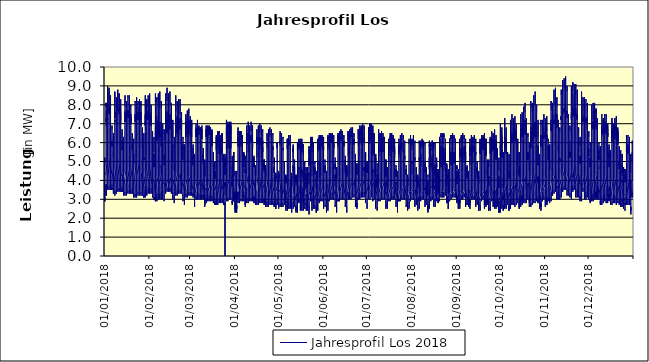
| Category | Jahresprofil Los 2018 |
|---|---|
| 01/01/2018 | 3.5 |
| 01/01/2018 | 3.3 |
| 01/01/2018 | 3.1 |
| 01/01/2018 | 3 |
| 01/01/2018 | 3.1 |
| 01/01/2018 | 2.9 |
| 01/01/2018 | 3 |
| 01/01/2018 | 2.9 |
| 01/01/2018 | 3.2 |
| 01/01/2018 | 3.2 |
| 01/01/2018 | 4 |
| 01/01/2018 | 4.4 |
| 01/01/2018 | 4.3 |
| 01/01/2018 | 4.5 |
| 01/01/2018 | 4.6 |
| 01/01/2018 | 4.7 |
| 01/01/2018 | 5.1 |
| 01/01/2018 | 5 |
| 01/01/2018 | 5.2 |
| 01/01/2018 | 5 |
| 01/01/2018 | 4.4 |
| 01/01/2018 | 4.3 |
| 01/01/2018 | 3.8 |
| 02/01/2018 | 3.5 |
| 02/01/2018 | 3.8 |
| 02/01/2018 | 3.2 |
| 02/01/2018 | 3.5 |
| 02/01/2018 | 3.2 |
| 02/01/2018 | 3.4 |
| 02/01/2018 | 3.7 |
| 02/01/2018 | 4.9 |
| 02/01/2018 | 5.8 |
| 02/01/2018 | 6.4 |
| 02/01/2018 | 6.8 |
| 02/01/2018 | 6.8 |
| 02/01/2018 | 7 |
| 02/01/2018 | 7.2 |
| 02/01/2018 | 7.3 |
| 02/01/2018 | 7.1 |
| 02/01/2018 | 7.1 |
| 02/01/2018 | 7.7 |
| 02/01/2018 | 8.1 |
| 02/01/2018 | 7.9 |
| 02/01/2018 | 8.1 |
| 02/01/2018 | 6.8 |
| 02/01/2018 | 6.1 |
| 02/01/2018 | 5.6 |
| 03/01/2018 | 4.9 |
| 03/01/2018 | 4.1 |
| 03/01/2018 | 4 |
| 03/01/2018 | 3.7 |
| 03/01/2018 | 3.5 |
| 03/01/2018 | 3.7 |
| 03/01/2018 | 4.2 |
| 03/01/2018 | 5 |
| 03/01/2018 | 6 |
| 03/01/2018 | 7 |
| 03/01/2018 | 7.3 |
| 03/01/2018 | 7.2 |
| 03/01/2018 | 7.3 |
| 03/01/2018 | 7.5 |
| 03/01/2018 | 7.7 |
| 03/01/2018 | 7.6 |
| 03/01/2018 | 7.7 |
| 03/01/2018 | 8.5 |
| 03/01/2018 | 9 |
| 03/01/2018 | 7.8 |
| 03/01/2018 | 7.7 |
| 03/01/2018 | 7.4 |
| 03/01/2018 | 6.7 |
| 03/01/2018 | 6 |
| 04/01/2018 | 5.1 |
| 04/01/2018 | 4.1 |
| 04/01/2018 | 4 |
| 04/01/2018 | 3.7 |
| 04/01/2018 | 3.5 |
| 04/01/2018 | 3.7 |
| 04/01/2018 | 4.1 |
| 04/01/2018 | 4.9 |
| 04/01/2018 | 6 |
| 04/01/2018 | 6.9 |
| 04/01/2018 | 7.2 |
| 04/01/2018 | 7.5 |
| 04/01/2018 | 7.6 |
| 04/01/2018 | 7.9 |
| 04/01/2018 | 7.7 |
| 04/01/2018 | 7.5 |
| 04/01/2018 | 7.5 |
| 04/01/2018 | 8.8 |
| 04/01/2018 | 8.9 |
| 04/01/2018 | 7.9 |
| 04/01/2018 | 7.7 |
| 04/01/2018 | 7.5 |
| 04/01/2018 | 6.8 |
| 04/01/2018 | 6 |
| 05/01/2018 | 5.2 |
| 05/01/2018 | 4.2 |
| 05/01/2018 | 3.5 |
| 05/01/2018 | 3.7 |
| 05/01/2018 | 3.5 |
| 05/01/2018 | 3.7 |
| 05/01/2018 | 4.1 |
| 05/01/2018 | 5.3 |
| 05/01/2018 | 6.3 |
| 05/01/2018 | 6.8 |
| 05/01/2018 | 7.1 |
| 05/01/2018 | 7 |
| 05/01/2018 | 7.5 |
| 05/01/2018 | 7.5 |
| 05/01/2018 | 7.5 |
| 05/01/2018 | 7.6 |
| 05/01/2018 | 7.5 |
| 05/01/2018 | 8.2 |
| 05/01/2018 | 8.5 |
| 05/01/2018 | 7.8 |
| 05/01/2018 | 7.6 |
| 05/01/2018 | 7 |
| 05/01/2018 | 6.5 |
| 05/01/2018 | 5.6 |
| 06/01/2018 | 4.7 |
| 06/01/2018 | 4.3 |
| 06/01/2018 | 3.8 |
| 06/01/2018 | 3.5 |
| 06/01/2018 | 3.6 |
| 06/01/2018 | 3.5 |
| 06/01/2018 | 3.5 |
| 06/01/2018 | 3.8 |
| 06/01/2018 | 4.5 |
| 06/01/2018 | 5 |
| 06/01/2018 | 5.4 |
| 06/01/2018 | 6.1 |
| 06/01/2018 | 5.9 |
| 06/01/2018 | 5.9 |
| 06/01/2018 | 5.8 |
| 06/01/2018 | 5.9 |
| 06/01/2018 | 6 |
| 06/01/2018 | 6.9 |
| 06/01/2018 | 6.7 |
| 06/01/2018 | 6.3 |
| 06/01/2018 | 6.3 |
| 06/01/2018 | 6.3 |
| 06/01/2018 | 5.7 |
| 06/01/2018 | 4.9 |
| 07/01/2018 | 4.5 |
| 07/01/2018 | 4 |
| 07/01/2018 | 3.6 |
| 07/01/2018 | 3.4 |
| 07/01/2018 | 3.4 |
| 07/01/2018 | 3.3 |
| 07/01/2018 | 3.5 |
| 07/01/2018 | 3.6 |
| 07/01/2018 | 3.6 |
| 07/01/2018 | 4.4 |
| 07/01/2018 | 4.8 |
| 07/01/2018 | 5.1 |
| 07/01/2018 | 5.4 |
| 07/01/2018 | 5.4 |
| 07/01/2018 | 5.5 |
| 07/01/2018 | 5.2 |
| 07/01/2018 | 5.2 |
| 07/01/2018 | 6.2 |
| 07/01/2018 | 6.5 |
| 07/01/2018 | 6 |
| 07/01/2018 | 6 |
| 07/01/2018 | 6.1 |
| 07/01/2018 | 5.7 |
| 07/01/2018 | 5 |
| 08/01/2018 | 4.4 |
| 08/01/2018 | 4 |
| 08/01/2018 | 3.6 |
| 08/01/2018 | 3.4 |
| 08/01/2018 | 3.2 |
| 08/01/2018 | 3.5 |
| 08/01/2018 | 4 |
| 08/01/2018 | 4.9 |
| 08/01/2018 | 5.9 |
| 08/01/2018 | 6.8 |
| 08/01/2018 | 7.2 |
| 08/01/2018 | 7.1 |
| 08/01/2018 | 7.2 |
| 08/01/2018 | 7.4 |
| 08/01/2018 | 7.3 |
| 08/01/2018 | 7.6 |
| 08/01/2018 | 7.5 |
| 08/01/2018 | 8.1 |
| 08/01/2018 | 8.7 |
| 08/01/2018 | 8.1 |
| 08/01/2018 | 8 |
| 08/01/2018 | 7.2 |
| 08/01/2018 | 6.5 |
| 08/01/2018 | 5.6 |
| 09/01/2018 | 4.8 |
| 09/01/2018 | 3.8 |
| 09/01/2018 | 3.7 |
| 09/01/2018 | 3.5 |
| 09/01/2018 | 3.3 |
| 09/01/2018 | 3.5 |
| 09/01/2018 | 4 |
| 09/01/2018 | 5.3 |
| 09/01/2018 | 6.3 |
| 09/01/2018 | 6.8 |
| 09/01/2018 | 7 |
| 09/01/2018 | 7.4 |
| 09/01/2018 | 7.4 |
| 09/01/2018 | 7.6 |
| 09/01/2018 | 7.4 |
| 09/01/2018 | 7.7 |
| 09/01/2018 | 7.7 |
| 09/01/2018 | 8.3 |
| 09/01/2018 | 8.4 |
| 09/01/2018 | 7.8 |
| 09/01/2018 | 7.7 |
| 09/01/2018 | 7.3 |
| 09/01/2018 | 6.5 |
| 09/01/2018 | 5.7 |
| 10/01/2018 | 4.8 |
| 10/01/2018 | 4 |
| 10/01/2018 | 3.8 |
| 10/01/2018 | 3.6 |
| 10/01/2018 | 3.4 |
| 10/01/2018 | 3.6 |
| 10/01/2018 | 4 |
| 10/01/2018 | 5.4 |
| 10/01/2018 | 6.4 |
| 10/01/2018 | 6.8 |
| 10/01/2018 | 7.1 |
| 10/01/2018 | 7.5 |
| 10/01/2018 | 7.5 |
| 10/01/2018 | 7.7 |
| 10/01/2018 | 7.9 |
| 10/01/2018 | 7.7 |
| 10/01/2018 | 7.7 |
| 10/01/2018 | 8.6 |
| 10/01/2018 | 8.8 |
| 10/01/2018 | 8.1 |
| 10/01/2018 | 8 |
| 10/01/2018 | 7.1 |
| 10/01/2018 | 6.4 |
| 10/01/2018 | 5.7 |
| 11/01/2018 | 4.9 |
| 11/01/2018 | 4 |
| 11/01/2018 | 3.9 |
| 11/01/2018 | 3.6 |
| 11/01/2018 | 3.4 |
| 11/01/2018 | 3.6 |
| 11/01/2018 | 4 |
| 11/01/2018 | 5.3 |
| 11/01/2018 | 6.3 |
| 11/01/2018 | 6.7 |
| 11/01/2018 | 6.9 |
| 11/01/2018 | 7.3 |
| 11/01/2018 | 7.4 |
| 11/01/2018 | 7.5 |
| 11/01/2018 | 7.8 |
| 11/01/2018 | 7.6 |
| 11/01/2018 | 7.5 |
| 11/01/2018 | 8.4 |
| 11/01/2018 | 8.6 |
| 11/01/2018 | 8.2 |
| 11/01/2018 | 8 |
| 11/01/2018 | 7.2 |
| 11/01/2018 | 6.4 |
| 11/01/2018 | 5.7 |
| 12/01/2018 | 4.9 |
| 12/01/2018 | 4.1 |
| 12/01/2018 | 3.9 |
| 12/01/2018 | 3.6 |
| 12/01/2018 | 3.4 |
| 12/01/2018 | 3.6 |
| 12/01/2018 | 4 |
| 12/01/2018 | 5.2 |
| 12/01/2018 | 6.1 |
| 12/01/2018 | 6.6 |
| 12/01/2018 | 6.9 |
| 12/01/2018 | 7.2 |
| 12/01/2018 | 7.2 |
| 12/01/2018 | 7.2 |
| 12/01/2018 | 7.6 |
| 12/01/2018 | 7.2 |
| 12/01/2018 | 7 |
| 12/01/2018 | 7.9 |
| 12/01/2018 | 8.3 |
| 12/01/2018 | 7.6 |
| 12/01/2018 | 7.4 |
| 12/01/2018 | 6.7 |
| 12/01/2018 | 6.2 |
| 12/01/2018 | 5.3 |
| 13/01/2018 | 4.4 |
| 13/01/2018 | 4.2 |
| 13/01/2018 | 3.7 |
| 13/01/2018 | 3.4 |
| 13/01/2018 | 3.5 |
| 13/01/2018 | 3.4 |
| 13/01/2018 | 3.4 |
| 13/01/2018 | 3.7 |
| 13/01/2018 | 4.4 |
| 13/01/2018 | 4.8 |
| 13/01/2018 | 5.7 |
| 13/01/2018 | 5.9 |
| 13/01/2018 | 6.1 |
| 13/01/2018 | 6.1 |
| 13/01/2018 | 6 |
| 13/01/2018 | 5.6 |
| 13/01/2018 | 6 |
| 13/01/2018 | 6.1 |
| 13/01/2018 | 6.6 |
| 13/01/2018 | 6.7 |
| 13/01/2018 | 6.1 |
| 13/01/2018 | 6 |
| 13/01/2018 | 5.4 |
| 13/01/2018 | 5.2 |
| 14/01/2018 | 4.3 |
| 14/01/2018 | 3.9 |
| 14/01/2018 | 3.5 |
| 14/01/2018 | 3.3 |
| 14/01/2018 | 3.4 |
| 14/01/2018 | 3.2 |
| 14/01/2018 | 3.4 |
| 14/01/2018 | 3.6 |
| 14/01/2018 | 4 |
| 14/01/2018 | 4.2 |
| 14/01/2018 | 4.6 |
| 14/01/2018 | 4.9 |
| 14/01/2018 | 5.1 |
| 14/01/2018 | 5.1 |
| 14/01/2018 | 5.2 |
| 14/01/2018 | 5.3 |
| 14/01/2018 | 5.4 |
| 14/01/2018 | 6 |
| 14/01/2018 | 6.3 |
| 14/01/2018 | 6.3 |
| 14/01/2018 | 5.8 |
| 14/01/2018 | 5.8 |
| 14/01/2018 | 5.4 |
| 14/01/2018 | 4.7 |
| 15/01/2018 | 4.2 |
| 15/01/2018 | 3.8 |
| 15/01/2018 | 3.4 |
| 15/01/2018 | 3.3 |
| 15/01/2018 | 3.2 |
| 15/01/2018 | 3.4 |
| 15/01/2018 | 3.9 |
| 15/01/2018 | 4.8 |
| 15/01/2018 | 6.2 |
| 15/01/2018 | 6.6 |
| 15/01/2018 | 7 |
| 15/01/2018 | 7.4 |
| 15/01/2018 | 7.4 |
| 15/01/2018 | 7.6 |
| 15/01/2018 | 7.4 |
| 15/01/2018 | 7.2 |
| 15/01/2018 | 7.1 |
| 15/01/2018 | 7.7 |
| 15/01/2018 | 8.5 |
| 15/01/2018 | 7.9 |
| 15/01/2018 | 7.8 |
| 15/01/2018 | 6.9 |
| 15/01/2018 | 6.1 |
| 15/01/2018 | 5.3 |
| 16/01/2018 | 4.5 |
| 16/01/2018 | 4.2 |
| 16/01/2018 | 3.6 |
| 16/01/2018 | 3.4 |
| 16/01/2018 | 3.2 |
| 16/01/2018 | 3.4 |
| 16/01/2018 | 3.9 |
| 16/01/2018 | 5.2 |
| 16/01/2018 | 6.1 |
| 16/01/2018 | 6.5 |
| 16/01/2018 | 7.3 |
| 16/01/2018 | 7.1 |
| 16/01/2018 | 7.7 |
| 16/01/2018 | 7.3 |
| 16/01/2018 | 7.5 |
| 16/01/2018 | 7.3 |
| 16/01/2018 | 7.2 |
| 16/01/2018 | 7.9 |
| 16/01/2018 | 8.2 |
| 16/01/2018 | 8.1 |
| 16/01/2018 | 8 |
| 16/01/2018 | 7 |
| 16/01/2018 | 6.2 |
| 16/01/2018 | 5.4 |
| 17/01/2018 | 4.6 |
| 17/01/2018 | 3.8 |
| 17/01/2018 | 3.7 |
| 17/01/2018 | 3.5 |
| 17/01/2018 | 3.3 |
| 17/01/2018 | 3.5 |
| 17/01/2018 | 3.9 |
| 17/01/2018 | 5.3 |
| 17/01/2018 | 6.2 |
| 17/01/2018 | 6.6 |
| 17/01/2018 | 7.4 |
| 17/01/2018 | 7.3 |
| 17/01/2018 | 7.7 |
| 17/01/2018 | 7.3 |
| 17/01/2018 | 7.5 |
| 17/01/2018 | 7.3 |
| 17/01/2018 | 7.7 |
| 17/01/2018 | 8.3 |
| 17/01/2018 | 8.5 |
| 17/01/2018 | 8.4 |
| 17/01/2018 | 7.8 |
| 17/01/2018 | 7.4 |
| 17/01/2018 | 6.1 |
| 17/01/2018 | 5.4 |
| 18/01/2018 | 4.6 |
| 18/01/2018 | 3.9 |
| 18/01/2018 | 3.7 |
| 18/01/2018 | 3.5 |
| 18/01/2018 | 3.3 |
| 18/01/2018 | 3.5 |
| 18/01/2018 | 3.9 |
| 18/01/2018 | 5.2 |
| 18/01/2018 | 6.1 |
| 18/01/2018 | 7 |
| 18/01/2018 | 7.2 |
| 18/01/2018 | 7.1 |
| 18/01/2018 | 7.6 |
| 18/01/2018 | 7.7 |
| 18/01/2018 | 7.4 |
| 18/01/2018 | 7.7 |
| 18/01/2018 | 7.5 |
| 18/01/2018 | 8.1 |
| 18/01/2018 | 8.4 |
| 18/01/2018 | 8.5 |
| 18/01/2018 | 7.8 |
| 18/01/2018 | 6.9 |
| 18/01/2018 | 6.1 |
| 18/01/2018 | 5.4 |
| 19/01/2018 | 4.7 |
| 19/01/2018 | 3.9 |
| 19/01/2018 | 3.8 |
| 19/01/2018 | 3.5 |
| 19/01/2018 | 3.3 |
| 19/01/2018 | 3.5 |
| 19/01/2018 | 3.9 |
| 19/01/2018 | 5.1 |
| 19/01/2018 | 5.9 |
| 19/01/2018 | 6.9 |
| 19/01/2018 | 7.2 |
| 19/01/2018 | 7 |
| 19/01/2018 | 7.5 |
| 19/01/2018 | 7.4 |
| 19/01/2018 | 7.2 |
| 19/01/2018 | 7.3 |
| 19/01/2018 | 7.1 |
| 19/01/2018 | 7.5 |
| 19/01/2018 | 8 |
| 19/01/2018 | 7.9 |
| 19/01/2018 | 7.7 |
| 19/01/2018 | 6.9 |
| 19/01/2018 | 5.9 |
| 19/01/2018 | 5 |
| 20/01/2018 | 4.7 |
| 20/01/2018 | 4 |
| 20/01/2018 | 3.6 |
| 20/01/2018 | 3.3 |
| 20/01/2018 | 3.4 |
| 20/01/2018 | 3.3 |
| 20/01/2018 | 3.3 |
| 20/01/2018 | 3.6 |
| 20/01/2018 | 4.2 |
| 20/01/2018 | 5.1 |
| 20/01/2018 | 5.5 |
| 20/01/2018 | 5.7 |
| 20/01/2018 | 5.9 |
| 20/01/2018 | 5.8 |
| 20/01/2018 | 5.7 |
| 20/01/2018 | 5.7 |
| 20/01/2018 | 5.6 |
| 20/01/2018 | 5.9 |
| 20/01/2018 | 6.4 |
| 20/01/2018 | 6.5 |
| 20/01/2018 | 6.5 |
| 20/01/2018 | 5.7 |
| 20/01/2018 | 5.1 |
| 20/01/2018 | 4.9 |
| 21/01/2018 | 4.5 |
| 21/01/2018 | 3.7 |
| 21/01/2018 | 3.4 |
| 21/01/2018 | 3.2 |
| 21/01/2018 | 3.3 |
| 21/01/2018 | 3.1 |
| 21/01/2018 | 3.3 |
| 21/01/2018 | 3.5 |
| 21/01/2018 | 3.9 |
| 21/01/2018 | 4.1 |
| 21/01/2018 | 4.5 |
| 21/01/2018 | 4.8 |
| 21/01/2018 | 4.9 |
| 21/01/2018 | 5.4 |
| 21/01/2018 | 4.9 |
| 21/01/2018 | 5 |
| 21/01/2018 | 5 |
| 21/01/2018 | 5.3 |
| 21/01/2018 | 6.2 |
| 21/01/2018 | 6.2 |
| 21/01/2018 | 6.1 |
| 21/01/2018 | 5.5 |
| 21/01/2018 | 5.1 |
| 21/01/2018 | 4.9 |
| 22/01/2018 | 4.5 |
| 22/01/2018 | 3.7 |
| 22/01/2018 | 3.3 |
| 22/01/2018 | 3.2 |
| 22/01/2018 | 3.1 |
| 22/01/2018 | 3.3 |
| 22/01/2018 | 3.8 |
| 22/01/2018 | 5.2 |
| 22/01/2018 | 6 |
| 22/01/2018 | 6.4 |
| 22/01/2018 | 6.7 |
| 22/01/2018 | 7.1 |
| 22/01/2018 | 7.1 |
| 22/01/2018 | 7.3 |
| 22/01/2018 | 7.5 |
| 22/01/2018 | 7.3 |
| 22/01/2018 | 7.1 |
| 22/01/2018 | 7.4 |
| 22/01/2018 | 8.2 |
| 22/01/2018 | 8.2 |
| 22/01/2018 | 8.1 |
| 22/01/2018 | 7.1 |
| 22/01/2018 | 5.8 |
| 22/01/2018 | 5.5 |
| 23/01/2018 | 4.8 |
| 23/01/2018 | 4 |
| 23/01/2018 | 3.5 |
| 23/01/2018 | 3.3 |
| 23/01/2018 | 3.1 |
| 23/01/2018 | 3.3 |
| 23/01/2018 | 4.3 |
| 23/01/2018 | 5.1 |
| 23/01/2018 | 5.9 |
| 23/01/2018 | 6.8 |
| 23/01/2018 | 7.1 |
| 23/01/2018 | 7.4 |
| 23/01/2018 | 7.4 |
| 23/01/2018 | 7.5 |
| 23/01/2018 | 7.6 |
| 23/01/2018 | 7.4 |
| 23/01/2018 | 7.2 |
| 23/01/2018 | 7.5 |
| 23/01/2018 | 8.4 |
| 23/01/2018 | 8.4 |
| 23/01/2018 | 7.8 |
| 23/01/2018 | 6.7 |
| 23/01/2018 | 5.9 |
| 23/01/2018 | 5.1 |
| 24/01/2018 | 4.8 |
| 24/01/2018 | 4.2 |
| 24/01/2018 | 3.6 |
| 24/01/2018 | 3.4 |
| 24/01/2018 | 3.2 |
| 24/01/2018 | 3.4 |
| 24/01/2018 | 4.3 |
| 24/01/2018 | 5.2 |
| 24/01/2018 | 6 |
| 24/01/2018 | 6.9 |
| 24/01/2018 | 7.2 |
| 24/01/2018 | 7.5 |
| 24/01/2018 | 7.5 |
| 24/01/2018 | 7.5 |
| 24/01/2018 | 7.6 |
| 24/01/2018 | 7.4 |
| 24/01/2018 | 7.2 |
| 24/01/2018 | 7.9 |
| 24/01/2018 | 8.2 |
| 24/01/2018 | 8.2 |
| 24/01/2018 | 8 |
| 24/01/2018 | 7.1 |
| 24/01/2018 | 6.3 |
| 24/01/2018 | 5.6 |
| 25/01/2018 | 4.9 |
| 25/01/2018 | 4.2 |
| 25/01/2018 | 3.6 |
| 25/01/2018 | 3.4 |
| 25/01/2018 | 3.2 |
| 25/01/2018 | 3.4 |
| 25/01/2018 | 4.3 |
| 25/01/2018 | 5.1 |
| 25/01/2018 | 6 |
| 25/01/2018 | 6.8 |
| 25/01/2018 | 7 |
| 25/01/2018 | 7.3 |
| 25/01/2018 | 7.3 |
| 25/01/2018 | 7.4 |
| 25/01/2018 | 7.5 |
| 25/01/2018 | 7.2 |
| 25/01/2018 | 7.5 |
| 25/01/2018 | 7.7 |
| 25/01/2018 | 8.1 |
| 25/01/2018 | 8.3 |
| 25/01/2018 | 8.1 |
| 25/01/2018 | 7.1 |
| 25/01/2018 | 5.8 |
| 25/01/2018 | 5.1 |
| 26/01/2018 | 4.4 |
| 26/01/2018 | 4.3 |
| 26/01/2018 | 3.6 |
| 26/01/2018 | 3.4 |
| 26/01/2018 | 3.2 |
| 26/01/2018 | 3.4 |
| 26/01/2018 | 4.3 |
| 26/01/2018 | 5 |
| 26/01/2018 | 6.3 |
| 26/01/2018 | 6.7 |
| 26/01/2018 | 6.9 |
| 26/01/2018 | 7.3 |
| 26/01/2018 | 7.2 |
| 26/01/2018 | 7.6 |
| 26/01/2018 | 7.4 |
| 26/01/2018 | 6.9 |
| 26/01/2018 | 7.1 |
| 26/01/2018 | 7.2 |
| 26/01/2018 | 7.8 |
| 26/01/2018 | 8.2 |
| 26/01/2018 | 7.5 |
| 26/01/2018 | 6.6 |
| 26/01/2018 | 5.6 |
| 26/01/2018 | 5.2 |
| 27/01/2018 | 4.5 |
| 27/01/2018 | 3.9 |
| 27/01/2018 | 3.4 |
| 27/01/2018 | 3.2 |
| 27/01/2018 | 3.3 |
| 27/01/2018 | 3.2 |
| 27/01/2018 | 3.2 |
| 27/01/2018 | 4.1 |
| 27/01/2018 | 4.6 |
| 27/01/2018 | 5 |
| 27/01/2018 | 5.3 |
| 27/01/2018 | 6 |
| 27/01/2018 | 6.2 |
| 27/01/2018 | 6.1 |
| 27/01/2018 | 5.9 |
| 27/01/2018 | 5.9 |
| 27/01/2018 | 5.7 |
| 27/01/2018 | 5.7 |
| 27/01/2018 | 6.3 |
| 27/01/2018 | 6.8 |
| 27/01/2018 | 6.3 |
| 27/01/2018 | 5.5 |
| 27/01/2018 | 5.3 |
| 27/01/2018 | 4.6 |
| 28/01/2018 | 4.3 |
| 28/01/2018 | 3.6 |
| 28/01/2018 | 3.3 |
| 28/01/2018 | 3.1 |
| 28/01/2018 | 3.2 |
| 28/01/2018 | 3.1 |
| 28/01/2018 | 3.2 |
| 28/01/2018 | 3.4 |
| 28/01/2018 | 3.8 |
| 28/01/2018 | 4.4 |
| 28/01/2018 | 4.8 |
| 28/01/2018 | 5.1 |
| 28/01/2018 | 5.2 |
| 28/01/2018 | 5.1 |
| 28/01/2018 | 5.1 |
| 28/01/2018 | 5.2 |
| 28/01/2018 | 5.1 |
| 28/01/2018 | 5.1 |
| 28/01/2018 | 6.1 |
| 28/01/2018 | 6.5 |
| 28/01/2018 | 6 |
| 28/01/2018 | 5.3 |
| 28/01/2018 | 4.8 |
| 28/01/2018 | 4.7 |
| 29/01/2018 | 4.3 |
| 29/01/2018 | 3.6 |
| 29/01/2018 | 3.2 |
| 29/01/2018 | 3.1 |
| 29/01/2018 | 3.5 |
| 29/01/2018 | 3.2 |
| 29/01/2018 | 3.7 |
| 29/01/2018 | 5.1 |
| 29/01/2018 | 5.8 |
| 29/01/2018 | 6.7 |
| 29/01/2018 | 7 |
| 29/01/2018 | 6.9 |
| 29/01/2018 | 7.4 |
| 29/01/2018 | 7.5 |
| 29/01/2018 | 7.2 |
| 29/01/2018 | 6.9 |
| 29/01/2018 | 7.1 |
| 29/01/2018 | 7 |
| 29/01/2018 | 8 |
| 29/01/2018 | 8.5 |
| 29/01/2018 | 7.9 |
| 29/01/2018 | 6.8 |
| 29/01/2018 | 6 |
| 29/01/2018 | 5.2 |
| 30/01/2018 | 4.5 |
| 30/01/2018 | 3.9 |
| 30/01/2018 | 3.4 |
| 30/01/2018 | 3.2 |
| 30/01/2018 | 3.5 |
| 30/01/2018 | 3.8 |
| 30/01/2018 | 4.2 |
| 30/01/2018 | 5 |
| 30/01/2018 | 6.2 |
| 30/01/2018 | 6.6 |
| 30/01/2018 | 6.9 |
| 30/01/2018 | 7.2 |
| 30/01/2018 | 7.6 |
| 30/01/2018 | 7.7 |
| 30/01/2018 | 7.3 |
| 30/01/2018 | 7.5 |
| 30/01/2018 | 7.3 |
| 30/01/2018 | 7.2 |
| 30/01/2018 | 8.2 |
| 30/01/2018 | 8.3 |
| 30/01/2018 | 8.1 |
| 30/01/2018 | 6.9 |
| 30/01/2018 | 6.1 |
| 30/01/2018 | 5.3 |
| 31/01/2018 | 4.6 |
| 31/01/2018 | 4 |
| 31/01/2018 | 3.5 |
| 31/01/2018 | 3.3 |
| 31/01/2018 | 3.6 |
| 31/01/2018 | 3.8 |
| 31/01/2018 | 4.2 |
| 31/01/2018 | 5.1 |
| 31/01/2018 | 6.3 |
| 31/01/2018 | 6.7 |
| 31/01/2018 | 6.9 |
| 31/01/2018 | 7.3 |
| 31/01/2018 | 7.7 |
| 31/01/2018 | 7.7 |
| 31/01/2018 | 7.3 |
| 31/01/2018 | 7.5 |
| 31/01/2018 | 7.2 |
| 31/01/2018 | 7.6 |
| 31/01/2018 | 8 |
| 31/01/2018 | 8.5 |
| 31/01/2018 | 7.8 |
| 31/01/2018 | 6.8 |
| 31/01/2018 | 6 |
| 31/01/2018 | 5.3 |
| 01/02/2018 | 4.6 |
| 01/02/2018 | 4.1 |
| 01/02/2018 | 3.5 |
| 01/02/2018 | 3.3 |
| 01/02/2018 | 3.6 |
| 01/02/2018 | 3.8 |
| 01/02/2018 | 4.2 |
| 01/02/2018 | 5 |
| 01/02/2018 | 6.3 |
| 01/02/2018 | 6.6 |
| 01/02/2018 | 6.8 |
| 01/02/2018 | 7.1 |
| 01/02/2018 | 7.5 |
| 01/02/2018 | 7.6 |
| 01/02/2018 | 7.2 |
| 01/02/2018 | 7.3 |
| 01/02/2018 | 7.1 |
| 01/02/2018 | 7.4 |
| 01/02/2018 | 7.9 |
| 01/02/2018 | 8.6 |
| 01/02/2018 | 7.9 |
| 01/02/2018 | 6.8 |
| 01/02/2018 | 6 |
| 01/02/2018 | 5.3 |
| 02/02/2018 | 4.7 |
| 02/02/2018 | 4.1 |
| 02/02/2018 | 3.5 |
| 02/02/2018 | 3.3 |
| 02/02/2018 | 3.6 |
| 02/02/2018 | 3.8 |
| 02/02/2018 | 4.2 |
| 02/02/2018 | 4.9 |
| 02/02/2018 | 6.1 |
| 02/02/2018 | 6.5 |
| 02/02/2018 | 6.7 |
| 02/02/2018 | 7.1 |
| 02/02/2018 | 7.4 |
| 02/02/2018 | 7.3 |
| 02/02/2018 | 7 |
| 02/02/2018 | 7 |
| 02/02/2018 | 7.1 |
| 02/02/2018 | 6.9 |
| 02/02/2018 | 7.6 |
| 02/02/2018 | 8 |
| 02/02/2018 | 7.3 |
| 02/02/2018 | 6.3 |
| 02/02/2018 | 5.7 |
| 02/02/2018 | 4.9 |
| 03/02/2018 | 4.2 |
| 03/02/2018 | 3.7 |
| 03/02/2018 | 3.3 |
| 03/02/2018 | 3.6 |
| 03/02/2018 | 3.2 |
| 03/02/2018 | 3.1 |
| 03/02/2018 | 3.6 |
| 03/02/2018 | 4 |
| 03/02/2018 | 4.4 |
| 03/02/2018 | 4.8 |
| 03/02/2018 | 5.6 |
| 03/02/2018 | 5.8 |
| 03/02/2018 | 5.9 |
| 03/02/2018 | 5.8 |
| 03/02/2018 | 5.6 |
| 03/02/2018 | 5.6 |
| 03/02/2018 | 5.3 |
| 03/02/2018 | 5.5 |
| 03/02/2018 | 6.1 |
| 03/02/2018 | 6.6 |
| 03/02/2018 | 6.6 |
| 03/02/2018 | 5.7 |
| 03/02/2018 | 5 |
| 03/02/2018 | 4.4 |
| 04/02/2018 | 4.1 |
| 04/02/2018 | 3.9 |
| 04/02/2018 | 3.2 |
| 04/02/2018 | 3 |
| 04/02/2018 | 3.1 |
| 04/02/2018 | 3 |
| 04/02/2018 | 3.1 |
| 04/02/2018 | 3.4 |
| 04/02/2018 | 3.6 |
| 04/02/2018 | 4.3 |
| 04/02/2018 | 4.6 |
| 04/02/2018 | 4.9 |
| 04/02/2018 | 5 |
| 04/02/2018 | 5.4 |
| 04/02/2018 | 4.9 |
| 04/02/2018 | 4.9 |
| 04/02/2018 | 4.7 |
| 04/02/2018 | 5 |
| 04/02/2018 | 6 |
| 04/02/2018 | 6.3 |
| 04/02/2018 | 6.3 |
| 04/02/2018 | 5.5 |
| 04/02/2018 | 5.1 |
| 04/02/2018 | 4.4 |
| 05/02/2018 | 4 |
| 05/02/2018 | 3.3 |
| 05/02/2018 | 3 |
| 05/02/2018 | 2.9 |
| 05/02/2018 | 3.2 |
| 05/02/2018 | 2.9 |
| 05/02/2018 | 3.7 |
| 05/02/2018 | 4.6 |
| 05/02/2018 | 5.5 |
| 05/02/2018 | 6.4 |
| 05/02/2018 | 6.4 |
| 05/02/2018 | 6.9 |
| 05/02/2018 | 6.9 |
| 05/02/2018 | 6.9 |
| 05/02/2018 | 6.4 |
| 05/02/2018 | 6.5 |
| 05/02/2018 | 6.1 |
| 05/02/2018 | 5.9 |
| 05/02/2018 | 7.2 |
| 05/02/2018 | 8.6 |
| 05/02/2018 | 7.9 |
| 05/02/2018 | 6.3 |
| 05/02/2018 | 4.9 |
| 05/02/2018 | 4.6 |
| 06/02/2018 | 4.2 |
| 06/02/2018 | 3.6 |
| 06/02/2018 | 3.1 |
| 06/02/2018 | 2.9 |
| 06/02/2018 | 3.3 |
| 06/02/2018 | 3.4 |
| 06/02/2018 | 3.7 |
| 06/02/2018 | 4.4 |
| 06/02/2018 | 5.8 |
| 06/02/2018 | 6.3 |
| 06/02/2018 | 6.7 |
| 06/02/2018 | 6.7 |
| 06/02/2018 | 7.1 |
| 06/02/2018 | 7.1 |
| 06/02/2018 | 6.5 |
| 06/02/2018 | 6.6 |
| 06/02/2018 | 6.2 |
| 06/02/2018 | 6.1 |
| 06/02/2018 | 7.4 |
| 06/02/2018 | 8.4 |
| 06/02/2018 | 8.1 |
| 06/02/2018 | 5.9 |
| 06/02/2018 | 5 |
| 06/02/2018 | 4.6 |
| 07/02/2018 | 4.2 |
| 07/02/2018 | 3.8 |
| 07/02/2018 | 3.2 |
| 07/02/2018 | 3 |
| 07/02/2018 | 3.3 |
| 07/02/2018 | 3.5 |
| 07/02/2018 | 3.7 |
| 07/02/2018 | 5 |
| 07/02/2018 | 5.9 |
| 07/02/2018 | 6.4 |
| 07/02/2018 | 6.8 |
| 07/02/2018 | 6.8 |
| 07/02/2018 | 7.2 |
| 07/02/2018 | 7.1 |
| 07/02/2018 | 6.5 |
| 07/02/2018 | 6.6 |
| 07/02/2018 | 6.7 |
| 07/02/2018 | 6.5 |
| 07/02/2018 | 7.2 |
| 07/02/2018 | 8.6 |
| 07/02/2018 | 7.8 |
| 07/02/2018 | 6.2 |
| 07/02/2018 | 5.4 |
| 07/02/2018 | 4.6 |
| 08/02/2018 | 4.2 |
| 08/02/2018 | 3.8 |
| 08/02/2018 | 3.2 |
| 08/02/2018 | 3 |
| 08/02/2018 | 3.3 |
| 08/02/2018 | 3.5 |
| 08/02/2018 | 3.7 |
| 08/02/2018 | 4.9 |
| 08/02/2018 | 5.9 |
| 08/02/2018 | 6.3 |
| 08/02/2018 | 6.7 |
| 08/02/2018 | 7.1 |
| 08/02/2018 | 7 |
| 08/02/2018 | 7 |
| 08/02/2018 | 6.9 |
| 08/02/2018 | 6.4 |
| 08/02/2018 | 6.5 |
| 08/02/2018 | 6.3 |
| 08/02/2018 | 7.1 |
| 08/02/2018 | 8.7 |
| 08/02/2018 | 7.9 |
| 08/02/2018 | 5.8 |
| 08/02/2018 | 4.9 |
| 08/02/2018 | 4.6 |
| 09/02/2018 | 4.3 |
| 09/02/2018 | 3.9 |
| 09/02/2018 | 3.3 |
| 09/02/2018 | 3 |
| 09/02/2018 | 3.4 |
| 09/02/2018 | 3.5 |
| 09/02/2018 | 3.7 |
| 09/02/2018 | 4.8 |
| 09/02/2018 | 5.7 |
| 09/02/2018 | 6.2 |
| 09/02/2018 | 6.6 |
| 09/02/2018 | 6.6 |
| 09/02/2018 | 6.9 |
| 09/02/2018 | 6.7 |
| 09/02/2018 | 6.3 |
| 09/02/2018 | 6.1 |
| 09/02/2018 | 6.1 |
| 09/02/2018 | 5.8 |
| 09/02/2018 | 6.8 |
| 09/02/2018 | 8.2 |
| 09/02/2018 | 7.8 |
| 09/02/2018 | 5.8 |
| 09/02/2018 | 4.7 |
| 09/02/2018 | 4.8 |
| 10/02/2018 | 4.3 |
| 10/02/2018 | 4.1 |
| 10/02/2018 | 3.7 |
| 10/02/2018 | 3.5 |
| 10/02/2018 | 3.1 |
| 10/02/2018 | 3 |
| 10/02/2018 | 3.5 |
| 10/02/2018 | 3.9 |
| 10/02/2018 | 4.3 |
| 10/02/2018 | 4.7 |
| 10/02/2018 | 5.5 |
| 10/02/2018 | 5.6 |
| 10/02/2018 | 5.7 |
| 10/02/2018 | 6 |
| 10/02/2018 | 5.8 |
| 10/02/2018 | 5.7 |
| 10/02/2018 | 5.4 |
| 10/02/2018 | 5.3 |
| 10/02/2018 | 6 |
| 10/02/2018 | 7 |
| 10/02/2018 | 6.4 |
| 10/02/2018 | 5.5 |
| 10/02/2018 | 4.8 |
| 10/02/2018 | 4.6 |
| 11/02/2018 | 3.9 |
| 11/02/2018 | 3.8 |
| 11/02/2018 | 3.5 |
| 11/02/2018 | 3.4 |
| 11/02/2018 | 3 |
| 11/02/2018 | 2.9 |
| 11/02/2018 | 3 |
| 11/02/2018 | 3.3 |
| 11/02/2018 | 4 |
| 11/02/2018 | 4.2 |
| 11/02/2018 | 4.5 |
| 11/02/2018 | 4.8 |
| 11/02/2018 | 5.3 |
| 11/02/2018 | 5.1 |
| 11/02/2018 | 5.1 |
| 11/02/2018 | 5.1 |
| 11/02/2018 | 4.9 |
| 11/02/2018 | 4.8 |
| 11/02/2018 | 5.4 |
| 11/02/2018 | 6.7 |
| 11/02/2018 | 6.1 |
| 11/02/2018 | 5.3 |
| 11/02/2018 | 4.8 |
| 11/02/2018 | 4.7 |
| 12/02/2018 | 3.8 |
| 12/02/2018 | 3.8 |
| 12/02/2018 | 3.5 |
| 12/02/2018 | 3.4 |
| 12/02/2018 | 3.3 |
| 12/02/2018 | 3.5 |
| 12/02/2018 | 4 |
| 12/02/2018 | 4.9 |
| 12/02/2018 | 5.9 |
| 12/02/2018 | 6.3 |
| 12/02/2018 | 6.6 |
| 12/02/2018 | 6.9 |
| 12/02/2018 | 7.3 |
| 12/02/2018 | 7.4 |
| 12/02/2018 | 6.9 |
| 12/02/2018 | 7.1 |
| 12/02/2018 | 6.7 |
| 12/02/2018 | 6.4 |
| 12/02/2018 | 7.5 |
| 12/02/2018 | 8.6 |
| 12/02/2018 | 8 |
| 12/02/2018 | 6.7 |
| 12/02/2018 | 5.4 |
| 12/02/2018 | 4.7 |
| 13/02/2018 | 4.1 |
| 13/02/2018 | 3.6 |
| 13/02/2018 | 3.6 |
| 13/02/2018 | 3.5 |
| 13/02/2018 | 3.4 |
| 13/02/2018 | 3.6 |
| 13/02/2018 | 4 |
| 13/02/2018 | 5.3 |
| 13/02/2018 | 5.8 |
| 13/02/2018 | 6.7 |
| 13/02/2018 | 6.9 |
| 13/02/2018 | 7.2 |
| 13/02/2018 | 7.6 |
| 13/02/2018 | 7.5 |
| 13/02/2018 | 7 |
| 13/02/2018 | 7.2 |
| 13/02/2018 | 6.8 |
| 13/02/2018 | 6.5 |
| 13/02/2018 | 7.7 |
| 13/02/2018 | 8.9 |
| 13/02/2018 | 8.2 |
| 13/02/2018 | 6.3 |
| 13/02/2018 | 5.4 |
| 13/02/2018 | 4.7 |
| 14/02/2018 | 4.1 |
| 14/02/2018 | 3.8 |
| 14/02/2018 | 3.7 |
| 14/02/2018 | 3.6 |
| 14/02/2018 | 3.4 |
| 14/02/2018 | 3.6 |
| 14/02/2018 | 4 |
| 14/02/2018 | 5.4 |
| 14/02/2018 | 5.9 |
| 14/02/2018 | 6.8 |
| 14/02/2018 | 7 |
| 14/02/2018 | 7.3 |
| 14/02/2018 | 7.1 |
| 14/02/2018 | 7.6 |
| 14/02/2018 | 7 |
| 14/02/2018 | 7.2 |
| 14/02/2018 | 6.8 |
| 14/02/2018 | 7 |
| 14/02/2018 | 7.5 |
| 14/02/2018 | 8.6 |
| 14/02/2018 | 7.9 |
| 14/02/2018 | 6.7 |
| 14/02/2018 | 5.3 |
| 14/02/2018 | 4.7 |
| 15/02/2018 | 4.2 |
| 15/02/2018 | 3.8 |
| 15/02/2018 | 3.7 |
| 15/02/2018 | 3.6 |
| 15/02/2018 | 3.4 |
| 15/02/2018 | 3.6 |
| 15/02/2018 | 4 |
| 15/02/2018 | 5.3 |
| 15/02/2018 | 5.9 |
| 15/02/2018 | 6.7 |
| 15/02/2018 | 6.9 |
| 15/02/2018 | 7.2 |
| 15/02/2018 | 7.5 |
| 15/02/2018 | 7.5 |
| 15/02/2018 | 7 |
| 15/02/2018 | 7 |
| 15/02/2018 | 7.1 |
| 15/02/2018 | 6.7 |
| 15/02/2018 | 7.4 |
| 15/02/2018 | 8.7 |
| 15/02/2018 | 8 |
| 15/02/2018 | 6.7 |
| 15/02/2018 | 5.3 |
| 15/02/2018 | 4.7 |
| 16/02/2018 | 4.2 |
| 16/02/2018 | 3.8 |
| 16/02/2018 | 3.3 |
| 16/02/2018 | 3.6 |
| 16/02/2018 | 3.4 |
| 16/02/2018 | 3.6 |
| 16/02/2018 | 4 |
| 16/02/2018 | 5.2 |
| 16/02/2018 | 6.2 |
| 16/02/2018 | 6.5 |
| 16/02/2018 | 6.8 |
| 16/02/2018 | 7.1 |
| 16/02/2018 | 7.4 |
| 16/02/2018 | 7.1 |
| 16/02/2018 | 6.8 |
| 16/02/2018 | 6.7 |
| 16/02/2018 | 6.7 |
| 16/02/2018 | 6.3 |
| 16/02/2018 | 7.2 |
| 16/02/2018 | 8.1 |
| 16/02/2018 | 7.4 |
| 16/02/2018 | 6.3 |
| 16/02/2018 | 5.1 |
| 16/02/2018 | 4.9 |
| 17/02/2018 | 4.3 |
| 17/02/2018 | 3.9 |
| 17/02/2018 | 3.6 |
| 17/02/2018 | 3.4 |
| 17/02/2018 | 3 |
| 17/02/2018 | 3 |
| 17/02/2018 | 3.4 |
| 17/02/2018 | 3.8 |
| 17/02/2018 | 4.1 |
| 17/02/2018 | 5 |
| 17/02/2018 | 5.3 |
| 17/02/2018 | 5.8 |
| 17/02/2018 | 5.9 |
| 17/02/2018 | 5.7 |
| 17/02/2018 | 5.4 |
| 17/02/2018 | 5.4 |
| 17/02/2018 | 5 |
| 17/02/2018 | 5.1 |
| 17/02/2018 | 5.9 |
| 17/02/2018 | 7.2 |
| 17/02/2018 | 6.2 |
| 17/02/2018 | 5.2 |
| 17/02/2018 | 4.5 |
| 17/02/2018 | 4.4 |
| 18/02/2018 | 4.1 |
| 18/02/2018 | 3.7 |
| 18/02/2018 | 3.4 |
| 18/02/2018 | 3.3 |
| 18/02/2018 | 2.9 |
| 18/02/2018 | 2.8 |
| 18/02/2018 | 3 |
| 18/02/2018 | 3.2 |
| 18/02/2018 | 3.9 |
| 18/02/2018 | 4 |
| 18/02/2018 | 4.8 |
| 18/02/2018 | 5 |
| 18/02/2018 | 5 |
| 18/02/2018 | 4.9 |
| 18/02/2018 | 4.8 |
| 18/02/2018 | 4.8 |
| 18/02/2018 | 4.5 |
| 18/02/2018 | 4.8 |
| 18/02/2018 | 5.3 |
| 18/02/2018 | 6.3 |
| 18/02/2018 | 5.8 |
| 18/02/2018 | 5.1 |
| 18/02/2018 | 4.6 |
| 18/02/2018 | 4.4 |
| 19/02/2018 | 4.1 |
| 19/02/2018 | 3.6 |
| 19/02/2018 | 3.3 |
| 19/02/2018 | 3.3 |
| 19/02/2018 | 3.2 |
| 19/02/2018 | 3.4 |
| 19/02/2018 | 3.9 |
| 19/02/2018 | 4.8 |
| 19/02/2018 | 5.7 |
| 19/02/2018 | 6.5 |
| 19/02/2018 | 6.8 |
| 19/02/2018 | 7.1 |
| 19/02/2018 | 7 |
| 19/02/2018 | 7 |
| 19/02/2018 | 7 |
| 19/02/2018 | 6.7 |
| 19/02/2018 | 6.7 |
| 19/02/2018 | 6.3 |
| 19/02/2018 | 7.3 |
| 19/02/2018 | 8.5 |
| 19/02/2018 | 7.6 |
| 19/02/2018 | 6.5 |
| 19/02/2018 | 5.6 |
| 19/02/2018 | 4.9 |
| 20/02/2018 | 4.3 |
| 20/02/2018 | 3.9 |
| 20/02/2018 | 3.5 |
| 20/02/2018 | 3.4 |
| 20/02/2018 | 3.2 |
| 20/02/2018 | 3.5 |
| 20/02/2018 | 3.9 |
| 20/02/2018 | 5.1 |
| 20/02/2018 | 6.1 |
| 20/02/2018 | 6.4 |
| 20/02/2018 | 6.6 |
| 20/02/2018 | 7.4 |
| 20/02/2018 | 7.2 |
| 20/02/2018 | 7.2 |
| 20/02/2018 | 7.1 |
| 20/02/2018 | 6.8 |
| 20/02/2018 | 6.9 |
| 20/02/2018 | 6.5 |
| 20/02/2018 | 7.4 |
| 20/02/2018 | 8.2 |
| 20/02/2018 | 7.7 |
| 20/02/2018 | 6.6 |
| 20/02/2018 | 5.2 |
| 20/02/2018 | 5 |
| 21/02/2018 | 4.4 |
| 21/02/2018 | 4.1 |
| 21/02/2018 | 3.6 |
| 21/02/2018 | 3.4 |
| 21/02/2018 | 3.3 |
| 21/02/2018 | 3.5 |
| 21/02/2018 | 3.9 |
| 21/02/2018 | 5.2 |
| 21/02/2018 | 6.1 |
| 21/02/2018 | 6.5 |
| 21/02/2018 | 6.7 |
| 21/02/2018 | 7 |
| 21/02/2018 | 7.2 |
| 21/02/2018 | 7.2 |
| 21/02/2018 | 7.1 |
| 21/02/2018 | 7.2 |
| 21/02/2018 | 6.8 |
| 21/02/2018 | 6.4 |
| 21/02/2018 | 7.2 |
| 21/02/2018 | 8.3 |
| 21/02/2018 | 7.4 |
| 21/02/2018 | 6.5 |
| 21/02/2018 | 5.6 |
| 21/02/2018 | 5 |
| 22/02/2018 | 4.4 |
| 22/02/2018 | 4.1 |
| 22/02/2018 | 3.6 |
| 22/02/2018 | 3.4 |
| 22/02/2018 | 3.3 |
| 22/02/2018 | 3.5 |
| 22/02/2018 | 3.9 |
| 22/02/2018 | 5.1 |
| 22/02/2018 | 6 |
| 22/02/2018 | 6.4 |
| 22/02/2018 | 7 |
| 22/02/2018 | 7.3 |
| 22/02/2018 | 7.1 |
| 22/02/2018 | 7 |
| 22/02/2018 | 7 |
| 22/02/2018 | 7.1 |
| 22/02/2018 | 6.7 |
| 22/02/2018 | 6.7 |
| 22/02/2018 | 7.1 |
| 22/02/2018 | 8.3 |
| 22/02/2018 | 7.5 |
| 22/02/2018 | 6.5 |
| 22/02/2018 | 5.2 |
| 22/02/2018 | 5 |
| 23/02/2018 | 4.5 |
| 23/02/2018 | 3.6 |
| 23/02/2018 | 3.6 |
| 23/02/2018 | 3.4 |
| 23/02/2018 | 3.3 |
| 23/02/2018 | 3.5 |
| 23/02/2018 | 3.9 |
| 23/02/2018 | 5 |
| 23/02/2018 | 5.8 |
| 23/02/2018 | 6.2 |
| 23/02/2018 | 6.9 |
| 23/02/2018 | 7.2 |
| 23/02/2018 | 6.9 |
| 23/02/2018 | 7.2 |
| 23/02/2018 | 6.9 |
| 23/02/2018 | 6.8 |
| 23/02/2018 | 6.8 |
| 23/02/2018 | 6.3 |
| 23/02/2018 | 6.9 |
| 23/02/2018 | 7.6 |
| 23/02/2018 | 7.3 |
| 23/02/2018 | 6.1 |
| 23/02/2018 | 5 |
| 23/02/2018 | 4.7 |
| 24/02/2018 | 4 |
| 24/02/2018 | 3.7 |
| 24/02/2018 | 3.4 |
| 24/02/2018 | 3.2 |
| 24/02/2018 | 2.9 |
| 24/02/2018 | 3.3 |
| 24/02/2018 | 3.4 |
| 24/02/2018 | 3.6 |
| 24/02/2018 | 4.3 |
| 24/02/2018 | 4.7 |
| 24/02/2018 | 5 |
| 24/02/2018 | 5.5 |
| 24/02/2018 | 5.5 |
| 24/02/2018 | 5.9 |
| 24/02/2018 | 5.6 |
| 24/02/2018 | 5.5 |
| 24/02/2018 | 5.1 |
| 24/02/2018 | 5.2 |
| 24/02/2018 | 5.7 |
| 24/02/2018 | 6.3 |
| 24/02/2018 | 6.2 |
| 24/02/2018 | 5.6 |
| 24/02/2018 | 4.4 |
| 24/02/2018 | 4.2 |
| 25/02/2018 | 3.9 |
| 25/02/2018 | 3.5 |
| 25/02/2018 | 3.3 |
| 25/02/2018 | 3.1 |
| 25/02/2018 | 2.8 |
| 25/02/2018 | 2.7 |
| 25/02/2018 | 2.9 |
| 25/02/2018 | 3 |
| 25/02/2018 | 3.6 |
| 25/02/2018 | 3.8 |
| 25/02/2018 | 4.5 |
| 25/02/2018 | 4.7 |
| 25/02/2018 | 4.7 |
| 25/02/2018 | 5 |
| 25/02/2018 | 4.9 |
| 25/02/2018 | 4.9 |
| 25/02/2018 | 4.7 |
| 25/02/2018 | 4.4 |
| 25/02/2018 | 5.2 |
| 25/02/2018 | 5.9 |
| 25/02/2018 | 5.9 |
| 25/02/2018 | 4.9 |
| 25/02/2018 | 4.4 |
| 25/02/2018 | 4.2 |
| 26/02/2018 | 3.9 |
| 26/02/2018 | 3.4 |
| 26/02/2018 | 3.2 |
| 26/02/2018 | 3.2 |
| 26/02/2018 | 3.1 |
| 26/02/2018 | 3.3 |
| 26/02/2018 | 3.8 |
| 26/02/2018 | 4.5 |
| 26/02/2018 | 5.8 |
| 26/02/2018 | 6.2 |
| 26/02/2018 | 6.5 |
| 26/02/2018 | 6.7 |
| 26/02/2018 | 7 |
| 26/02/2018 | 7.1 |
| 26/02/2018 | 6.6 |
| 26/02/2018 | 6.7 |
| 26/02/2018 | 6.7 |
| 26/02/2018 | 6.3 |
| 26/02/2018 | 7 |
| 26/02/2018 | 7.5 |
| 26/02/2018 | 7.5 |
| 26/02/2018 | 6.3 |
| 26/02/2018 | 5.5 |
| 26/02/2018 | 4.7 |
| 27/02/2018 | 4.1 |
| 27/02/2018 | 3.7 |
| 27/02/2018 | 3.3 |
| 27/02/2018 | 3.2 |
| 27/02/2018 | 3.1 |
| 27/02/2018 | 3.3 |
| 27/02/2018 | 3.8 |
| 27/02/2018 | 4.9 |
| 27/02/2018 | 5.7 |
| 27/02/2018 | 6.1 |
| 27/02/2018 | 6.8 |
| 27/02/2018 | 7 |
| 27/02/2018 | 7.3 |
| 27/02/2018 | 7.2 |
| 27/02/2018 | 6.7 |
| 27/02/2018 | 6.8 |
| 27/02/2018 | 6.9 |
| 27/02/2018 | 6.5 |
| 27/02/2018 | 7.1 |
| 27/02/2018 | 7.7 |
| 27/02/2018 | 7.1 |
| 27/02/2018 | 6.4 |
| 27/02/2018 | 5.6 |
| 27/02/2018 | 4.8 |
| 28/02/2018 | 4.2 |
| 28/02/2018 | 3.9 |
| 28/02/2018 | 3.4 |
| 28/02/2018 | 3.3 |
| 28/02/2018 | 3.2 |
| 28/02/2018 | 3.4 |
| 28/02/2018 | 3.8 |
| 28/02/2018 | 4.9 |
| 28/02/2018 | 5.7 |
| 28/02/2018 | 6.1 |
| 28/02/2018 | 6.8 |
| 28/02/2018 | 7.1 |
| 28/02/2018 | 6.8 |
| 28/02/2018 | 7.2 |
| 28/02/2018 | 6.7 |
| 28/02/2018 | 6.8 |
| 28/02/2018 | 6.9 |
| 28/02/2018 | 6.4 |
| 28/02/2018 | 6.9 |
| 28/02/2018 | 7.8 |
| 28/02/2018 | 7.4 |
| 28/02/2018 | 6.3 |
| 28/02/2018 | 5.5 |
| 28/02/2018 | 4.8 |
| 01/03/2018 | 4.2 |
| 01/03/2018 | 3.9 |
| 01/03/2018 | 3.4 |
| 01/03/2018 | 3.3 |
| 01/03/2018 | 3.2 |
| 01/03/2018 | 3.4 |
| 01/03/2018 | 3.8 |
| 01/03/2018 | 4.9 |
| 01/03/2018 | 5.7 |
| 01/03/2018 | 6 |
| 01/03/2018 | 6.7 |
| 01/03/2018 | 6.9 |
| 01/03/2018 | 7.1 |
| 01/03/2018 | 7.1 |
| 01/03/2018 | 7.1 |
| 01/03/2018 | 6.7 |
| 01/03/2018 | 6.7 |
| 01/03/2018 | 6.8 |
| 01/03/2018 | 6.8 |
| 01/03/2018 | 7.3 |
| 01/03/2018 | 7.4 |
| 01/03/2018 | 6.3 |
| 01/03/2018 | 5.5 |
| 01/03/2018 | 4.8 |
| 02/03/2018 | 4.3 |
| 02/03/2018 | 3.9 |
| 02/03/2018 | 3.4 |
| 02/03/2018 | 3.3 |
| 02/03/2018 | 3.2 |
| 02/03/2018 | 3.4 |
| 02/03/2018 | 3.8 |
| 02/03/2018 | 4.7 |
| 02/03/2018 | 5.5 |
| 02/03/2018 | 6.4 |
| 02/03/2018 | 6.6 |
| 02/03/2018 | 6.8 |
| 02/03/2018 | 7 |
| 02/03/2018 | 6.8 |
| 02/03/2018 | 6.4 |
| 02/03/2018 | 6.4 |
| 02/03/2018 | 6.3 |
| 02/03/2018 | 6.4 |
| 02/03/2018 | 6.6 |
| 02/03/2018 | 7.2 |
| 02/03/2018 | 6.7 |
| 02/03/2018 | 5.9 |
| 02/03/2018 | 5.4 |
| 02/03/2018 | 4.5 |
| 03/03/2018 | 3.8 |
| 03/03/2018 | 3.5 |
| 03/03/2018 | 3.3 |
| 03/03/2018 | 3.1 |
| 03/03/2018 | 3.3 |
| 03/03/2018 | 3.2 |
| 03/03/2018 | 3.3 |
| 03/03/2018 | 3.4 |
| 03/03/2018 | 4.1 |
| 03/03/2018 | 4.5 |
| 03/03/2018 | 5.2 |
| 03/03/2018 | 5.6 |
| 03/03/2018 | 5.7 |
| 03/03/2018 | 5.5 |
| 03/03/2018 | 5.2 |
| 03/03/2018 | 5.1 |
| 03/03/2018 | 5.3 |
| 03/03/2018 | 4.8 |
| 03/03/2018 | 5.5 |
| 03/03/2018 | 5.9 |
| 03/03/2018 | 5.7 |
| 03/03/2018 | 5.4 |
| 03/03/2018 | 4.7 |
| 03/03/2018 | 4 |
| 04/03/2018 | 3.7 |
| 04/03/2018 | 3.3 |
| 04/03/2018 | 3.1 |
| 04/03/2018 | 3 |
| 04/03/2018 | 2.7 |
| 04/03/2018 | 2.6 |
| 04/03/2018 | 2.8 |
| 04/03/2018 | 3.4 |
| 04/03/2018 | 3.4 |
| 04/03/2018 | 4 |
| 04/03/2018 | 4.3 |
| 04/03/2018 | 4.4 |
| 04/03/2018 | 4.9 |
| 04/03/2018 | 4.7 |
| 04/03/2018 | 4.6 |
| 04/03/2018 | 4.6 |
| 04/03/2018 | 4.3 |
| 04/03/2018 | 4.6 |
| 04/03/2018 | 5 |
| 04/03/2018 | 5.1 |
| 04/03/2018 | 5.4 |
| 04/03/2018 | 5.3 |
| 04/03/2018 | 4.3 |
| 04/03/2018 | 4.1 |
| 05/03/2018 | 3.7 |
| 05/03/2018 | 3.3 |
| 05/03/2018 | 3 |
| 05/03/2018 | 3 |
| 05/03/2018 | 3 |
| 05/03/2018 | 3.2 |
| 05/03/2018 | 3.7 |
| 05/03/2018 | 4.8 |
| 05/03/2018 | 5.5 |
| 05/03/2018 | 5.9 |
| 05/03/2018 | 6.6 |
| 05/03/2018 | 6.8 |
| 05/03/2018 | 6.6 |
| 05/03/2018 | 6.6 |
| 05/03/2018 | 6.7 |
| 05/03/2018 | 6.3 |
| 05/03/2018 | 6.3 |
| 05/03/2018 | 6.3 |
| 05/03/2018 | 6.7 |
| 05/03/2018 | 7 |
| 05/03/2018 | 6.9 |
| 05/03/2018 | 6.6 |
| 05/03/2018 | 5.3 |
| 05/03/2018 | 4.5 |
| 06/03/2018 | 3.9 |
| 06/03/2018 | 3.5 |
| 06/03/2018 | 3.2 |
| 06/03/2018 | 3.1 |
| 06/03/2018 | 3 |
| 06/03/2018 | 3.2 |
| 06/03/2018 | 3.7 |
| 06/03/2018 | 4.7 |
| 06/03/2018 | 5.3 |
| 06/03/2018 | 6.3 |
| 06/03/2018 | 6.4 |
| 06/03/2018 | 6.6 |
| 06/03/2018 | 6.8 |
| 06/03/2018 | 6.8 |
| 06/03/2018 | 6.8 |
| 06/03/2018 | 6.9 |
| 06/03/2018 | 6.4 |
| 06/03/2018 | 6.5 |
| 06/03/2018 | 6.8 |
| 06/03/2018 | 7.2 |
| 06/03/2018 | 7.1 |
| 06/03/2018 | 6.2 |
| 06/03/2018 | 5.5 |
| 06/03/2018 | 4.6 |
| 07/03/2018 | 4 |
| 07/03/2018 | 3.7 |
| 07/03/2018 | 3.2 |
| 07/03/2018 | 3.1 |
| 07/03/2018 | 3 |
| 07/03/2018 | 3.3 |
| 07/03/2018 | 3.7 |
| 07/03/2018 | 4.7 |
| 07/03/2018 | 5.4 |
| 07/03/2018 | 6.3 |
| 07/03/2018 | 6.5 |
| 07/03/2018 | 6.7 |
| 07/03/2018 | 6.9 |
| 07/03/2018 | 6.8 |
| 07/03/2018 | 6.8 |
| 07/03/2018 | 6.8 |
| 07/03/2018 | 6.4 |
| 07/03/2018 | 6.5 |
| 07/03/2018 | 6.7 |
| 07/03/2018 | 6.8 |
| 07/03/2018 | 6.8 |
| 07/03/2018 | 6.6 |
| 07/03/2018 | 5.4 |
| 07/03/2018 | 4.6 |
| 08/03/2018 | 4 |
| 08/03/2018 | 3.7 |
| 08/03/2018 | 3.3 |
| 08/03/2018 | 3.1 |
| 08/03/2018 | 3 |
| 08/03/2018 | 3.3 |
| 08/03/2018 | 3.7 |
| 08/03/2018 | 4.6 |
| 08/03/2018 | 5.3 |
| 08/03/2018 | 6.2 |
| 08/03/2018 | 6.3 |
| 08/03/2018 | 6.5 |
| 08/03/2018 | 6.7 |
| 08/03/2018 | 6.7 |
| 08/03/2018 | 6.7 |
| 08/03/2018 | 6.7 |
| 08/03/2018 | 6.7 |
| 08/03/2018 | 6.8 |
| 08/03/2018 | 6.5 |
| 08/03/2018 | 6.8 |
| 08/03/2018 | 6.8 |
| 08/03/2018 | 6.6 |
| 08/03/2018 | 5.4 |
| 08/03/2018 | 4.6 |
| 09/03/2018 | 4.1 |
| 09/03/2018 | 3.7 |
| 09/03/2018 | 3.3 |
| 09/03/2018 | 3.1 |
| 09/03/2018 | 3 |
| 09/03/2018 | 3.3 |
| 09/03/2018 | 3.7 |
| 09/03/2018 | 4.5 |
| 09/03/2018 | 5.6 |
| 09/03/2018 | 6.1 |
| 09/03/2018 | 6.2 |
| 09/03/2018 | 6.4 |
| 09/03/2018 | 6.6 |
| 09/03/2018 | 6.9 |
| 09/03/2018 | 6.5 |
| 09/03/2018 | 6.4 |
| 09/03/2018 | 6.4 |
| 09/03/2018 | 6.4 |
| 09/03/2018 | 6.3 |
| 09/03/2018 | 6.2 |
| 09/03/2018 | 6.7 |
| 09/03/2018 | 6.2 |
| 09/03/2018 | 5.2 |
| 09/03/2018 | 4.3 |
| 10/03/2018 | 4.1 |
| 10/03/2018 | 3.3 |
| 10/03/2018 | 3.1 |
| 10/03/2018 | 3 |
| 10/03/2018 | 3.2 |
| 10/03/2018 | 3.1 |
| 10/03/2018 | 3.2 |
| 10/03/2018 | 3.3 |
| 10/03/2018 | 3.8 |
| 10/03/2018 | 4.2 |
| 10/03/2018 | 4.9 |
| 10/03/2018 | 5.3 |
| 10/03/2018 | 5.3 |
| 10/03/2018 | 5.1 |
| 10/03/2018 | 5.4 |
| 10/03/2018 | 5.2 |
| 10/03/2018 | 4.9 |
| 10/03/2018 | 5 |
| 10/03/2018 | 5.3 |
| 10/03/2018 | 5.1 |
| 10/03/2018 | 5.7 |
| 10/03/2018 | 5.2 |
| 10/03/2018 | 4.6 |
| 10/03/2018 | 4.3 |
| 11/03/2018 | 3.5 |
| 11/03/2018 | 3.6 |
| 11/03/2018 | 3 |
| 11/03/2018 | 2.9 |
| 11/03/2018 | 2.6 |
| 11/03/2018 | 3 |
| 11/03/2018 | 2.7 |
| 11/03/2018 | 3.2 |
| 11/03/2018 | 3.1 |
| 11/03/2018 | 3.8 |
| 11/03/2018 | 4 |
| 11/03/2018 | 4.6 |
| 11/03/2018 | 4.5 |
| 11/03/2018 | 4.8 |
| 11/03/2018 | 4.8 |
| 11/03/2018 | 4.2 |
| 11/03/2018 | 4.5 |
| 11/03/2018 | 4.7 |
| 11/03/2018 | 4.9 |
| 11/03/2018 | 4.8 |
| 11/03/2018 | 4.9 |
| 11/03/2018 | 5.1 |
| 11/03/2018 | 4.7 |
| 11/03/2018 | 4.4 |
| 12/03/2018 | 3.5 |
| 12/03/2018 | 3.6 |
| 12/03/2018 | 2.9 |
| 12/03/2018 | 2.9 |
| 12/03/2018 | 2.8 |
| 12/03/2018 | 3.1 |
| 12/03/2018 | 3.6 |
| 12/03/2018 | 4.6 |
| 12/03/2018 | 5.1 |
| 12/03/2018 | 6.1 |
| 12/03/2018 | 6.3 |
| 12/03/2018 | 6.4 |
| 12/03/2018 | 6.7 |
| 12/03/2018 | 6.7 |
| 12/03/2018 | 6.3 |
| 12/03/2018 | 6.4 |
| 12/03/2018 | 6.3 |
| 12/03/2018 | 6.4 |
| 12/03/2018 | 6.4 |
| 12/03/2018 | 6.6 |
| 12/03/2018 | 6.9 |
| 12/03/2018 | 6.4 |
| 12/03/2018 | 5.2 |
| 12/03/2018 | 4.8 |
| 13/03/2018 | 4.2 |
| 13/03/2018 | 3.3 |
| 13/03/2018 | 3 |
| 13/03/2018 | 2.9 |
| 13/03/2018 | 2.9 |
| 13/03/2018 | 3.1 |
| 13/03/2018 | 3.6 |
| 13/03/2018 | 4.4 |
| 13/03/2018 | 5.5 |
| 13/03/2018 | 6 |
| 13/03/2018 | 6.1 |
| 13/03/2018 | 6.7 |
| 13/03/2018 | 6.9 |
| 13/03/2018 | 6.9 |
| 13/03/2018 | 6.4 |
| 13/03/2018 | 6.4 |
| 13/03/2018 | 6.5 |
| 13/03/2018 | 6.6 |
| 13/03/2018 | 6.5 |
| 13/03/2018 | 6.2 |
| 13/03/2018 | 6.5 |
| 13/03/2018 | 6.6 |
| 13/03/2018 | 5.3 |
| 13/03/2018 | 4.4 |
| 14/03/2018 | 3.7 |
| 14/03/2018 | 3.4 |
| 14/03/2018 | 3.1 |
| 14/03/2018 | 3 |
| 14/03/2018 | 2.9 |
| 14/03/2018 | 3.2 |
| 14/03/2018 | 3.6 |
| 14/03/2018 | 4.5 |
| 14/03/2018 | 5.5 |
| 14/03/2018 | 6 |
| 14/03/2018 | 6.1 |
| 14/03/2018 | 6.7 |
| 14/03/2018 | 6.5 |
| 14/03/2018 | 6.9 |
| 14/03/2018 | 6.9 |
| 14/03/2018 | 6.4 |
| 14/03/2018 | 6.5 |
| 14/03/2018 | 6.5 |
| 14/03/2018 | 6.4 |
| 14/03/2018 | 6.4 |
| 14/03/2018 | 6.8 |
| 14/03/2018 | 6.4 |
| 14/03/2018 | 5.2 |
| 14/03/2018 | 4.4 |
| 15/03/2018 | 3.8 |
| 15/03/2018 | 3.5 |
| 15/03/2018 | 3.1 |
| 15/03/2018 | 3 |
| 15/03/2018 | 2.9 |
| 15/03/2018 | 3.2 |
| 15/03/2018 | 3.6 |
| 15/03/2018 | 4.4 |
| 15/03/2018 | 5.5 |
| 15/03/2018 | 5.9 |
| 15/03/2018 | 6.5 |
| 15/03/2018 | 6.6 |
| 15/03/2018 | 6.8 |
| 15/03/2018 | 6.8 |
| 15/03/2018 | 6.8 |
| 15/03/2018 | 6.3 |
| 15/03/2018 | 6.3 |
| 15/03/2018 | 6.4 |
| 15/03/2018 | 6.3 |
| 15/03/2018 | 6.3 |
| 15/03/2018 | 6.8 |
| 15/03/2018 | 6.5 |
| 15/03/2018 | 5.3 |
| 15/03/2018 | 4.4 |
| 16/03/2018 | 3.8 |
| 16/03/2018 | 3.5 |
| 16/03/2018 | 3.1 |
| 16/03/2018 | 3 |
| 16/03/2018 | 2.9 |
| 16/03/2018 | 3.2 |
| 16/03/2018 | 3.6 |
| 16/03/2018 | 4.3 |
| 16/03/2018 | 5.2 |
| 16/03/2018 | 5.8 |
| 16/03/2018 | 6.4 |
| 16/03/2018 | 6.5 |
| 16/03/2018 | 6.7 |
| 16/03/2018 | 6.4 |
| 16/03/2018 | 6.6 |
| 16/03/2018 | 6.5 |
| 16/03/2018 | 5.9 |
| 16/03/2018 | 6.5 |
| 16/03/2018 | 6.1 |
| 16/03/2018 | 5.8 |
| 16/03/2018 | 6.2 |
| 16/03/2018 | 6.1 |
| 16/03/2018 | 5.1 |
| 16/03/2018 | 4.6 |
| 17/03/2018 | 3.9 |
| 17/03/2018 | 3.6 |
| 17/03/2018 | 2.9 |
| 17/03/2018 | 2.8 |
| 17/03/2018 | 3 |
| 17/03/2018 | 3 |
| 17/03/2018 | 3.1 |
| 17/03/2018 | 3.6 |
| 17/03/2018 | 3.5 |
| 17/03/2018 | 4.5 |
| 17/03/2018 | 4.6 |
| 17/03/2018 | 4.9 |
| 17/03/2018 | 5.5 |
| 17/03/2018 | 5.3 |
| 17/03/2018 | 5 |
| 17/03/2018 | 4.9 |
| 17/03/2018 | 5 |
| 17/03/2018 | 5.1 |
| 17/03/2018 | 4.7 |
| 17/03/2018 | 4.8 |
| 17/03/2018 | 5.2 |
| 17/03/2018 | 5.1 |
| 17/03/2018 | 4.5 |
| 17/03/2018 | 4.1 |
| 18/03/2018 | 3.8 |
| 18/03/2018 | 3.4 |
| 18/03/2018 | 2.8 |
| 18/03/2018 | 2.7 |
| 18/03/2018 | 2.9 |
| 18/03/2018 | 2.9 |
| 18/03/2018 | 2.7 |
| 18/03/2018 | 3.1 |
| 18/03/2018 | 3.4 |
| 18/03/2018 | 3.6 |
| 18/03/2018 | 4.3 |
| 18/03/2018 | 4.3 |
| 18/03/2018 | 4.2 |
| 18/03/2018 | 4.5 |
| 18/03/2018 | 4.5 |
| 18/03/2018 | 4.4 |
| 18/03/2018 | 4.1 |
| 18/03/2018 | 4.4 |
| 18/03/2018 | 4.3 |
| 18/03/2018 | 4.1 |
| 18/03/2018 | 5 |
| 18/03/2018 | 5 |
| 18/03/2018 | 4.6 |
| 18/03/2018 | 4.2 |
| 19/03/2018 | 3.8 |
| 19/03/2018 | 3.4 |
| 19/03/2018 | 2.7 |
| 19/03/2018 | 2.8 |
| 19/03/2018 | 2.7 |
| 19/03/2018 | 3 |
| 19/03/2018 | 3.5 |
| 19/03/2018 | 4.3 |
| 19/03/2018 | 5.3 |
| 19/03/2018 | 5.8 |
| 19/03/2018 | 5.9 |
| 19/03/2018 | 6 |
| 19/03/2018 | 6.3 |
| 19/03/2018 | 6.3 |
| 19/03/2018 | 6.4 |
| 19/03/2018 | 6.4 |
| 19/03/2018 | 6.4 |
| 19/03/2018 | 6.4 |
| 19/03/2018 | 6.1 |
| 19/03/2018 | 5.6 |
| 19/03/2018 | 6.3 |
| 19/03/2018 | 6.2 |
| 19/03/2018 | 5.6 |
| 19/03/2018 | 4.6 |
| 20/03/2018 | 4 |
| 20/03/2018 | 3.1 |
| 20/03/2018 | 2.8 |
| 20/03/2018 | 2.8 |
| 20/03/2018 | 2.7 |
| 20/03/2018 | 3 |
| 20/03/2018 | 3.5 |
| 20/03/2018 | 4.2 |
| 20/03/2018 | 5.1 |
| 20/03/2018 | 5.7 |
| 20/03/2018 | 6.2 |
| 20/03/2018 | 6.3 |
| 20/03/2018 | 6.5 |
| 20/03/2018 | 6.5 |
| 20/03/2018 | 6.5 |
| 20/03/2018 | 6.5 |
| 20/03/2018 | 6 |
| 20/03/2018 | 6.6 |
| 20/03/2018 | 6.3 |
| 20/03/2018 | 5.8 |
| 20/03/2018 | 6.5 |
| 20/03/2018 | 6.4 |
| 20/03/2018 | 5.2 |
| 20/03/2018 | 4.7 |
| 21/03/2018 | 4 |
| 21/03/2018 | 3.2 |
| 21/03/2018 | 2.9 |
| 21/03/2018 | 2.8 |
| 21/03/2018 | 2.8 |
| 21/03/2018 | 3 |
| 21/03/2018 | 3.5 |
| 21/03/2018 | 4.2 |
| 21/03/2018 | 5.2 |
| 21/03/2018 | 5.7 |
| 21/03/2018 | 6.3 |
| 21/03/2018 | 6.3 |
| 21/03/2018 | 6.6 |
| 21/03/2018 | 6.5 |
| 21/03/2018 | 6.4 |
| 21/03/2018 | 6.5 |
| 21/03/2018 | 6.5 |
| 21/03/2018 | 6.6 |
| 21/03/2018 | 6.1 |
| 21/03/2018 | 5.4 |
| 21/03/2018 | 6.2 |
| 21/03/2018 | 6.2 |
| 21/03/2018 | 5.6 |
| 21/03/2018 | 4.7 |
| 22/03/2018 | 4.1 |
| 22/03/2018 | 3.3 |
| 22/03/2018 | 2.9 |
| 22/03/2018 | 2.8 |
| 22/03/2018 | 2.8 |
| 22/03/2018 | 3 |
| 22/03/2018 | 3.5 |
| 22/03/2018 | 4.2 |
| 22/03/2018 | 5.1 |
| 22/03/2018 | 5.6 |
| 22/03/2018 | 6.1 |
| 22/03/2018 | 6.2 |
| 22/03/2018 | 6.4 |
| 22/03/2018 | 6.4 |
| 22/03/2018 | 6.4 |
| 22/03/2018 | 6.3 |
| 22/03/2018 | 6.3 |
| 22/03/2018 | 6.4 |
| 22/03/2018 | 6 |
| 22/03/2018 | 5.4 |
| 22/03/2018 | 6.2 |
| 22/03/2018 | 6.3 |
| 22/03/2018 | 5.6 |
| 22/03/2018 | 4.7 |
| 23/03/2018 | 4.1 |
| 23/03/2018 | 3.3 |
| 23/03/2018 | 3 |
| 23/03/2018 | 2.9 |
| 23/03/2018 | 2.8 |
| 23/03/2018 | 3 |
| 23/03/2018 | 3.5 |
| 23/03/2018 | 4.5 |
| 23/03/2018 | 4.9 |
| 23/03/2018 | 5.9 |
| 23/03/2018 | 6 |
| 23/03/2018 | 6.1 |
| 23/03/2018 | 6.3 |
| 23/03/2018 | 6.5 |
| 23/03/2018 | 6.2 |
| 23/03/2018 | 6.1 |
| 23/03/2018 | 6 |
| 23/03/2018 | 6.5 |
| 23/03/2018 | 5.8 |
| 23/03/2018 | 5.4 |
| 23/03/2018 | 5.6 |
| 23/03/2018 | 5.9 |
| 23/03/2018 | 5 |
| 23/03/2018 | 4.4 |
| 24/03/2018 | 3.7 |
| 24/03/2018 | 3.4 |
| 24/03/2018 | 3.3 |
| 24/03/2018 | 2.7 |
| 24/03/2018 | 2.9 |
| 24/03/2018 | 2.9 |
| 24/03/2018 | 3 |
| 24/03/2018 | 3.4 |
| 24/03/2018 | 3.8 |
| 24/03/2018 | 4.2 |
| 24/03/2018 | 4.8 |
| 24/03/2018 | 5.1 |
| 24/03/2018 | 5.1 |
| 24/03/2018 | 4.9 |
| 24/03/2018 | 5.1 |
| 24/03/2018 | 5 |
| 24/03/2018 | 4.6 |
| 24/03/2018 | 5.2 |
| 24/03/2018 | 4.6 |
| 24/03/2018 | 4 |
| 24/03/2018 | 4.7 |
| 24/03/2018 | 5.4 |
| 24/03/2018 | 4.4 |
| 24/03/2018 | 4 |
| 25/03/2018 | 3.6 |
| 25/03/2018 | 3.9 |
| 25/03/2018 | 3.2 |
| 25/03/2018 | 0 |
| 25/03/2018 | 2.8 |
| 25/03/2018 | 2.7 |
| 25/03/2018 | 2.9 |
| 25/03/2018 | 3.2 |
| 25/03/2018 | 3.8 |
| 25/03/2018 | 3.9 |
| 25/03/2018 | 4.2 |
| 25/03/2018 | 4.9 |
| 25/03/2018 | 4.8 |
| 25/03/2018 | 5.2 |
| 25/03/2018 | 5.2 |
| 25/03/2018 | 5 |
| 25/03/2018 | 4.6 |
| 25/03/2018 | 4.3 |
| 25/03/2018 | 4.8 |
| 25/03/2018 | 5.4 |
| 25/03/2018 | 5.4 |
| 25/03/2018 | 5.4 |
| 25/03/2018 | 4.8 |
| 25/03/2018 | 4.1 |
| 26/03/2018 | 4 |
| 26/03/2018 | 3.3 |
| 26/03/2018 | 3 |
| 26/03/2018 | 3 |
| 26/03/2018 | 2.9 |
| 26/03/2018 | 3.1 |
| 26/03/2018 | 3.3 |
| 26/03/2018 | 4.5 |
| 26/03/2018 | 5.4 |
| 26/03/2018 | 6 |
| 26/03/2018 | 6.5 |
| 26/03/2018 | 6.4 |
| 26/03/2018 | 6.7 |
| 26/03/2018 | 6.8 |
| 26/03/2018 | 6.3 |
| 26/03/2018 | 6 |
| 26/03/2018 | 5.9 |
| 26/03/2018 | 5.6 |
| 26/03/2018 | 5.8 |
| 26/03/2018 | 7 |
| 26/03/2018 | 7.2 |
| 26/03/2018 | 6.5 |
| 26/03/2018 | 5.1 |
| 26/03/2018 | 4.7 |
| 27/03/2018 | 4.1 |
| 27/03/2018 | 3.6 |
| 27/03/2018 | 3.1 |
| 27/03/2018 | 3 |
| 27/03/2018 | 2.9 |
| 27/03/2018 | 3.1 |
| 27/03/2018 | 3.8 |
| 27/03/2018 | 4.3 |
| 27/03/2018 | 5.3 |
| 27/03/2018 | 5.9 |
| 27/03/2018 | 6.3 |
| 27/03/2018 | 6.7 |
| 27/03/2018 | 6.9 |
| 27/03/2018 | 7 |
| 27/03/2018 | 6.4 |
| 27/03/2018 | 6.6 |
| 27/03/2018 | 6 |
| 27/03/2018 | 5.7 |
| 27/03/2018 | 5.9 |
| 27/03/2018 | 7.1 |
| 27/03/2018 | 6.8 |
| 27/03/2018 | 6.1 |
| 27/03/2018 | 5.2 |
| 27/03/2018 | 4.7 |
| 28/03/2018 | 4.1 |
| 28/03/2018 | 3.7 |
| 28/03/2018 | 3.2 |
| 28/03/2018 | 3.1 |
| 28/03/2018 | 3 |
| 28/03/2018 | 3.1 |
| 28/03/2018 | 3.8 |
| 28/03/2018 | 4.3 |
| 28/03/2018 | 5.3 |
| 28/03/2018 | 5.9 |
| 28/03/2018 | 6.4 |
| 28/03/2018 | 6.8 |
| 28/03/2018 | 7 |
| 28/03/2018 | 7 |
| 28/03/2018 | 6.8 |
| 28/03/2018 | 6.6 |
| 28/03/2018 | 6 |
| 28/03/2018 | 5.7 |
| 28/03/2018 | 5.8 |
| 28/03/2018 | 6.8 |
| 28/03/2018 | 7.1 |
| 28/03/2018 | 6.5 |
| 28/03/2018 | 5.1 |
| 28/03/2018 | 4.8 |
| 29/03/2018 | 4.1 |
| 29/03/2018 | 3.7 |
| 29/03/2018 | 3.2 |
| 29/03/2018 | 3.1 |
| 29/03/2018 | 3 |
| 29/03/2018 | 3.1 |
| 29/03/2018 | 3.3 |
| 29/03/2018 | 4.3 |
| 29/03/2018 | 5.3 |
| 29/03/2018 | 5.8 |
| 29/03/2018 | 6.2 |
| 29/03/2018 | 6.6 |
| 29/03/2018 | 6.8 |
| 29/03/2018 | 6.9 |
| 29/03/2018 | 6.8 |
| 29/03/2018 | 6.5 |
| 29/03/2018 | 6.3 |
| 29/03/2018 | 6 |
| 29/03/2018 | 5.7 |
| 29/03/2018 | 6.8 |
| 29/03/2018 | 7.1 |
| 29/03/2018 | 6.5 |
| 29/03/2018 | 5.1 |
| 29/03/2018 | 4.8 |
| 30/03/2018 | 4.2 |
| 30/03/2018 | 3.5 |
| 30/03/2018 | 2.8 |
| 30/03/2018 | 2.7 |
| 30/03/2018 | 2.9 |
| 30/03/2018 | 2.8 |
| 30/03/2018 | 2.8 |
| 30/03/2018 | 2.9 |
| 30/03/2018 | 3 |
| 30/03/2018 | 4 |
| 30/03/2018 | 4.4 |
| 30/03/2018 | 4.6 |
| 30/03/2018 | 4.7 |
| 30/03/2018 | 4.8 |
| 30/03/2018 | 4.5 |
| 30/03/2018 | 4.1 |
| 30/03/2018 | 4.1 |
| 30/03/2018 | 4.2 |
| 30/03/2018 | 3.7 |
| 30/03/2018 | 4.7 |
| 30/03/2018 | 5.3 |
| 30/03/2018 | 4.8 |
| 30/03/2018 | 4.5 |
| 30/03/2018 | 4.1 |
| 31/03/2018 | 4 |
| 31/03/2018 | 3.4 |
| 31/03/2018 | 3.1 |
| 31/03/2018 | 2.9 |
| 31/03/2018 | 3.1 |
| 31/03/2018 | 3.1 |
| 31/03/2018 | 2.9 |
| 31/03/2018 | 3.4 |
| 31/03/2018 | 3.8 |
| 31/03/2018 | 4.2 |
| 31/03/2018 | 5.1 |
| 31/03/2018 | 5.1 |
| 31/03/2018 | 5.1 |
| 31/03/2018 | 5.5 |
| 31/03/2018 | 5.1 |
| 31/03/2018 | 4.8 |
| 31/03/2018 | 4.8 |
| 31/03/2018 | 4.7 |
| 31/03/2018 | 4.2 |
| 31/03/2018 | 5.3 |
| 31/03/2018 | 5.5 |
| 31/03/2018 | 5.3 |
| 31/03/2018 | 4.5 |
| 31/03/2018 | 4.1 |
| 01/04/2018 | 3.7 |
| 01/04/2018 | 2.6 |
| 01/04/2018 | 2.7 |
| 01/04/2018 | 2.7 |
| 01/04/2018 | 2.5 |
| 01/04/2018 | 2.5 |
| 01/04/2018 | 2.7 |
| 01/04/2018 | 2.9 |
| 01/04/2018 | 2.3 |
| 01/04/2018 | 2.7 |
| 01/04/2018 | 3.3 |
| 01/04/2018 | 3.3 |
| 01/04/2018 | 3.3 |
| 01/04/2018 | 3.4 |
| 01/04/2018 | 3.2 |
| 01/04/2018 | 3 |
| 01/04/2018 | 3.4 |
| 01/04/2018 | 3.6 |
| 01/04/2018 | 3.7 |
| 01/04/2018 | 4.4 |
| 01/04/2018 | 4.5 |
| 01/04/2018 | 4.3 |
| 01/04/2018 | 3.9 |
| 01/04/2018 | 3.2 |
| 02/04/2018 | 2.9 |
| 02/04/2018 | 2.5 |
| 02/04/2018 | 2.7 |
| 02/04/2018 | 2.7 |
| 02/04/2018 | 2.5 |
| 02/04/2018 | 2.5 |
| 02/04/2018 | 2.7 |
| 02/04/2018 | 2.9 |
| 02/04/2018 | 2.3 |
| 02/04/2018 | 2.7 |
| 02/04/2018 | 3.3 |
| 02/04/2018 | 3.3 |
| 02/04/2018 | 3.3 |
| 02/04/2018 | 3.3 |
| 02/04/2018 | 3.1 |
| 02/04/2018 | 3 |
| 02/04/2018 | 3.3 |
| 02/04/2018 | 3.6 |
| 02/04/2018 | 3.6 |
| 02/04/2018 | 4.3 |
| 02/04/2018 | 4.5 |
| 02/04/2018 | 4.3 |
| 02/04/2018 | 3.9 |
| 02/04/2018 | 3.1 |
| 03/04/2018 | 2.9 |
| 03/04/2018 | 3.4 |
| 03/04/2018 | 3 |
| 03/04/2018 | 2.9 |
| 03/04/2018 | 2.8 |
| 03/04/2018 | 3 |
| 03/04/2018 | 3.6 |
| 03/04/2018 | 4.1 |
| 03/04/2018 | 4.9 |
| 03/04/2018 | 6.1 |
| 03/04/2018 | 6 |
| 03/04/2018 | 6.3 |
| 03/04/2018 | 6.5 |
| 03/04/2018 | 6.6 |
| 03/04/2018 | 6.5 |
| 03/04/2018 | 6.2 |
| 03/04/2018 | 6.1 |
| 03/04/2018 | 5.8 |
| 03/04/2018 | 5.8 |
| 03/04/2018 | 6.3 |
| 03/04/2018 | 6.8 |
| 03/04/2018 | 6.4 |
| 03/04/2018 | 5 |
| 03/04/2018 | 4.6 |
| 04/04/2018 | 3.9 |
| 04/04/2018 | 3.5 |
| 04/04/2018 | 3.1 |
| 04/04/2018 | 3 |
| 04/04/2018 | 2.8 |
| 04/04/2018 | 3 |
| 04/04/2018 | 3.7 |
| 04/04/2018 | 4.1 |
| 04/04/2018 | 5 |
| 04/04/2018 | 6.1 |
| 04/04/2018 | 6.1 |
| 04/04/2018 | 6.4 |
| 04/04/2018 | 6.6 |
| 04/04/2018 | 6.6 |
| 04/04/2018 | 6.5 |
| 04/04/2018 | 6.2 |
| 04/04/2018 | 6.1 |
| 04/04/2018 | 5.8 |
| 04/04/2018 | 5.8 |
| 04/04/2018 | 6.1 |
| 04/04/2018 | 6.6 |
| 04/04/2018 | 6.2 |
| 04/04/2018 | 5.4 |
| 04/04/2018 | 4.6 |
| 05/04/2018 | 3.9 |
| 05/04/2018 | 3.5 |
| 05/04/2018 | 3.1 |
| 05/04/2018 | 3 |
| 05/04/2018 | 2.9 |
| 05/04/2018 | 3 |
| 05/04/2018 | 3.7 |
| 05/04/2018 | 4.1 |
| 05/04/2018 | 5 |
| 05/04/2018 | 6 |
| 05/04/2018 | 6.4 |
| 05/04/2018 | 6.3 |
| 05/04/2018 | 6.5 |
| 05/04/2018 | 6.6 |
| 05/04/2018 | 6.4 |
| 05/04/2018 | 6.2 |
| 05/04/2018 | 6 |
| 05/04/2018 | 5.8 |
| 05/04/2018 | 5.8 |
| 05/04/2018 | 6.2 |
| 05/04/2018 | 6.6 |
| 05/04/2018 | 6.2 |
| 05/04/2018 | 5 |
| 05/04/2018 | 4.6 |
| 06/04/2018 | 4 |
| 06/04/2018 | 3.6 |
| 06/04/2018 | 3.1 |
| 06/04/2018 | 3 |
| 06/04/2018 | 2.9 |
| 06/04/2018 | 3 |
| 06/04/2018 | 3.6 |
| 06/04/2018 | 4 |
| 06/04/2018 | 5.3 |
| 06/04/2018 | 5.9 |
| 06/04/2018 | 6.4 |
| 06/04/2018 | 6.2 |
| 06/04/2018 | 6.4 |
| 06/04/2018 | 6.3 |
| 06/04/2018 | 6.3 |
| 06/04/2018 | 6 |
| 06/04/2018 | 5.7 |
| 06/04/2018 | 5.5 |
| 06/04/2018 | 5.3 |
| 06/04/2018 | 5.9 |
| 06/04/2018 | 6.2 |
| 06/04/2018 | 5.8 |
| 06/04/2018 | 4.8 |
| 06/04/2018 | 4.3 |
| 07/04/2018 | 4.1 |
| 07/04/2018 | 3.8 |
| 07/04/2018 | 3.1 |
| 07/04/2018 | 2.9 |
| 07/04/2018 | 3.2 |
| 07/04/2018 | 3.1 |
| 07/04/2018 | 3.1 |
| 07/04/2018 | 3.4 |
| 07/04/2018 | 3.9 |
| 07/04/2018 | 4.3 |
| 07/04/2018 | 5.1 |
| 07/04/2018 | 5.5 |
| 07/04/2018 | 5.5 |
| 07/04/2018 | 5.4 |
| 07/04/2018 | 5.1 |
| 07/04/2018 | 5.4 |
| 07/04/2018 | 4.9 |
| 07/04/2018 | 4.9 |
| 07/04/2018 | 4.7 |
| 07/04/2018 | 4.9 |
| 07/04/2018 | 5.2 |
| 07/04/2018 | 5.4 |
| 07/04/2018 | 4.9 |
| 07/04/2018 | 4.2 |
| 08/04/2018 | 3.7 |
| 08/04/2018 | 3.6 |
| 08/04/2018 | 2.9 |
| 08/04/2018 | 2.9 |
| 08/04/2018 | 2.6 |
| 08/04/2018 | 3 |
| 08/04/2018 | 2.7 |
| 08/04/2018 | 2.9 |
| 08/04/2018 | 3.4 |
| 08/04/2018 | 3.6 |
| 08/04/2018 | 4.3 |
| 08/04/2018 | 4.5 |
| 08/04/2018 | 4.8 |
| 08/04/2018 | 4.7 |
| 08/04/2018 | 4.7 |
| 08/04/2018 | 4.5 |
| 08/04/2018 | 4.6 |
| 08/04/2018 | 4.4 |
| 08/04/2018 | 4.6 |
| 08/04/2018 | 4.4 |
| 08/04/2018 | 4.6 |
| 08/04/2018 | 5.3 |
| 08/04/2018 | 4.9 |
| 08/04/2018 | 4.3 |
| 09/04/2018 | 3.6 |
| 09/04/2018 | 3.6 |
| 09/04/2018 | 2.9 |
| 09/04/2018 | 2.9 |
| 09/04/2018 | 2.8 |
| 09/04/2018 | 3.1 |
| 09/04/2018 | 3.4 |
| 09/04/2018 | 4.5 |
| 09/04/2018 | 5.5 |
| 09/04/2018 | 6 |
| 09/04/2018 | 6.3 |
| 09/04/2018 | 6.6 |
| 09/04/2018 | 6.8 |
| 09/04/2018 | 6.9 |
| 09/04/2018 | 6.5 |
| 09/04/2018 | 6.4 |
| 09/04/2018 | 6.3 |
| 09/04/2018 | 6.2 |
| 09/04/2018 | 5.9 |
| 09/04/2018 | 6 |
| 09/04/2018 | 6.5 |
| 09/04/2018 | 6.4 |
| 09/04/2018 | 5.4 |
| 09/04/2018 | 4.7 |
| 10/04/2018 | 4.3 |
| 10/04/2018 | 3.8 |
| 10/04/2018 | 3 |
| 10/04/2018 | 2.9 |
| 10/04/2018 | 2.8 |
| 10/04/2018 | 3.1 |
| 10/04/2018 | 3.9 |
| 10/04/2018 | 4.3 |
| 10/04/2018 | 5.3 |
| 10/04/2018 | 5.9 |
| 10/04/2018 | 6.6 |
| 10/04/2018 | 6.8 |
| 10/04/2018 | 7 |
| 10/04/2018 | 7.1 |
| 10/04/2018 | 6.6 |
| 10/04/2018 | 6.5 |
| 10/04/2018 | 6.5 |
| 10/04/2018 | 6.4 |
| 10/04/2018 | 6.2 |
| 10/04/2018 | 6.2 |
| 10/04/2018 | 6.1 |
| 10/04/2018 | 6.5 |
| 10/04/2018 | 5.5 |
| 10/04/2018 | 4.8 |
| 10/04/2018 | 4.4 |
| 11/04/2018 | 3.4 |
| 11/04/2018 | 3.1 |
| 11/04/2018 | 3 |
| 11/04/2018 | 2.9 |
| 11/04/2018 | 3.1 |
| 11/04/2018 | 3.9 |
| 11/04/2018 | 4.3 |
| 11/04/2018 | 5.4 |
| 11/04/2018 | 5.9 |
| 11/04/2018 | 6.2 |
| 11/04/2018 | 6.9 |
| 11/04/2018 | 6.6 |
| 11/04/2018 | 6.7 |
| 11/04/2018 | 6.6 |
| 11/04/2018 | 6.5 |
| 11/04/2018 | 6.5 |
| 11/04/2018 | 6.4 |
| 11/04/2018 | 6.1 |
| 11/04/2018 | 6 |
| 11/04/2018 | 6.4 |
| 11/04/2018 | 6.3 |
| 11/04/2018 | 5.4 |
| 11/04/2018 | 4.8 |
| 11/04/2018 | 3.9 |
| 12/04/2018 | 3.5 |
| 12/04/2018 | 3.1 |
| 12/04/2018 | 3 |
| 12/04/2018 | 2.9 |
| 12/04/2018 | 3.1 |
| 12/04/2018 | 3.9 |
| 12/04/2018 | 4.3 |
| 12/04/2018 | 5.4 |
| 12/04/2018 | 5.8 |
| 12/04/2018 | 6.6 |
| 12/04/2018 | 6.8 |
| 12/04/2018 | 7 |
| 12/04/2018 | 7.1 |
| 12/04/2018 | 6.6 |
| 12/04/2018 | 6.4 |
| 12/04/2018 | 6.4 |
| 12/04/2018 | 6.3 |
| 12/04/2018 | 6.1 |
| 12/04/2018 | 6 |
| 12/04/2018 | 6.4 |
| 12/04/2018 | 6.3 |
| 12/04/2018 | 5.4 |
| 12/04/2018 | 4.8 |
| 12/04/2018 | 4 |
| 13/04/2018 | 3.5 |
| 13/04/2018 | 3.1 |
| 13/04/2018 | 3 |
| 13/04/2018 | 2.9 |
| 13/04/2018 | 3.1 |
| 13/04/2018 | 3.8 |
| 13/04/2018 | 4.7 |
| 13/04/2018 | 5.2 |
| 13/04/2018 | 5.7 |
| 13/04/2018 | 6.5 |
| 13/04/2018 | 6.7 |
| 13/04/2018 | 6.9 |
| 13/04/2018 | 6.8 |
| 13/04/2018 | 6.5 |
| 13/04/2018 | 6.2 |
| 13/04/2018 | 6.1 |
| 13/04/2018 | 6 |
| 13/04/2018 | 6.1 |
| 13/04/2018 | 5.7 |
| 13/04/2018 | 6 |
| 13/04/2018 | 5.8 |
| 13/04/2018 | 5.3 |
| 13/04/2018 | 4.5 |
| 13/04/2018 | 4.1 |
| 14/04/2018 | 3.7 |
| 14/04/2018 | 2.9 |
| 14/04/2018 | 2.8 |
| 14/04/2018 | 3.1 |
| 14/04/2018 | 3 |
| 14/04/2018 | 2.9 |
| 14/04/2018 | 3.2 |
| 14/04/2018 | 3.8 |
| 14/04/2018 | 4.2 |
| 14/04/2018 | 4.9 |
| 14/04/2018 | 5.3 |
| 14/04/2018 | 5.3 |
| 14/04/2018 | 5.2 |
| 14/04/2018 | 5 |
| 14/04/2018 | 5.2 |
| 14/04/2018 | 4.8 |
| 14/04/2018 | 4.9 |
| 14/04/2018 | 4.7 |
| 14/04/2018 | 4.7 |
| 14/04/2018 | 4.9 |
| 14/04/2018 | 4.9 |
| 14/04/2018 | 4.7 |
| 14/04/2018 | 4.1 |
| 14/04/2018 | 4 |
| 15/04/2018 | 3.4 |
| 15/04/2018 | 2.8 |
| 15/04/2018 | 2.7 |
| 15/04/2018 | 3 |
| 15/04/2018 | 2.9 |
| 15/04/2018 | 3 |
| 15/04/2018 | 2.8 |
| 15/04/2018 | 3.2 |
| 15/04/2018 | 3.9 |
| 15/04/2018 | 4.2 |
| 15/04/2018 | 4.3 |
| 15/04/2018 | 4.6 |
| 15/04/2018 | 4.6 |
| 15/04/2018 | 4.5 |
| 15/04/2018 | 4.3 |
| 15/04/2018 | 4.5 |
| 15/04/2018 | 4.3 |
| 15/04/2018 | 4.6 |
| 15/04/2018 | 4.3 |
| 15/04/2018 | 4.8 |
| 15/04/2018 | 4.8 |
| 15/04/2018 | 4.7 |
| 15/04/2018 | 4.2 |
| 15/04/2018 | 3.5 |
| 16/04/2018 | 3.4 |
| 16/04/2018 | 2.8 |
| 16/04/2018 | 2.8 |
| 16/04/2018 | 2.7 |
| 16/04/2018 | 3 |
| 16/04/2018 | 3.7 |
| 16/04/2018 | 4.2 |
| 16/04/2018 | 5.3 |
| 16/04/2018 | 5.8 |
| 16/04/2018 | 6.1 |
| 16/04/2018 | 6.4 |
| 16/04/2018 | 6.6 |
| 16/04/2018 | 6.7 |
| 16/04/2018 | 6.3 |
| 16/04/2018 | 6.2 |
| 16/04/2018 | 6.1 |
| 16/04/2018 | 6.1 |
| 16/04/2018 | 5.9 |
| 16/04/2018 | 6.2 |
| 16/04/2018 | 6.1 |
| 16/04/2018 | 6.3 |
| 16/04/2018 | 5.2 |
| 16/04/2018 | 4.6 |
| 16/04/2018 | 4.2 |
| 17/04/2018 | 3.7 |
| 17/04/2018 | 2.9 |
| 17/04/2018 | 2.8 |
| 17/04/2018 | 2.7 |
| 17/04/2018 | 3 |
| 17/04/2018 | 3.7 |
| 17/04/2018 | 4.6 |
| 17/04/2018 | 5.1 |
| 17/04/2018 | 5.6 |
| 17/04/2018 | 6.4 |
| 17/04/2018 | 6.6 |
| 17/04/2018 | 6.8 |
| 17/04/2018 | 6.9 |
| 17/04/2018 | 6.5 |
| 17/04/2018 | 6.4 |
| 17/04/2018 | 6.3 |
| 17/04/2018 | 6.3 |
| 17/04/2018 | 6.1 |
| 17/04/2018 | 6 |
| 17/04/2018 | 6.2 |
| 17/04/2018 | 5.9 |
| 17/04/2018 | 5.2 |
| 17/04/2018 | 4.6 |
| 17/04/2018 | 4.2 |
| 18/04/2018 | 3.3 |
| 18/04/2018 | 2.9 |
| 18/04/2018 | 2.9 |
| 18/04/2018 | 2.8 |
| 18/04/2018 | 3 |
| 18/04/2018 | 3.7 |
| 18/04/2018 | 4.6 |
| 18/04/2018 | 5.2 |
| 18/04/2018 | 5.7 |
| 18/04/2018 | 6.5 |
| 18/04/2018 | 6.7 |
| 18/04/2018 | 6.9 |
| 18/04/2018 | 7 |
| 18/04/2018 | 6.5 |
| 18/04/2018 | 6.4 |
| 18/04/2018 | 6.3 |
| 18/04/2018 | 6.3 |
| 18/04/2018 | 6.1 |
| 18/04/2018 | 6.3 |
| 18/04/2018 | 6 |
| 18/04/2018 | 6.2 |
| 18/04/2018 | 5.6 |
| 18/04/2018 | 4.7 |
| 18/04/2018 | 4.2 |
| 19/04/2018 | 3.3 |
| 19/04/2018 | 2.9 |
| 19/04/2018 | 2.9 |
| 19/04/2018 | 2.8 |
| 19/04/2018 | 3 |
| 19/04/2018 | 3.7 |
| 19/04/2018 | 4.6 |
| 19/04/2018 | 5.2 |
| 19/04/2018 | 6.1 |
| 19/04/2018 | 6.3 |
| 19/04/2018 | 6.6 |
| 19/04/2018 | 6.8 |
| 19/04/2018 | 6.9 |
| 19/04/2018 | 6.4 |
| 19/04/2018 | 6.3 |
| 19/04/2018 | 6.2 |
| 19/04/2018 | 6.2 |
| 19/04/2018 | 6.1 |
| 19/04/2018 | 5.8 |
| 19/04/2018 | 6 |
| 19/04/2018 | 6.2 |
| 19/04/2018 | 5.2 |
| 19/04/2018 | 4.7 |
| 19/04/2018 | 3.8 |
| 20/04/2018 | 3.4 |
| 20/04/2018 | 3 |
| 20/04/2018 | 2.9 |
| 20/04/2018 | 2.8 |
| 20/04/2018 | 3 |
| 20/04/2018 | 3.6 |
| 20/04/2018 | 4.4 |
| 20/04/2018 | 5 |
| 20/04/2018 | 6 |
| 20/04/2018 | 6.3 |
| 20/04/2018 | 6.5 |
| 20/04/2018 | 6.7 |
| 20/04/2018 | 6.6 |
| 20/04/2018 | 6.3 |
| 20/04/2018 | 6.1 |
| 20/04/2018 | 5.9 |
| 20/04/2018 | 5.9 |
| 20/04/2018 | 6.1 |
| 20/04/2018 | 5.5 |
| 20/04/2018 | 5.6 |
| 20/04/2018 | 5.8 |
| 20/04/2018 | 5 |
| 20/04/2018 | 4.4 |
| 20/04/2018 | 3.9 |
| 21/04/2018 | 3.5 |
| 21/04/2018 | 3.3 |
| 21/04/2018 | 2.7 |
| 21/04/2018 | 3 |
| 21/04/2018 | 2.9 |
| 21/04/2018 | 2.8 |
| 21/04/2018 | 3.1 |
| 21/04/2018 | 3.6 |
| 21/04/2018 | 4.5 |
| 21/04/2018 | 4.7 |
| 21/04/2018 | 5.1 |
| 21/04/2018 | 5.1 |
| 21/04/2018 | 5.1 |
| 21/04/2018 | 4.8 |
| 21/04/2018 | 5.1 |
| 21/04/2018 | 4.7 |
| 21/04/2018 | 4.8 |
| 21/04/2018 | 4.7 |
| 21/04/2018 | 4.5 |
| 21/04/2018 | 4.5 |
| 21/04/2018 | 4.9 |
| 21/04/2018 | 4.4 |
| 21/04/2018 | 4 |
| 21/04/2018 | 3.9 |
| 22/04/2018 | 3.3 |
| 22/04/2018 | 2.7 |
| 22/04/2018 | 2.6 |
| 22/04/2018 | 2.9 |
| 22/04/2018 | 2.8 |
| 22/04/2018 | 2.9 |
| 22/04/2018 | 2.7 |
| 22/04/2018 | 3.1 |
| 22/04/2018 | 3.8 |
| 22/04/2018 | 4 |
| 22/04/2018 | 4.1 |
| 22/04/2018 | 4.5 |
| 22/04/2018 | 4.4 |
| 22/04/2018 | 4.4 |
| 22/04/2018 | 4.2 |
| 22/04/2018 | 4.4 |
| 22/04/2018 | 4.2 |
| 22/04/2018 | 4.1 |
| 22/04/2018 | 4.6 |
| 22/04/2018 | 4.5 |
| 22/04/2018 | 4.8 |
| 22/04/2018 | 4.5 |
| 22/04/2018 | 4.1 |
| 22/04/2018 | 3.8 |
| 23/04/2018 | 3.3 |
| 23/04/2018 | 3.1 |
| 23/04/2018 | 2.7 |
| 23/04/2018 | 2.6 |
| 23/04/2018 | 2.9 |
| 23/04/2018 | 3.5 |
| 23/04/2018 | 4 |
| 23/04/2018 | 5.1 |
| 23/04/2018 | 5.5 |
| 23/04/2018 | 5.9 |
| 23/04/2018 | 6.1 |
| 23/04/2018 | 6.4 |
| 23/04/2018 | 6.5 |
| 23/04/2018 | 6.1 |
| 23/04/2018 | 6.1 |
| 23/04/2018 | 6 |
| 23/04/2018 | 6 |
| 23/04/2018 | 5.9 |
| 23/04/2018 | 6 |
| 23/04/2018 | 5.7 |
| 23/04/2018 | 5.7 |
| 23/04/2018 | 5.4 |
| 23/04/2018 | 4.4 |
| 23/04/2018 | 4 |
| 24/04/2018 | 3.5 |
| 24/04/2018 | 3.2 |
| 24/04/2018 | 2.7 |
| 24/04/2018 | 2.6 |
| 24/04/2018 | 2.8 |
| 24/04/2018 | 3.5 |
| 24/04/2018 | 4.4 |
| 24/04/2018 | 4.9 |
| 24/04/2018 | 5.9 |
| 24/04/2018 | 6.2 |
| 24/04/2018 | 6.4 |
| 24/04/2018 | 6.6 |
| 24/04/2018 | 6.7 |
| 24/04/2018 | 6.3 |
| 24/04/2018 | 6.2 |
| 24/04/2018 | 6.2 |
| 24/04/2018 | 6.2 |
| 24/04/2018 | 6.1 |
| 24/04/2018 | 5.8 |
| 24/04/2018 | 5.8 |
| 24/04/2018 | 5.8 |
| 24/04/2018 | 5.5 |
| 24/04/2018 | 4.5 |
| 24/04/2018 | 4 |
| 25/04/2018 | 3.1 |
| 25/04/2018 | 2.8 |
| 25/04/2018 | 2.7 |
| 25/04/2018 | 2.7 |
| 25/04/2018 | 2.9 |
| 25/04/2018 | 3.5 |
| 25/04/2018 | 4.4 |
| 25/04/2018 | 5 |
| 25/04/2018 | 6 |
| 25/04/2018 | 6.2 |
| 25/04/2018 | 6.5 |
| 25/04/2018 | 6.7 |
| 25/04/2018 | 6.8 |
| 25/04/2018 | 6.3 |
| 25/04/2018 | 6.2 |
| 25/04/2018 | 6.2 |
| 25/04/2018 | 6.2 |
| 25/04/2018 | 6.1 |
| 25/04/2018 | 6.1 |
| 25/04/2018 | 5.6 |
| 25/04/2018 | 5.6 |
| 25/04/2018 | 5.4 |
| 25/04/2018 | 4.5 |
| 25/04/2018 | 4.1 |
| 26/04/2018 | 3.1 |
| 26/04/2018 | 2.8 |
| 26/04/2018 | 2.7 |
| 26/04/2018 | 2.7 |
| 26/04/2018 | 2.9 |
| 26/04/2018 | 3.5 |
| 26/04/2018 | 4.4 |
| 26/04/2018 | 4.9 |
| 26/04/2018 | 5.9 |
| 26/04/2018 | 6.1 |
| 26/04/2018 | 6.4 |
| 26/04/2018 | 6.6 |
| 26/04/2018 | 6.7 |
| 26/04/2018 | 6.2 |
| 26/04/2018 | 6.1 |
| 26/04/2018 | 6.1 |
| 26/04/2018 | 6.1 |
| 26/04/2018 | 6.1 |
| 26/04/2018 | 6.1 |
| 26/04/2018 | 5.7 |
| 26/04/2018 | 5.6 |
| 26/04/2018 | 5.4 |
| 26/04/2018 | 4.5 |
| 26/04/2018 | 3.7 |
| 27/04/2018 | 3.2 |
| 27/04/2018 | 2.8 |
| 27/04/2018 | 2.8 |
| 27/04/2018 | 2.7 |
| 27/04/2018 | 2.9 |
| 27/04/2018 | 3.4 |
| 27/04/2018 | 4.2 |
| 27/04/2018 | 5.3 |
| 27/04/2018 | 5.8 |
| 27/04/2018 | 6 |
| 27/04/2018 | 6.3 |
| 27/04/2018 | 6.5 |
| 27/04/2018 | 6.4 |
| 27/04/2018 | 6.1 |
| 27/04/2018 | 5.9 |
| 27/04/2018 | 5.8 |
| 27/04/2018 | 5.8 |
| 27/04/2018 | 5.6 |
| 27/04/2018 | 5.8 |
| 27/04/2018 | 5.2 |
| 27/04/2018 | 5.2 |
| 27/04/2018 | 4.8 |
| 27/04/2018 | 4.3 |
| 27/04/2018 | 3.7 |
| 28/04/2018 | 3.3 |
| 28/04/2018 | 3.2 |
| 28/04/2018 | 2.6 |
| 28/04/2018 | 2.8 |
| 28/04/2018 | 2.8 |
| 28/04/2018 | 2.6 |
| 28/04/2018 | 2.9 |
| 28/04/2018 | 3.5 |
| 28/04/2018 | 4.3 |
| 28/04/2018 | 4.5 |
| 28/04/2018 | 5 |
| 28/04/2018 | 4.9 |
| 28/04/2018 | 4.9 |
| 28/04/2018 | 5.2 |
| 28/04/2018 | 5 |
| 28/04/2018 | 4.6 |
| 28/04/2018 | 4.7 |
| 28/04/2018 | 4.7 |
| 28/04/2018 | 4.4 |
| 28/04/2018 | 4.7 |
| 28/04/2018 | 4.4 |
| 28/04/2018 | 4.2 |
| 28/04/2018 | 3.9 |
| 28/04/2018 | 3.7 |
| 29/04/2018 | 3.1 |
| 29/04/2018 | 3.1 |
| 29/04/2018 | 2.5 |
| 29/04/2018 | 2.8 |
| 29/04/2018 | 2.7 |
| 29/04/2018 | 2.7 |
| 29/04/2018 | 2.5 |
| 29/04/2018 | 3 |
| 29/04/2018 | 3.6 |
| 29/04/2018 | 3.8 |
| 29/04/2018 | 4 |
| 29/04/2018 | 4.3 |
| 29/04/2018 | 4.3 |
| 29/04/2018 | 4.2 |
| 29/04/2018 | 4.1 |
| 29/04/2018 | 4.3 |
| 29/04/2018 | 4.1 |
| 29/04/2018 | 4.1 |
| 29/04/2018 | 4.4 |
| 29/04/2018 | 4.2 |
| 29/04/2018 | 4.3 |
| 29/04/2018 | 4.3 |
| 29/04/2018 | 3.9 |
| 29/04/2018 | 3.7 |
| 30/04/2018 | 3.4 |
| 30/04/2018 | 3.2 |
| 30/04/2018 | 2.7 |
| 30/04/2018 | 3 |
| 30/04/2018 | 3 |
| 30/04/2018 | 3 |
| 30/04/2018 | 3.7 |
| 30/04/2018 | 4.7 |
| 30/04/2018 | 5.5 |
| 30/04/2018 | 5.7 |
| 30/04/2018 | 5.7 |
| 30/04/2018 | 6 |
| 30/04/2018 | 6 |
| 30/04/2018 | 5.9 |
| 30/04/2018 | 5.8 |
| 30/04/2018 | 5.7 |
| 30/04/2018 | 5.9 |
| 30/04/2018 | 6 |
| 30/04/2018 | 5.7 |
| 30/04/2018 | 5 |
| 30/04/2018 | 4.8 |
| 30/04/2018 | 4.7 |
| 30/04/2018 | 4.3 |
| 30/04/2018 | 4 |
| 01/05/2018 | 2.9 |
| 01/05/2018 | 2.9 |
| 01/05/2018 | 2.8 |
| 01/05/2018 | 2.6 |
| 01/05/2018 | 2.5 |
| 01/05/2018 | 2.5 |
| 01/05/2018 | 2.8 |
| 01/05/2018 | 3 |
| 01/05/2018 | 3.4 |
| 01/05/2018 | 4.2 |
| 01/05/2018 | 4.3 |
| 01/05/2018 | 4.5 |
| 01/05/2018 | 4.1 |
| 01/05/2018 | 4.4 |
| 01/05/2018 | 4.2 |
| 01/05/2018 | 4.3 |
| 01/05/2018 | 4.1 |
| 01/05/2018 | 4.1 |
| 01/05/2018 | 4.1 |
| 01/05/2018 | 3.9 |
| 01/05/2018 | 4.3 |
| 01/05/2018 | 4.2 |
| 01/05/2018 | 3.9 |
| 01/05/2018 | 3.4 |
| 02/05/2018 | 3.5 |
| 02/05/2018 | 2.7 |
| 02/05/2018 | 2.6 |
| 02/05/2018 | 2.6 |
| 02/05/2018 | 2.8 |
| 02/05/2018 | 3.3 |
| 02/05/2018 | 4.2 |
| 02/05/2018 | 5.3 |
| 02/05/2018 | 5.8 |
| 02/05/2018 | 6 |
| 02/05/2018 | 6.3 |
| 02/05/2018 | 6.5 |
| 02/05/2018 | 6.6 |
| 02/05/2018 | 6.1 |
| 02/05/2018 | 6 |
| 02/05/2018 | 6.1 |
| 02/05/2018 | 6.1 |
| 02/05/2018 | 6.1 |
| 02/05/2018 | 5.8 |
| 02/05/2018 | 5.7 |
| 02/05/2018 | 5.6 |
| 02/05/2018 | 5.1 |
| 02/05/2018 | 4.4 |
| 02/05/2018 | 3.9 |
| 03/05/2018 | 3 |
| 03/05/2018 | 2.7 |
| 03/05/2018 | 2.6 |
| 03/05/2018 | 2.6 |
| 03/05/2018 | 2.8 |
| 03/05/2018 | 3.3 |
| 03/05/2018 | 4.1 |
| 03/05/2018 | 4.7 |
| 03/05/2018 | 5.7 |
| 03/05/2018 | 5.9 |
| 03/05/2018 | 6.1 |
| 03/05/2018 | 6.4 |
| 03/05/2018 | 6.5 |
| 03/05/2018 | 6.5 |
| 03/05/2018 | 5.9 |
| 03/05/2018 | 5.9 |
| 03/05/2018 | 6 |
| 03/05/2018 | 6.1 |
| 03/05/2018 | 5.9 |
| 03/05/2018 | 5.8 |
| 03/05/2018 | 5 |
| 03/05/2018 | 5.1 |
| 03/05/2018 | 4.4 |
| 03/05/2018 | 4 |
| 04/05/2018 | 3 |
| 04/05/2018 | 2.7 |
| 04/05/2018 | 2.6 |
| 04/05/2018 | 2.6 |
| 04/05/2018 | 2.8 |
| 04/05/2018 | 3.2 |
| 04/05/2018 | 4 |
| 04/05/2018 | 5 |
| 04/05/2018 | 5.5 |
| 04/05/2018 | 5.8 |
| 04/05/2018 | 6.1 |
| 04/05/2018 | 6.3 |
| 04/05/2018 | 6.2 |
| 04/05/2018 | 6 |
| 04/05/2018 | 5.7 |
| 04/05/2018 | 5.6 |
| 04/05/2018 | 5.7 |
| 04/05/2018 | 5.6 |
| 04/05/2018 | 5.6 |
| 04/05/2018 | 5.4 |
| 04/05/2018 | 5.2 |
| 04/05/2018 | 5 |
| 04/05/2018 | 4.2 |
| 04/05/2018 | 3.6 |
| 05/05/2018 | 3.2 |
| 05/05/2018 | 3.1 |
| 05/05/2018 | 3 |
| 05/05/2018 | 2.7 |
| 05/05/2018 | 2.7 |
| 05/05/2018 | 2.9 |
| 05/05/2018 | 3.2 |
| 05/05/2018 | 3.3 |
| 05/05/2018 | 4.2 |
| 05/05/2018 | 4.3 |
| 05/05/2018 | 4.8 |
| 05/05/2018 | 4.8 |
| 05/05/2018 | 4.7 |
| 05/05/2018 | 5 |
| 05/05/2018 | 4.8 |
| 05/05/2018 | 4.4 |
| 05/05/2018 | 4.6 |
| 05/05/2018 | 4.7 |
| 05/05/2018 | 4.7 |
| 05/05/2018 | 4.4 |
| 05/05/2018 | 4.4 |
| 05/05/2018 | 4.5 |
| 05/05/2018 | 3.8 |
| 05/05/2018 | 3.6 |
| 06/05/2018 | 3 |
| 06/05/2018 | 3 |
| 06/05/2018 | 2.4 |
| 06/05/2018 | 2.7 |
| 06/05/2018 | 2.6 |
| 06/05/2018 | 2.6 |
| 06/05/2018 | 2.9 |
| 06/05/2018 | 2.8 |
| 06/05/2018 | 3.5 |
| 06/05/2018 | 3.7 |
| 06/05/2018 | 3.8 |
| 06/05/2018 | 4.2 |
| 06/05/2018 | 4.1 |
| 06/05/2018 | 4.1 |
| 06/05/2018 | 4 |
| 06/05/2018 | 4.2 |
| 06/05/2018 | 4.1 |
| 06/05/2018 | 4 |
| 06/05/2018 | 4.3 |
| 06/05/2018 | 3.9 |
| 06/05/2018 | 3.9 |
| 06/05/2018 | 4 |
| 06/05/2018 | 3.8 |
| 06/05/2018 | 3.5 |
| 07/05/2018 | 3 |
| 07/05/2018 | 2.9 |
| 07/05/2018 | 2.5 |
| 07/05/2018 | 2.4 |
| 07/05/2018 | 2.7 |
| 07/05/2018 | 3.2 |
| 07/05/2018 | 4.1 |
| 07/05/2018 | 4.6 |
| 07/05/2018 | 5.6 |
| 07/05/2018 | 5.9 |
| 07/05/2018 | 6.2 |
| 07/05/2018 | 6 |
| 07/05/2018 | 6.2 |
| 07/05/2018 | 5.8 |
| 07/05/2018 | 5.7 |
| 07/05/2018 | 5.7 |
| 07/05/2018 | 5.8 |
| 07/05/2018 | 5.9 |
| 07/05/2018 | 5.6 |
| 07/05/2018 | 5.4 |
| 07/05/2018 | 5.1 |
| 07/05/2018 | 4.9 |
| 07/05/2018 | 4.2 |
| 07/05/2018 | 3.7 |
| 08/05/2018 | 3.2 |
| 08/05/2018 | 3 |
| 08/05/2018 | 2.5 |
| 08/05/2018 | 2.9 |
| 08/05/2018 | 3.1 |
| 08/05/2018 | 3.1 |
| 08/05/2018 | 3.9 |
| 08/05/2018 | 5 |
| 08/05/2018 | 5.5 |
| 08/05/2018 | 5.7 |
| 08/05/2018 | 6 |
| 08/05/2018 | 6.2 |
| 08/05/2018 | 6.4 |
| 08/05/2018 | 5.9 |
| 08/05/2018 | 5.9 |
| 08/05/2018 | 5.9 |
| 08/05/2018 | 6 |
| 08/05/2018 | 6.1 |
| 08/05/2018 | 5.8 |
| 08/05/2018 | 5.6 |
| 08/05/2018 | 5.2 |
| 08/05/2018 | 5 |
| 08/05/2018 | 4.2 |
| 08/05/2018 | 3.7 |
| 09/05/2018 | 3.3 |
| 09/05/2018 | 3.1 |
| 09/05/2018 | 2.5 |
| 09/05/2018 | 3 |
| 09/05/2018 | 3.2 |
| 09/05/2018 | 3.1 |
| 09/05/2018 | 4 |
| 09/05/2018 | 5.1 |
| 09/05/2018 | 5.5 |
| 09/05/2018 | 5.8 |
| 09/05/2018 | 6.1 |
| 09/05/2018 | 6.3 |
| 09/05/2018 | 6.4 |
| 09/05/2018 | 5.9 |
| 09/05/2018 | 5.9 |
| 09/05/2018 | 5.9 |
| 09/05/2018 | 6 |
| 09/05/2018 | 6 |
| 09/05/2018 | 5.6 |
| 09/05/2018 | 5.4 |
| 09/05/2018 | 5 |
| 09/05/2018 | 4.9 |
| 09/05/2018 | 4.3 |
| 09/05/2018 | 3.8 |
| 10/05/2018 | 2.7 |
| 10/05/2018 | 2.7 |
| 10/05/2018 | 2.7 |
| 10/05/2018 | 2.4 |
| 10/05/2018 | 2.4 |
| 10/05/2018 | 2.3 |
| 10/05/2018 | 2.6 |
| 10/05/2018 | 2.9 |
| 10/05/2018 | 3.2 |
| 10/05/2018 | 4 |
| 10/05/2018 | 4.1 |
| 10/05/2018 | 4.3 |
| 10/05/2018 | 4.4 |
| 10/05/2018 | 4.3 |
| 10/05/2018 | 4 |
| 10/05/2018 | 4.2 |
| 10/05/2018 | 4 |
| 10/05/2018 | 4 |
| 10/05/2018 | 3.9 |
| 10/05/2018 | 4 |
| 10/05/2018 | 3.7 |
| 10/05/2018 | 3.9 |
| 10/05/2018 | 3.7 |
| 10/05/2018 | 3.2 |
| 11/05/2018 | 3.1 |
| 11/05/2018 | 3 |
| 11/05/2018 | 2.5 |
| 11/05/2018 | 2.9 |
| 11/05/2018 | 2.9 |
| 11/05/2018 | 3.2 |
| 11/05/2018 | 3.9 |
| 11/05/2018 | 4.4 |
| 11/05/2018 | 5.2 |
| 11/05/2018 | 5.4 |
| 11/05/2018 | 5.4 |
| 11/05/2018 | 5.7 |
| 11/05/2018 | 5.7 |
| 11/05/2018 | 5.7 |
| 11/05/2018 | 5.6 |
| 11/05/2018 | 5.5 |
| 11/05/2018 | 5.8 |
| 11/05/2018 | 5.9 |
| 11/05/2018 | 5.9 |
| 11/05/2018 | 5 |
| 11/05/2018 | 4.5 |
| 11/05/2018 | 4.8 |
| 11/05/2018 | 4.1 |
| 11/05/2018 | 3.7 |
| 12/05/2018 | 3 |
| 12/05/2018 | 2.9 |
| 12/05/2018 | 2.9 |
| 12/05/2018 | 2.6 |
| 12/05/2018 | 2.6 |
| 12/05/2018 | 2.8 |
| 12/05/2018 | 3.1 |
| 12/05/2018 | 3.7 |
| 12/05/2018 | 4 |
| 12/05/2018 | 4.6 |
| 12/05/2018 | 4.6 |
| 12/05/2018 | 4.6 |
| 12/05/2018 | 5.1 |
| 12/05/2018 | 4.9 |
| 12/05/2018 | 4.7 |
| 12/05/2018 | 4.3 |
| 12/05/2018 | 4.5 |
| 12/05/2018 | 4.7 |
| 12/05/2018 | 4.5 |
| 12/05/2018 | 4.1 |
| 12/05/2018 | 3.9 |
| 12/05/2018 | 4.3 |
| 12/05/2018 | 3.6 |
| 12/05/2018 | 3.4 |
| 13/05/2018 | 2.9 |
| 13/05/2018 | 2.9 |
| 13/05/2018 | 2.3 |
| 13/05/2018 | 2.6 |
| 13/05/2018 | 2.5 |
| 13/05/2018 | 2.4 |
| 13/05/2018 | 2.7 |
| 13/05/2018 | 2.7 |
| 13/05/2018 | 3.3 |
| 13/05/2018 | 3.5 |
| 13/05/2018 | 4.2 |
| 13/05/2018 | 4 |
| 13/05/2018 | 4 |
| 13/05/2018 | 4 |
| 13/05/2018 | 3.9 |
| 13/05/2018 | 4.1 |
| 13/05/2018 | 4 |
| 13/05/2018 | 4 |
| 13/05/2018 | 4.1 |
| 13/05/2018 | 4.1 |
| 13/05/2018 | 3.9 |
| 13/05/2018 | 4.3 |
| 13/05/2018 | 3.7 |
| 13/05/2018 | 3.4 |
| 14/05/2018 | 2.8 |
| 14/05/2018 | 2.8 |
| 14/05/2018 | 2.4 |
| 14/05/2018 | 2.3 |
| 14/05/2018 | 2.6 |
| 14/05/2018 | 3 |
| 14/05/2018 | 3.9 |
| 14/05/2018 | 4.9 |
| 14/05/2018 | 5.4 |
| 14/05/2018 | 5.7 |
| 14/05/2018 | 6 |
| 14/05/2018 | 5.8 |
| 14/05/2018 | 6 |
| 14/05/2018 | 5.6 |
| 14/05/2018 | 5.6 |
| 14/05/2018 | 5.6 |
| 14/05/2018 | 5.7 |
| 14/05/2018 | 5.8 |
| 14/05/2018 | 5.4 |
| 14/05/2018 | 5.1 |
| 14/05/2018 | 4.6 |
| 14/05/2018 | 4.6 |
| 14/05/2018 | 4.1 |
| 14/05/2018 | 3.5 |
| 15/05/2018 | 3.1 |
| 15/05/2018 | 2.9 |
| 15/05/2018 | 2.8 |
| 15/05/2018 | 2.8 |
| 15/05/2018 | 3 |
| 15/05/2018 | 2.9 |
| 15/05/2018 | 3.7 |
| 15/05/2018 | 4.8 |
| 15/05/2018 | 5.3 |
| 15/05/2018 | 5.5 |
| 15/05/2018 | 5.8 |
| 15/05/2018 | 6 |
| 15/05/2018 | 6.2 |
| 15/05/2018 | 5.7 |
| 15/05/2018 | 5.7 |
| 15/05/2018 | 5.7 |
| 15/05/2018 | 5.9 |
| 15/05/2018 | 6.1 |
| 15/05/2018 | 5.6 |
| 15/05/2018 | 5.2 |
| 15/05/2018 | 4.6 |
| 15/05/2018 | 4.7 |
| 15/05/2018 | 4.1 |
| 15/05/2018 | 3.6 |
| 16/05/2018 | 3.2 |
| 16/05/2018 | 2.9 |
| 16/05/2018 | 2.4 |
| 16/05/2018 | 2.9 |
| 16/05/2018 | 3 |
| 16/05/2018 | 2.9 |
| 16/05/2018 | 3.8 |
| 16/05/2018 | 4.8 |
| 16/05/2018 | 5.3 |
| 16/05/2018 | 5.6 |
| 16/05/2018 | 5.9 |
| 16/05/2018 | 6.1 |
| 16/05/2018 | 6.2 |
| 16/05/2018 | 5.7 |
| 16/05/2018 | 5.7 |
| 16/05/2018 | 5.8 |
| 16/05/2018 | 5.9 |
| 16/05/2018 | 6 |
| 16/05/2018 | 5.4 |
| 16/05/2018 | 5 |
| 16/05/2018 | 4.4 |
| 16/05/2018 | 4.6 |
| 16/05/2018 | 4.1 |
| 16/05/2018 | 3.6 |
| 17/05/2018 | 3.2 |
| 17/05/2018 | 2.9 |
| 17/05/2018 | 2.4 |
| 17/05/2018 | 2.9 |
| 17/05/2018 | 3 |
| 17/05/2018 | 2.9 |
| 17/05/2018 | 3.7 |
| 17/05/2018 | 4.8 |
| 17/05/2018 | 5.2 |
| 17/05/2018 | 5.9 |
| 17/05/2018 | 5.7 |
| 17/05/2018 | 6 |
| 17/05/2018 | 6.1 |
| 17/05/2018 | 6.2 |
| 17/05/2018 | 5.6 |
| 17/05/2018 | 5.6 |
| 17/05/2018 | 5.8 |
| 17/05/2018 | 6 |
| 17/05/2018 | 5.5 |
| 17/05/2018 | 5 |
| 17/05/2018 | 4.4 |
| 17/05/2018 | 4.6 |
| 17/05/2018 | 4.2 |
| 17/05/2018 | 3.7 |
| 18/05/2018 | 2.7 |
| 18/05/2018 | 2.5 |
| 18/05/2018 | 2.4 |
| 18/05/2018 | 2.9 |
| 18/05/2018 | 3 |
| 18/05/2018 | 2.8 |
| 18/05/2018 | 3.6 |
| 18/05/2018 | 4.6 |
| 18/05/2018 | 5.1 |
| 18/05/2018 | 5.9 |
| 18/05/2018 | 5.7 |
| 18/05/2018 | 5.9 |
| 18/05/2018 | 5.8 |
| 18/05/2018 | 5.6 |
| 18/05/2018 | 5.4 |
| 18/05/2018 | 5.4 |
| 18/05/2018 | 5.6 |
| 18/05/2018 | 5.5 |
| 18/05/2018 | 5.2 |
| 18/05/2018 | 4.6 |
| 18/05/2018 | 4.1 |
| 18/05/2018 | 4.5 |
| 18/05/2018 | 3.9 |
| 18/05/2018 | 3.3 |
| 19/05/2018 | 2.9 |
| 19/05/2018 | 2.8 |
| 19/05/2018 | 2.8 |
| 19/05/2018 | 2.6 |
| 19/05/2018 | 2.5 |
| 19/05/2018 | 2.6 |
| 19/05/2018 | 3 |
| 19/05/2018 | 3.5 |
| 19/05/2018 | 3.9 |
| 19/05/2018 | 4.5 |
| 19/05/2018 | 4.5 |
| 19/05/2018 | 5 |
| 19/05/2018 | 5 |
| 19/05/2018 | 4.8 |
| 19/05/2018 | 4.6 |
| 19/05/2018 | 4.2 |
| 19/05/2018 | 4.5 |
| 19/05/2018 | 4.7 |
| 19/05/2018 | 4.4 |
| 19/05/2018 | 3.8 |
| 19/05/2018 | 3.5 |
| 19/05/2018 | 4.1 |
| 19/05/2018 | 3.5 |
| 19/05/2018 | 3.3 |
| 20/05/2018 | 3.1 |
| 20/05/2018 | 2.7 |
| 20/05/2018 | 2.7 |
| 20/05/2018 | 2.5 |
| 20/05/2018 | 2.4 |
| 20/05/2018 | 2.8 |
| 20/05/2018 | 2.7 |
| 20/05/2018 | 2.7 |
| 20/05/2018 | 3.3 |
| 20/05/2018 | 3.5 |
| 20/05/2018 | 4.1 |
| 20/05/2018 | 4.4 |
| 20/05/2018 | 4.7 |
| 20/05/2018 | 4.5 |
| 20/05/2018 | 4.3 |
| 20/05/2018 | 4 |
| 20/05/2018 | 4.4 |
| 20/05/2018 | 4.1 |
| 20/05/2018 | 4.2 |
| 20/05/2018 | 4.2 |
| 20/05/2018 | 3.8 |
| 20/05/2018 | 3.9 |
| 20/05/2018 | 3.6 |
| 20/05/2018 | 3.5 |
| 21/05/2018 | 3.2 |
| 21/05/2018 | 2.7 |
| 21/05/2018 | 2.7 |
| 21/05/2018 | 2.5 |
| 21/05/2018 | 2.4 |
| 21/05/2018 | 2.8 |
| 21/05/2018 | 2.7 |
| 21/05/2018 | 2.7 |
| 21/05/2018 | 3.3 |
| 21/05/2018 | 3.5 |
| 21/05/2018 | 4.1 |
| 21/05/2018 | 4.4 |
| 21/05/2018 | 4.7 |
| 21/05/2018 | 4.5 |
| 21/05/2018 | 4.3 |
| 21/05/2018 | 4 |
| 21/05/2018 | 4.4 |
| 21/05/2018 | 4.1 |
| 21/05/2018 | 4.2 |
| 21/05/2018 | 4.2 |
| 21/05/2018 | 3.8 |
| 21/05/2018 | 3.9 |
| 21/05/2018 | 3.6 |
| 21/05/2018 | 3.5 |
| 22/05/2018 | 2.9 |
| 22/05/2018 | 2.7 |
| 22/05/2018 | 2.2 |
| 22/05/2018 | 2.7 |
| 22/05/2018 | 2.8 |
| 22/05/2018 | 2.9 |
| 22/05/2018 | 3.3 |
| 22/05/2018 | 4.7 |
| 22/05/2018 | 5.2 |
| 22/05/2018 | 5.6 |
| 22/05/2018 | 5.5 |
| 22/05/2018 | 5.8 |
| 22/05/2018 | 5.5 |
| 22/05/2018 | 5.4 |
| 22/05/2018 | 5.3 |
| 22/05/2018 | 5.3 |
| 22/05/2018 | 4.8 |
| 22/05/2018 | 5.2 |
| 22/05/2018 | 5.5 |
| 22/05/2018 | 5.4 |
| 22/05/2018 | 4.3 |
| 22/05/2018 | 4.4 |
| 22/05/2018 | 3.8 |
| 22/05/2018 | 3.4 |
| 23/05/2018 | 3.2 |
| 23/05/2018 | 2.9 |
| 23/05/2018 | 2.9 |
| 23/05/2018 | 2.9 |
| 23/05/2018 | 3 |
| 23/05/2018 | 3.4 |
| 23/05/2018 | 3.7 |
| 23/05/2018 | 4.8 |
| 23/05/2018 | 5.3 |
| 23/05/2018 | 6 |
| 23/05/2018 | 5.9 |
| 23/05/2018 | 6.1 |
| 23/05/2018 | 6.2 |
| 23/05/2018 | 6.3 |
| 23/05/2018 | 5.8 |
| 23/05/2018 | 5.8 |
| 23/05/2018 | 6 |
| 23/05/2018 | 6.1 |
| 23/05/2018 | 5.4 |
| 23/05/2018 | 5.5 |
| 23/05/2018 | 4.8 |
| 23/05/2018 | 5 |
| 23/05/2018 | 4.1 |
| 23/05/2018 | 3.6 |
| 24/05/2018 | 3.2 |
| 24/05/2018 | 3 |
| 24/05/2018 | 2.4 |
| 24/05/2018 | 2.9 |
| 24/05/2018 | 3 |
| 24/05/2018 | 2.9 |
| 24/05/2018 | 3.7 |
| 24/05/2018 | 4.8 |
| 24/05/2018 | 5.7 |
| 24/05/2018 | 5.9 |
| 24/05/2018 | 6.3 |
| 24/05/2018 | 6 |
| 24/05/2018 | 6.2 |
| 24/05/2018 | 6.3 |
| 24/05/2018 | 5.7 |
| 24/05/2018 | 5.7 |
| 24/05/2018 | 5.9 |
| 24/05/2018 | 6.1 |
| 24/05/2018 | 5.5 |
| 24/05/2018 | 5.6 |
| 24/05/2018 | 4.9 |
| 24/05/2018 | 5 |
| 24/05/2018 | 4.2 |
| 24/05/2018 | 3.7 |
| 25/05/2018 | 3.3 |
| 25/05/2018 | 3 |
| 25/05/2018 | 2.5 |
| 25/05/2018 | 2.9 |
| 25/05/2018 | 3 |
| 25/05/2018 | 3.3 |
| 25/05/2018 | 4.1 |
| 25/05/2018 | 4.6 |
| 25/05/2018 | 5.6 |
| 25/05/2018 | 5.9 |
| 25/05/2018 | 5.7 |
| 25/05/2018 | 6 |
| 25/05/2018 | 5.9 |
| 25/05/2018 | 5.7 |
| 25/05/2018 | 5.5 |
| 25/05/2018 | 5.5 |
| 25/05/2018 | 5.7 |
| 25/05/2018 | 5.6 |
| 25/05/2018 | 5.3 |
| 25/05/2018 | 5.2 |
| 25/05/2018 | 4.6 |
| 25/05/2018 | 4.4 |
| 25/05/2018 | 4 |
| 25/05/2018 | 3.3 |
| 26/05/2018 | 3 |
| 26/05/2018 | 2.9 |
| 26/05/2018 | 2.8 |
| 26/05/2018 | 2.6 |
| 26/05/2018 | 2.5 |
| 26/05/2018 | 2.7 |
| 26/05/2018 | 3 |
| 26/05/2018 | 3.5 |
| 26/05/2018 | 3.9 |
| 26/05/2018 | 4.5 |
| 26/05/2018 | 4.5 |
| 26/05/2018 | 5 |
| 26/05/2018 | 5 |
| 26/05/2018 | 4.9 |
| 26/05/2018 | 4.7 |
| 26/05/2018 | 4.3 |
| 26/05/2018 | 4.6 |
| 26/05/2018 | 4.7 |
| 26/05/2018 | 4.5 |
| 26/05/2018 | 4.4 |
| 26/05/2018 | 4 |
| 26/05/2018 | 4 |
| 26/05/2018 | 3.6 |
| 26/05/2018 | 3.4 |
| 27/05/2018 | 2.9 |
| 27/05/2018 | 2.8 |
| 27/05/2018 | 2.3 |
| 27/05/2018 | 2.6 |
| 27/05/2018 | 2.5 |
| 27/05/2018 | 2.3 |
| 27/05/2018 | 2.6 |
| 27/05/2018 | 3.1 |
| 27/05/2018 | 3.3 |
| 27/05/2018 | 4 |
| 27/05/2018 | 4.1 |
| 27/05/2018 | 4 |
| 27/05/2018 | 4.5 |
| 27/05/2018 | 4 |
| 27/05/2018 | 3.9 |
| 27/05/2018 | 4.1 |
| 27/05/2018 | 4.1 |
| 27/05/2018 | 4.1 |
| 27/05/2018 | 4.1 |
| 27/05/2018 | 4 |
| 27/05/2018 | 3.6 |
| 27/05/2018 | 4.1 |
| 27/05/2018 | 3.7 |
| 27/05/2018 | 3.4 |
| 28/05/2018 | 2.9 |
| 28/05/2018 | 2.8 |
| 28/05/2018 | 2.4 |
| 28/05/2018 | 2.8 |
| 28/05/2018 | 3 |
| 28/05/2018 | 2.9 |
| 28/05/2018 | 3.8 |
| 28/05/2018 | 4.8 |
| 28/05/2018 | 5.3 |
| 28/05/2018 | 5.6 |
| 28/05/2018 | 6 |
| 28/05/2018 | 5.8 |
| 28/05/2018 | 6 |
| 28/05/2018 | 6.2 |
| 28/05/2018 | 5.7 |
| 28/05/2018 | 5.7 |
| 28/05/2018 | 5.8 |
| 28/05/2018 | 5.9 |
| 28/05/2018 | 5.9 |
| 28/05/2018 | 5.5 |
| 28/05/2018 | 4.8 |
| 28/05/2018 | 4.9 |
| 28/05/2018 | 4.1 |
| 28/05/2018 | 3.5 |
| 29/05/2018 | 3.1 |
| 29/05/2018 | 2.9 |
| 29/05/2018 | 2.9 |
| 29/05/2018 | 2.8 |
| 29/05/2018 | 3 |
| 29/05/2018 | 3.3 |
| 29/05/2018 | 4.2 |
| 29/05/2018 | 4.7 |
| 29/05/2018 | 5.7 |
| 29/05/2018 | 6 |
| 29/05/2018 | 6.3 |
| 29/05/2018 | 6.1 |
| 29/05/2018 | 6.3 |
| 29/05/2018 | 6.4 |
| 29/05/2018 | 5.8 |
| 29/05/2018 | 5.9 |
| 29/05/2018 | 5.6 |
| 29/05/2018 | 6.2 |
| 29/05/2018 | 5.7 |
| 29/05/2018 | 5.7 |
| 29/05/2018 | 4.9 |
| 29/05/2018 | 5 |
| 29/05/2018 | 4.1 |
| 29/05/2018 | 3.6 |
| 30/05/2018 | 3.3 |
| 30/05/2018 | 3 |
| 30/05/2018 | 3 |
| 30/05/2018 | 2.9 |
| 30/05/2018 | 3 |
| 30/05/2018 | 3.4 |
| 30/05/2018 | 4.2 |
| 30/05/2018 | 4.8 |
| 30/05/2018 | 5.8 |
| 30/05/2018 | 6.1 |
| 30/05/2018 | 5.9 |
| 30/05/2018 | 6.2 |
| 30/05/2018 | 6.3 |
| 30/05/2018 | 6.4 |
| 30/05/2018 | 5.9 |
| 30/05/2018 | 6 |
| 30/05/2018 | 6.1 |
| 30/05/2018 | 6.2 |
| 30/05/2018 | 6 |
| 30/05/2018 | 5.6 |
| 30/05/2018 | 4.8 |
| 30/05/2018 | 4.9 |
| 30/05/2018 | 4.2 |
| 30/05/2018 | 3.7 |
| 31/05/2018 | 3.3 |
| 31/05/2018 | 3 |
| 31/05/2018 | 3 |
| 31/05/2018 | 2.9 |
| 31/05/2018 | 3 |
| 31/05/2018 | 3.4 |
| 31/05/2018 | 4.2 |
| 31/05/2018 | 4.8 |
| 31/05/2018 | 5.7 |
| 31/05/2018 | 6 |
| 31/05/2018 | 6.3 |
| 31/05/2018 | 6.1 |
| 31/05/2018 | 6.3 |
| 31/05/2018 | 6.4 |
| 31/05/2018 | 5.8 |
| 31/05/2018 | 5.9 |
| 31/05/2018 | 6 |
| 31/05/2018 | 6.2 |
| 31/05/2018 | 5.6 |
| 31/05/2018 | 5.6 |
| 31/05/2018 | 4.9 |
| 31/05/2018 | 4.9 |
| 31/05/2018 | 4.2 |
| 31/05/2018 | 3.8 |
| 01/06/2018 | 3.4 |
| 01/06/2018 | 3.1 |
| 01/06/2018 | 2.5 |
| 01/06/2018 | 3 |
| 01/06/2018 | 3.1 |
| 01/06/2018 | 3.3 |
| 01/06/2018 | 4.1 |
| 01/06/2018 | 5.1 |
| 01/06/2018 | 5.6 |
| 01/06/2018 | 5.9 |
| 01/06/2018 | 6.3 |
| 01/06/2018 | 6.1 |
| 01/06/2018 | 6 |
| 01/06/2018 | 5.8 |
| 01/06/2018 | 5.7 |
| 01/06/2018 | 5.6 |
| 01/06/2018 | 5.8 |
| 01/06/2018 | 5.7 |
| 01/06/2018 | 5.4 |
| 01/06/2018 | 5.3 |
| 01/06/2018 | 4.6 |
| 01/06/2018 | 4.3 |
| 01/06/2018 | 4 |
| 01/06/2018 | 3.4 |
| 02/06/2018 | 3.1 |
| 02/06/2018 | 3 |
| 02/06/2018 | 2.9 |
| 02/06/2018 | 2.6 |
| 02/06/2018 | 2.6 |
| 02/06/2018 | 2.7 |
| 02/06/2018 | 3 |
| 02/06/2018 | 3.5 |
| 02/06/2018 | 3.9 |
| 02/06/2018 | 4.5 |
| 02/06/2018 | 5.1 |
| 02/06/2018 | 5.1 |
| 02/06/2018 | 5.1 |
| 02/06/2018 | 5 |
| 02/06/2018 | 4.8 |
| 02/06/2018 | 4.4 |
| 02/06/2018 | 4.7 |
| 02/06/2018 | 4.8 |
| 02/06/2018 | 4.5 |
| 02/06/2018 | 4.5 |
| 02/06/2018 | 4 |
| 02/06/2018 | 3.9 |
| 02/06/2018 | 3.6 |
| 02/06/2018 | 3.5 |
| 03/06/2018 | 2.9 |
| 03/06/2018 | 2.9 |
| 03/06/2018 | 2.9 |
| 03/06/2018 | 2.6 |
| 03/06/2018 | 2.5 |
| 03/06/2018 | 2.3 |
| 03/06/2018 | 2.6 |
| 03/06/2018 | 3.1 |
| 03/06/2018 | 3.3 |
| 03/06/2018 | 4 |
| 03/06/2018 | 4.2 |
| 03/06/2018 | 4.1 |
| 03/06/2018 | 4.5 |
| 03/06/2018 | 4.1 |
| 03/06/2018 | 4 |
| 03/06/2018 | 4.2 |
| 03/06/2018 | 4.2 |
| 03/06/2018 | 4.2 |
| 03/06/2018 | 4.2 |
| 03/06/2018 | 4 |
| 03/06/2018 | 4.1 |
| 03/06/2018 | 4 |
| 03/06/2018 | 3.7 |
| 03/06/2018 | 3.4 |
| 04/06/2018 | 2.9 |
| 04/06/2018 | 2.9 |
| 04/06/2018 | 2.4 |
| 04/06/2018 | 2.9 |
| 04/06/2018 | 3 |
| 04/06/2018 | 2.9 |
| 04/06/2018 | 3.8 |
| 04/06/2018 | 4.8 |
| 04/06/2018 | 5.3 |
| 04/06/2018 | 5.7 |
| 04/06/2018 | 6.1 |
| 04/06/2018 | 6.4 |
| 04/06/2018 | 6.1 |
| 04/06/2018 | 6.3 |
| 04/06/2018 | 5.8 |
| 04/06/2018 | 5.8 |
| 04/06/2018 | 5.9 |
| 04/06/2018 | 6 |
| 04/06/2018 | 6 |
| 04/06/2018 | 5.6 |
| 04/06/2018 | 5.3 |
| 04/06/2018 | 4.8 |
| 04/06/2018 | 4.1 |
| 04/06/2018 | 3.6 |
| 05/06/2018 | 3.2 |
| 05/06/2018 | 3 |
| 05/06/2018 | 2.9 |
| 05/06/2018 | 2.9 |
| 05/06/2018 | 3 |
| 05/06/2018 | 3.3 |
| 05/06/2018 | 4.2 |
| 05/06/2018 | 4.7 |
| 05/06/2018 | 5.7 |
| 05/06/2018 | 6 |
| 05/06/2018 | 6.3 |
| 05/06/2018 | 6.2 |
| 05/06/2018 | 6.4 |
| 05/06/2018 | 6.5 |
| 05/06/2018 | 6 |
| 05/06/2018 | 6 |
| 05/06/2018 | 5.7 |
| 05/06/2018 | 6.3 |
| 05/06/2018 | 5.8 |
| 05/06/2018 | 5.8 |
| 05/06/2018 | 4.9 |
| 05/06/2018 | 4.9 |
| 05/06/2018 | 4.2 |
| 05/06/2018 | 3.7 |
| 06/06/2018 | 3.3 |
| 06/06/2018 | 3.1 |
| 06/06/2018 | 3 |
| 06/06/2018 | 3 |
| 06/06/2018 | 3 |
| 06/06/2018 | 3.4 |
| 06/06/2018 | 4.2 |
| 06/06/2018 | 4.8 |
| 06/06/2018 | 5.8 |
| 06/06/2018 | 6.1 |
| 06/06/2018 | 6.5 |
| 06/06/2018 | 6.3 |
| 06/06/2018 | 6.4 |
| 06/06/2018 | 6.5 |
| 06/06/2018 | 6 |
| 06/06/2018 | 6.1 |
| 06/06/2018 | 6.2 |
| 06/06/2018 | 6.2 |
| 06/06/2018 | 6.1 |
| 06/06/2018 | 5.7 |
| 06/06/2018 | 5.3 |
| 06/06/2018 | 4.8 |
| 06/06/2018 | 4.2 |
| 06/06/2018 | 3.8 |
| 07/06/2018 | 3.4 |
| 07/06/2018 | 3.1 |
| 07/06/2018 | 3 |
| 07/06/2018 | 3 |
| 07/06/2018 | 3.1 |
| 07/06/2018 | 3.4 |
| 07/06/2018 | 4.2 |
| 07/06/2018 | 4.8 |
| 07/06/2018 | 5.7 |
| 07/06/2018 | 6 |
| 07/06/2018 | 6.4 |
| 07/06/2018 | 6.2 |
| 07/06/2018 | 6.4 |
| 07/06/2018 | 6.5 |
| 07/06/2018 | 6 |
| 07/06/2018 | 6 |
| 07/06/2018 | 6.1 |
| 07/06/2018 | 6.3 |
| 07/06/2018 | 6.2 |
| 07/06/2018 | 5.7 |
| 07/06/2018 | 5.4 |
| 07/06/2018 | 4.8 |
| 07/06/2018 | 4.3 |
| 07/06/2018 | 3.9 |
| 08/06/2018 | 3.5 |
| 08/06/2018 | 3.2 |
| 08/06/2018 | 3.1 |
| 08/06/2018 | 3 |
| 08/06/2018 | 3.1 |
| 08/06/2018 | 3.3 |
| 08/06/2018 | 4.1 |
| 08/06/2018 | 5.1 |
| 08/06/2018 | 5.6 |
| 08/06/2018 | 6 |
| 08/06/2018 | 6.4 |
| 08/06/2018 | 6.1 |
| 08/06/2018 | 6.1 |
| 08/06/2018 | 6 |
| 08/06/2018 | 5.8 |
| 08/06/2018 | 5.7 |
| 08/06/2018 | 5.9 |
| 08/06/2018 | 5.8 |
| 08/06/2018 | 6 |
| 08/06/2018 | 5.4 |
| 08/06/2018 | 5.1 |
| 08/06/2018 | 4.8 |
| 08/06/2018 | 4.1 |
| 08/06/2018 | 3.5 |
| 09/06/2018 | 3.2 |
| 09/06/2018 | 3 |
| 09/06/2018 | 2.9 |
| 09/06/2018 | 2.7 |
| 09/06/2018 | 2.6 |
| 09/06/2018 | 2.7 |
| 09/06/2018 | 3 |
| 09/06/2018 | 3.5 |
| 09/06/2018 | 4.4 |
| 09/06/2018 | 4.6 |
| 09/06/2018 | 5.1 |
| 09/06/2018 | 5.2 |
| 09/06/2018 | 5.2 |
| 09/06/2018 | 5.1 |
| 09/06/2018 | 4.9 |
| 09/06/2018 | 4.6 |
| 09/06/2018 | 4.8 |
| 09/06/2018 | 4.9 |
| 09/06/2018 | 4.6 |
| 09/06/2018 | 4.6 |
| 09/06/2018 | 4 |
| 09/06/2018 | 4.3 |
| 09/06/2018 | 3.7 |
| 09/06/2018 | 3.5 |
| 10/06/2018 | 3 |
| 10/06/2018 | 3 |
| 10/06/2018 | 2.9 |
| 10/06/2018 | 2.7 |
| 10/06/2018 | 2.5 |
| 10/06/2018 | 2.3 |
| 10/06/2018 | 2.6 |
| 10/06/2018 | 3.1 |
| 10/06/2018 | 3.8 |
| 10/06/2018 | 4 |
| 10/06/2018 | 4.2 |
| 10/06/2018 | 4.2 |
| 10/06/2018 | 4.6 |
| 10/06/2018 | 4.2 |
| 10/06/2018 | 4.1 |
| 10/06/2018 | 4.3 |
| 10/06/2018 | 4.2 |
| 10/06/2018 | 4.2 |
| 10/06/2018 | 4.7 |
| 10/06/2018 | 4.6 |
| 10/06/2018 | 4.1 |
| 10/06/2018 | 3.9 |
| 10/06/2018 | 3.8 |
| 10/06/2018 | 3.5 |
| 11/06/2018 | 3 |
| 11/06/2018 | 2.9 |
| 11/06/2018 | 3 |
| 11/06/2018 | 2.9 |
| 11/06/2018 | 3 |
| 11/06/2018 | 3.4 |
| 11/06/2018 | 3.8 |
| 11/06/2018 | 4.8 |
| 11/06/2018 | 5.8 |
| 11/06/2018 | 6.2 |
| 11/06/2018 | 6.1 |
| 11/06/2018 | 6.5 |
| 11/06/2018 | 6.2 |
| 11/06/2018 | 6.4 |
| 11/06/2018 | 5.9 |
| 11/06/2018 | 5.9 |
| 11/06/2018 | 6 |
| 11/06/2018 | 6.1 |
| 11/06/2018 | 6.1 |
| 11/06/2018 | 5.7 |
| 11/06/2018 | 5.3 |
| 11/06/2018 | 4.7 |
| 11/06/2018 | 4.2 |
| 11/06/2018 | 3.7 |
| 12/06/2018 | 3.3 |
| 12/06/2018 | 3 |
| 12/06/2018 | 3 |
| 12/06/2018 | 2.9 |
| 12/06/2018 | 3 |
| 12/06/2018 | 3.3 |
| 12/06/2018 | 4.2 |
| 12/06/2018 | 5.2 |
| 12/06/2018 | 5.7 |
| 12/06/2018 | 6 |
| 12/06/2018 | 6.4 |
| 12/06/2018 | 6.3 |
| 12/06/2018 | 6.5 |
| 12/06/2018 | 6.6 |
| 12/06/2018 | 6.1 |
| 12/06/2018 | 6.2 |
| 12/06/2018 | 5.8 |
| 12/06/2018 | 6.4 |
| 12/06/2018 | 6.4 |
| 12/06/2018 | 5.9 |
| 12/06/2018 | 5.4 |
| 12/06/2018 | 4.8 |
| 12/06/2018 | 4.3 |
| 12/06/2018 | 3.8 |
| 13/06/2018 | 3.4 |
| 13/06/2018 | 3.1 |
| 13/06/2018 | 3.1 |
| 13/06/2018 | 3 |
| 13/06/2018 | 3.1 |
| 13/06/2018 | 3.4 |
| 13/06/2018 | 4.2 |
| 13/06/2018 | 5.3 |
| 13/06/2018 | 5.8 |
| 13/06/2018 | 6.1 |
| 13/06/2018 | 6.6 |
| 13/06/2018 | 6.4 |
| 13/06/2018 | 6.5 |
| 13/06/2018 | 6.7 |
| 13/06/2018 | 6.1 |
| 13/06/2018 | 6.2 |
| 13/06/2018 | 6.3 |
| 13/06/2018 | 6.3 |
| 13/06/2018 | 6.2 |
| 13/06/2018 | 6.2 |
| 13/06/2018 | 5.3 |
| 13/06/2018 | 4.7 |
| 13/06/2018 | 4.3 |
| 13/06/2018 | 3.9 |
| 14/06/2018 | 3.5 |
| 14/06/2018 | 3.2 |
| 14/06/2018 | 3.1 |
| 14/06/2018 | 3 |
| 14/06/2018 | 3.1 |
| 14/06/2018 | 3.4 |
| 14/06/2018 | 4.2 |
| 14/06/2018 | 5.3 |
| 14/06/2018 | 5.7 |
| 14/06/2018 | 6 |
| 14/06/2018 | 6.4 |
| 14/06/2018 | 6.3 |
| 14/06/2018 | 6.5 |
| 14/06/2018 | 6.6 |
| 14/06/2018 | 6.1 |
| 14/06/2018 | 6.1 |
| 14/06/2018 | 6.3 |
| 14/06/2018 | 6.3 |
| 14/06/2018 | 6.3 |
| 14/06/2018 | 6.3 |
| 14/06/2018 | 5.3 |
| 14/06/2018 | 4.7 |
| 14/06/2018 | 4.3 |
| 14/06/2018 | 4 |
| 15/06/2018 | 3.6 |
| 15/06/2018 | 3.2 |
| 15/06/2018 | 3.1 |
| 15/06/2018 | 3 |
| 15/06/2018 | 3.1 |
| 15/06/2018 | 3.3 |
| 15/06/2018 | 4.1 |
| 15/06/2018 | 5.1 |
| 15/06/2018 | 5.6 |
| 15/06/2018 | 6 |
| 15/06/2018 | 6.4 |
| 15/06/2018 | 6.2 |
| 15/06/2018 | 6.2 |
| 15/06/2018 | 6.1 |
| 15/06/2018 | 5.9 |
| 15/06/2018 | 5.9 |
| 15/06/2018 | 6 |
| 15/06/2018 | 5.8 |
| 15/06/2018 | 6.1 |
| 15/06/2018 | 6 |
| 15/06/2018 | 5.1 |
| 15/06/2018 | 4.7 |
| 15/06/2018 | 4.1 |
| 15/06/2018 | 3.6 |
| 16/06/2018 | 3.2 |
| 16/06/2018 | 3.1 |
| 16/06/2018 | 3 |
| 16/06/2018 | 2.7 |
| 16/06/2018 | 2.6 |
| 16/06/2018 | 2.7 |
| 16/06/2018 | 3 |
| 16/06/2018 | 3.5 |
| 16/06/2018 | 4.4 |
| 16/06/2018 | 4.6 |
| 16/06/2018 | 5.2 |
| 16/06/2018 | 5.3 |
| 16/06/2018 | 5.3 |
| 16/06/2018 | 5.2 |
| 16/06/2018 | 5 |
| 16/06/2018 | 4.7 |
| 16/06/2018 | 4.4 |
| 16/06/2018 | 4.9 |
| 16/06/2018 | 4.7 |
| 16/06/2018 | 5.1 |
| 16/06/2018 | 4.5 |
| 16/06/2018 | 4.2 |
| 16/06/2018 | 4.2 |
| 16/06/2018 | 3.6 |
| 17/06/2018 | 3.1 |
| 17/06/2018 | 3 |
| 17/06/2018 | 3 |
| 17/06/2018 | 2.7 |
| 17/06/2018 | 2.5 |
| 17/06/2018 | 2.3 |
| 17/06/2018 | 2.6 |
| 17/06/2018 | 3.1 |
| 17/06/2018 | 3.8 |
| 17/06/2018 | 4 |
| 17/06/2018 | 4.3 |
| 17/06/2018 | 4.2 |
| 17/06/2018 | 4.7 |
| 17/06/2018 | 4.3 |
| 17/06/2018 | 4.2 |
| 17/06/2018 | 4.4 |
| 17/06/2018 | 4.3 |
| 17/06/2018 | 4.3 |
| 17/06/2018 | 4.8 |
| 17/06/2018 | 4.7 |
| 17/06/2018 | 4.1 |
| 17/06/2018 | 3.8 |
| 17/06/2018 | 3.8 |
| 17/06/2018 | 3.6 |
| 18/06/2018 | 3.1 |
| 18/06/2018 | 3 |
| 18/06/2018 | 3 |
| 18/06/2018 | 3 |
| 18/06/2018 | 3 |
| 18/06/2018 | 3.4 |
| 18/06/2018 | 4.3 |
| 18/06/2018 | 4.8 |
| 18/06/2018 | 5.8 |
| 18/06/2018 | 6.2 |
| 18/06/2018 | 6.2 |
| 18/06/2018 | 6.6 |
| 18/06/2018 | 6.3 |
| 18/06/2018 | 6.6 |
| 18/06/2018 | 6.1 |
| 18/06/2018 | 6.1 |
| 18/06/2018 | 6.2 |
| 18/06/2018 | 6.2 |
| 18/06/2018 | 6.2 |
| 18/06/2018 | 6.3 |
| 18/06/2018 | 5.3 |
| 18/06/2018 | 4.6 |
| 18/06/2018 | 4.2 |
| 18/06/2018 | 3.8 |
| 19/06/2018 | 3.4 |
| 19/06/2018 | 3.1 |
| 19/06/2018 | 3 |
| 19/06/2018 | 3 |
| 19/06/2018 | 3 |
| 19/06/2018 | 3.3 |
| 19/06/2018 | 4.2 |
| 19/06/2018 | 5.2 |
| 19/06/2018 | 5.7 |
| 19/06/2018 | 6 |
| 19/06/2018 | 6.5 |
| 19/06/2018 | 6.4 |
| 19/06/2018 | 6.6 |
| 19/06/2018 | 6.7 |
| 19/06/2018 | 6.2 |
| 19/06/2018 | 6.3 |
| 19/06/2018 | 5.9 |
| 19/06/2018 | 5.9 |
| 19/06/2018 | 6.5 |
| 19/06/2018 | 6.5 |
| 19/06/2018 | 5.4 |
| 19/06/2018 | 4.7 |
| 19/06/2018 | 4.3 |
| 19/06/2018 | 3.9 |
| 20/06/2018 | 3.5 |
| 20/06/2018 | 3.2 |
| 20/06/2018 | 3.1 |
| 20/06/2018 | 3 |
| 20/06/2018 | 3.1 |
| 20/06/2018 | 3.4 |
| 20/06/2018 | 4.2 |
| 20/06/2018 | 5.3 |
| 20/06/2018 | 5.8 |
| 20/06/2018 | 6.1 |
| 20/06/2018 | 6.6 |
| 20/06/2018 | 6.5 |
| 20/06/2018 | 6.6 |
| 20/06/2018 | 6.8 |
| 20/06/2018 | 6.3 |
| 20/06/2018 | 6.3 |
| 20/06/2018 | 6.4 |
| 20/06/2018 | 6.4 |
| 20/06/2018 | 6.3 |
| 20/06/2018 | 6.3 |
| 20/06/2018 | 5.8 |
| 20/06/2018 | 5.1 |
| 20/06/2018 | 4.3 |
| 20/06/2018 | 3.9 |
| 21/06/2018 | 3.6 |
| 21/06/2018 | 3.2 |
| 21/06/2018 | 3.2 |
| 21/06/2018 | 3.1 |
| 21/06/2018 | 3.1 |
| 21/06/2018 | 3.4 |
| 21/06/2018 | 4.2 |
| 21/06/2018 | 5.3 |
| 21/06/2018 | 5.7 |
| 21/06/2018 | 6 |
| 21/06/2018 | 6.5 |
| 21/06/2018 | 6.4 |
| 21/06/2018 | 6.6 |
| 21/06/2018 | 6.8 |
| 21/06/2018 | 6.2 |
| 21/06/2018 | 6.3 |
| 21/06/2018 | 6.4 |
| 21/06/2018 | 6.4 |
| 21/06/2018 | 6.4 |
| 21/06/2018 | 6.4 |
| 21/06/2018 | 5.3 |
| 21/06/2018 | 4.6 |
| 21/06/2018 | 4.4 |
| 21/06/2018 | 4 |
| 22/06/2018 | 3.7 |
| 22/06/2018 | 3.3 |
| 22/06/2018 | 3.2 |
| 22/06/2018 | 3.1 |
| 22/06/2018 | 3.1 |
| 22/06/2018 | 3.3 |
| 22/06/2018 | 4.1 |
| 22/06/2018 | 5.1 |
| 22/06/2018 | 5.6 |
| 22/06/2018 | 6 |
| 22/06/2018 | 6.5 |
| 22/06/2018 | 6.3 |
| 22/06/2018 | 6.3 |
| 22/06/2018 | 6.2 |
| 22/06/2018 | 6.1 |
| 22/06/2018 | 6 |
| 22/06/2018 | 6.1 |
| 22/06/2018 | 5.9 |
| 22/06/2018 | 6.2 |
| 22/06/2018 | 6.1 |
| 22/06/2018 | 5.1 |
| 22/06/2018 | 4.6 |
| 22/06/2018 | 4.2 |
| 22/06/2018 | 4.2 |
| 23/06/2018 | 3.3 |
| 23/06/2018 | 3.1 |
| 23/06/2018 | 3 |
| 23/06/2018 | 2.8 |
| 23/06/2018 | 2.6 |
| 23/06/2018 | 2.7 |
| 23/06/2018 | 3 |
| 23/06/2018 | 3.5 |
| 23/06/2018 | 4.4 |
| 23/06/2018 | 4.6 |
| 23/06/2018 | 5.2 |
| 23/06/2018 | 5.4 |
| 23/06/2018 | 5.4 |
| 23/06/2018 | 5.3 |
| 23/06/2018 | 5.1 |
| 23/06/2018 | 4.8 |
| 23/06/2018 | 4.5 |
| 23/06/2018 | 5 |
| 23/06/2018 | 5.3 |
| 23/06/2018 | 5.2 |
| 23/06/2018 | 4.5 |
| 23/06/2018 | 4.1 |
| 23/06/2018 | 4.3 |
| 23/06/2018 | 3.7 |
| 24/06/2018 | 3.2 |
| 24/06/2018 | 3.1 |
| 24/06/2018 | 3 |
| 24/06/2018 | 2.7 |
| 24/06/2018 | 2.5 |
| 24/06/2018 | 2.8 |
| 24/06/2018 | 2.6 |
| 24/06/2018 | 3.1 |
| 24/06/2018 | 3.8 |
| 24/06/2018 | 4 |
| 24/06/2018 | 4.3 |
| 24/06/2018 | 4.3 |
| 24/06/2018 | 4.8 |
| 24/06/2018 | 4.4 |
| 24/06/2018 | 4.3 |
| 24/06/2018 | 4.5 |
| 24/06/2018 | 4.4 |
| 24/06/2018 | 4.4 |
| 24/06/2018 | 4.9 |
| 24/06/2018 | 4.8 |
| 24/06/2018 | 4.6 |
| 24/06/2018 | 4.2 |
| 24/06/2018 | 3.9 |
| 24/06/2018 | 3.7 |
| 25/06/2018 | 3.2 |
| 25/06/2018 | 3 |
| 25/06/2018 | 3.1 |
| 25/06/2018 | 3 |
| 25/06/2018 | 3.1 |
| 25/06/2018 | 3.4 |
| 25/06/2018 | 4.3 |
| 25/06/2018 | 5.3 |
| 25/06/2018 | 5.8 |
| 25/06/2018 | 6.2 |
| 25/06/2018 | 6.2 |
| 25/06/2018 | 6.7 |
| 25/06/2018 | 6.4 |
| 25/06/2018 | 6.7 |
| 25/06/2018 | 6.2 |
| 25/06/2018 | 6.2 |
| 25/06/2018 | 6.3 |
| 25/06/2018 | 6.3 |
| 25/06/2018 | 6.3 |
| 25/06/2018 | 6.4 |
| 25/06/2018 | 5.8 |
| 25/06/2018 | 5 |
| 25/06/2018 | 4.8 |
| 25/06/2018 | 3.9 |
| 26/06/2018 | 3.4 |
| 26/06/2018 | 3.2 |
| 26/06/2018 | 3.1 |
| 26/06/2018 | 3 |
| 26/06/2018 | 3 |
| 26/06/2018 | 3.3 |
| 26/06/2018 | 4.2 |
| 26/06/2018 | 5.2 |
| 26/06/2018 | 5.7 |
| 26/06/2018 | 6.6 |
| 26/06/2018 | 6.5 |
| 26/06/2018 | 6.9 |
| 26/06/2018 | 6.7 |
| 26/06/2018 | 6.8 |
| 26/06/2018 | 6.4 |
| 26/06/2018 | 6.4 |
| 26/06/2018 | 6 |
| 26/06/2018 | 6 |
| 26/06/2018 | 6.6 |
| 26/06/2018 | 6.6 |
| 26/06/2018 | 5.9 |
| 26/06/2018 | 5.1 |
| 26/06/2018 | 4.4 |
| 26/06/2018 | 3.9 |
| 27/06/2018 | 3.6 |
| 27/06/2018 | 3.3 |
| 27/06/2018 | 3.2 |
| 27/06/2018 | 3.1 |
| 27/06/2018 | 3.1 |
| 27/06/2018 | 3.4 |
| 27/06/2018 | 4.2 |
| 27/06/2018 | 5.3 |
| 27/06/2018 | 5.8 |
| 27/06/2018 | 6.2 |
| 27/06/2018 | 6.7 |
| 27/06/2018 | 6.6 |
| 27/06/2018 | 6.7 |
| 27/06/2018 | 6.9 |
| 27/06/2018 | 6.4 |
| 27/06/2018 | 6.5 |
| 27/06/2018 | 6.1 |
| 27/06/2018 | 6.5 |
| 27/06/2018 | 6.4 |
| 27/06/2018 | 6.4 |
| 27/06/2018 | 5.8 |
| 27/06/2018 | 5 |
| 27/06/2018 | 4.4 |
| 27/06/2018 | 4 |
| 28/06/2018 | 3.6 |
| 28/06/2018 | 3.3 |
| 28/06/2018 | 3.2 |
| 28/06/2018 | 3.1 |
| 28/06/2018 | 3.1 |
| 28/06/2018 | 3.4 |
| 28/06/2018 | 4.2 |
| 28/06/2018 | 5.3 |
| 28/06/2018 | 5.7 |
| 28/06/2018 | 6.6 |
| 28/06/2018 | 6.6 |
| 28/06/2018 | 7 |
| 28/06/2018 | 6.7 |
| 28/06/2018 | 6.9 |
| 28/06/2018 | 6.4 |
| 28/06/2018 | 6.4 |
| 28/06/2018 | 6.5 |
| 28/06/2018 | 6.5 |
| 28/06/2018 | 6.5 |
| 28/06/2018 | 6.5 |
| 28/06/2018 | 5.8 |
| 28/06/2018 | 5 |
| 28/06/2018 | 4.4 |
| 28/06/2018 | 4.1 |
| 29/06/2018 | 3.7 |
| 29/06/2018 | 3.4 |
| 29/06/2018 | 3.3 |
| 29/06/2018 | 3.1 |
| 29/06/2018 | 3.1 |
| 29/06/2018 | 3.4 |
| 29/06/2018 | 4.6 |
| 29/06/2018 | 5.1 |
| 29/06/2018 | 6.1 |
| 29/06/2018 | 6.5 |
| 29/06/2018 | 6.5 |
| 29/06/2018 | 6.9 |
| 29/06/2018 | 6.9 |
| 29/06/2018 | 6.3 |
| 29/06/2018 | 6.2 |
| 29/06/2018 | 6.1 |
| 29/06/2018 | 6.2 |
| 29/06/2018 | 6 |
| 29/06/2018 | 6.3 |
| 29/06/2018 | 6.2 |
| 29/06/2018 | 5.6 |
| 29/06/2018 | 4.5 |
| 29/06/2018 | 4.7 |
| 29/06/2018 | 4.2 |
| 30/06/2018 | 3.4 |
| 30/06/2018 | 3.2 |
| 30/06/2018 | 3.1 |
| 30/06/2018 | 2.8 |
| 30/06/2018 | 3.1 |
| 30/06/2018 | 3.2 |
| 30/06/2018 | 3.5 |
| 30/06/2018 | 3.5 |
| 30/06/2018 | 4.4 |
| 30/06/2018 | 5.1 |
| 30/06/2018 | 5.3 |
| 30/06/2018 | 5.4 |
| 30/06/2018 | 5.5 |
| 30/06/2018 | 5.4 |
| 30/06/2018 | 5.3 |
| 30/06/2018 | 4.9 |
| 30/06/2018 | 4.6 |
| 30/06/2018 | 5.1 |
| 30/06/2018 | 5.4 |
| 30/06/2018 | 5.3 |
| 30/06/2018 | 4.5 |
| 30/06/2018 | 4.1 |
| 30/06/2018 | 4.3 |
| 30/06/2018 | 3.7 |
| 01/07/2018 | 3.2 |
| 01/07/2018 | 3.1 |
| 01/07/2018 | 3.1 |
| 01/07/2018 | 2.8 |
| 01/07/2018 | 2.5 |
| 01/07/2018 | 2.8 |
| 01/07/2018 | 3.1 |
| 01/07/2018 | 3.1 |
| 01/07/2018 | 3.8 |
| 01/07/2018 | 4 |
| 01/07/2018 | 4.4 |
| 01/07/2018 | 4.9 |
| 01/07/2018 | 4.9 |
| 01/07/2018 | 4.5 |
| 01/07/2018 | 4.4 |
| 01/07/2018 | 4.6 |
| 01/07/2018 | 4.5 |
| 01/07/2018 | 4.4 |
| 01/07/2018 | 5 |
| 01/07/2018 | 4.9 |
| 01/07/2018 | 4.6 |
| 01/07/2018 | 4.2 |
| 01/07/2018 | 3.9 |
| 01/07/2018 | 3.7 |
| 02/07/2018 | 3.3 |
| 02/07/2018 | 3.1 |
| 02/07/2018 | 3.1 |
| 02/07/2018 | 3 |
| 02/07/2018 | 3.1 |
| 02/07/2018 | 3.4 |
| 02/07/2018 | 4.3 |
| 02/07/2018 | 5.3 |
| 02/07/2018 | 5.8 |
| 02/07/2018 | 6.3 |
| 02/07/2018 | 6.8 |
| 02/07/2018 | 6.8 |
| 02/07/2018 | 6.5 |
| 02/07/2018 | 6.8 |
| 02/07/2018 | 6.3 |
| 02/07/2018 | 6.3 |
| 02/07/2018 | 5.9 |
| 02/07/2018 | 6.4 |
| 02/07/2018 | 6.4 |
| 02/07/2018 | 6.5 |
| 02/07/2018 | 5.8 |
| 02/07/2018 | 4.9 |
| 02/07/2018 | 4.8 |
| 02/07/2018 | 3.9 |
| 03/07/2018 | 3.5 |
| 03/07/2018 | 3.2 |
| 03/07/2018 | 3.1 |
| 03/07/2018 | 3 |
| 03/07/2018 | 3.1 |
| 03/07/2018 | 3.3 |
| 03/07/2018 | 4.2 |
| 03/07/2018 | 5.2 |
| 03/07/2018 | 6.2 |
| 03/07/2018 | 6.6 |
| 03/07/2018 | 6.6 |
| 03/07/2018 | 7 |
| 03/07/2018 | 6.7 |
| 03/07/2018 | 7 |
| 03/07/2018 | 6.5 |
| 03/07/2018 | 6.5 |
| 03/07/2018 | 6.1 |
| 03/07/2018 | 6.1 |
| 03/07/2018 | 6.7 |
| 03/07/2018 | 6.7 |
| 03/07/2018 | 5.9 |
| 03/07/2018 | 5 |
| 03/07/2018 | 4.9 |
| 03/07/2018 | 4 |
| 04/07/2018 | 3.6 |
| 04/07/2018 | 3.3 |
| 04/07/2018 | 3.2 |
| 04/07/2018 | 3.1 |
| 04/07/2018 | 3.1 |
| 04/07/2018 | 3.4 |
| 04/07/2018 | 4.2 |
| 04/07/2018 | 5.3 |
| 04/07/2018 | 6.3 |
| 04/07/2018 | 6.7 |
| 04/07/2018 | 6.7 |
| 04/07/2018 | 6.6 |
| 04/07/2018 | 6.8 |
| 04/07/2018 | 7 |
| 04/07/2018 | 6.5 |
| 04/07/2018 | 6.6 |
| 04/07/2018 | 6.2 |
| 04/07/2018 | 6.6 |
| 04/07/2018 | 6.5 |
| 04/07/2018 | 6.5 |
| 04/07/2018 | 5.8 |
| 04/07/2018 | 5 |
| 04/07/2018 | 4.4 |
| 04/07/2018 | 4.1 |
| 05/07/2018 | 3.6 |
| 05/07/2018 | 3.2 |
| 05/07/2018 | 3.1 |
| 05/07/2018 | 3 |
| 05/07/2018 | 2.9 |
| 05/07/2018 | 3 |
| 05/07/2018 | 3.9 |
| 05/07/2018 | 5.2 |
| 05/07/2018 | 5.7 |
| 05/07/2018 | 6.2 |
| 05/07/2018 | 6.4 |
| 05/07/2018 | 6.3 |
| 05/07/2018 | 6.5 |
| 05/07/2018 | 6.1 |
| 05/07/2018 | 6 |
| 05/07/2018 | 6 |
| 05/07/2018 | 5.4 |
| 05/07/2018 | 5.7 |
| 05/07/2018 | 6.5 |
| 05/07/2018 | 6.9 |
| 05/07/2018 | 5.3 |
| 05/07/2018 | 4.4 |
| 05/07/2018 | 4.6 |
| 05/07/2018 | 4 |
| 06/07/2018 | 3.6 |
| 06/07/2018 | 3.3 |
| 06/07/2018 | 3.1 |
| 06/07/2018 | 3 |
| 06/07/2018 | 3 |
| 06/07/2018 | 3 |
| 06/07/2018 | 3.8 |
| 06/07/2018 | 5 |
| 06/07/2018 | 5.6 |
| 06/07/2018 | 6.2 |
| 06/07/2018 | 6.3 |
| 06/07/2018 | 6.3 |
| 06/07/2018 | 6.3 |
| 06/07/2018 | 6.1 |
| 06/07/2018 | 5.8 |
| 06/07/2018 | 5.7 |
| 06/07/2018 | 5.7 |
| 06/07/2018 | 5.7 |
| 06/07/2018 | 6.2 |
| 06/07/2018 | 6.5 |
| 06/07/2018 | 5.2 |
| 06/07/2018 | 4.4 |
| 06/07/2018 | 4.4 |
| 06/07/2018 | 4.1 |
| 07/07/2018 | 3.3 |
| 07/07/2018 | 3.1 |
| 07/07/2018 | 3 |
| 07/07/2018 | 2.7 |
| 07/07/2018 | 2.5 |
| 07/07/2018 | 2.9 |
| 07/07/2018 | 2.9 |
| 07/07/2018 | 3.2 |
| 07/07/2018 | 4.1 |
| 07/07/2018 | 4.4 |
| 07/07/2018 | 5.2 |
| 07/07/2018 | 4.9 |
| 07/07/2018 | 4.9 |
| 07/07/2018 | 4.7 |
| 07/07/2018 | 4.5 |
| 07/07/2018 | 4.6 |
| 07/07/2018 | 4.2 |
| 07/07/2018 | 4.3 |
| 07/07/2018 | 5.4 |
| 07/07/2018 | 5.2 |
| 07/07/2018 | 4.2 |
| 07/07/2018 | 3.5 |
| 07/07/2018 | 4 |
| 07/07/2018 | 3.6 |
| 08/07/2018 | 3.1 |
| 08/07/2018 | 3 |
| 08/07/2018 | 3 |
| 08/07/2018 | 2.6 |
| 08/07/2018 | 2.4 |
| 08/07/2018 | 2.6 |
| 08/07/2018 | 2.6 |
| 08/07/2018 | 3 |
| 08/07/2018 | 3.6 |
| 08/07/2018 | 3.9 |
| 08/07/2018 | 4.3 |
| 08/07/2018 | 4.3 |
| 08/07/2018 | 4.3 |
| 08/07/2018 | 4.3 |
| 08/07/2018 | 4.2 |
| 08/07/2018 | 3.9 |
| 08/07/2018 | 3.7 |
| 08/07/2018 | 4.2 |
| 08/07/2018 | 4.9 |
| 08/07/2018 | 4.8 |
| 08/07/2018 | 4.3 |
| 08/07/2018 | 3.7 |
| 08/07/2018 | 4.1 |
| 08/07/2018 | 3.6 |
| 09/07/2018 | 3.1 |
| 09/07/2018 | 3 |
| 09/07/2018 | 3 |
| 09/07/2018 | 2.9 |
| 09/07/2018 | 2.9 |
| 09/07/2018 | 3.1 |
| 09/07/2018 | 4 |
| 09/07/2018 | 4.7 |
| 09/07/2018 | 5.3 |
| 09/07/2018 | 5.9 |
| 09/07/2018 | 6 |
| 09/07/2018 | 6 |
| 09/07/2018 | 6.3 |
| 09/07/2018 | 6 |
| 09/07/2018 | 5.9 |
| 09/07/2018 | 5.9 |
| 09/07/2018 | 5.3 |
| 09/07/2018 | 5.5 |
| 09/07/2018 | 6.2 |
| 09/07/2018 | 6.7 |
| 09/07/2018 | 5.3 |
| 09/07/2018 | 4.4 |
| 09/07/2018 | 4.4 |
| 09/07/2018 | 3.7 |
| 10/07/2018 | 3.3 |
| 10/07/2018 | 3.1 |
| 10/07/2018 | 3 |
| 10/07/2018 | 2.9 |
| 10/07/2018 | 2.9 |
| 10/07/2018 | 3 |
| 10/07/2018 | 3.8 |
| 10/07/2018 | 4.6 |
| 10/07/2018 | 5.7 |
| 10/07/2018 | 6.2 |
| 10/07/2018 | 6.3 |
| 10/07/2018 | 6.3 |
| 10/07/2018 | 6.5 |
| 10/07/2018 | 6.1 |
| 10/07/2018 | 6.1 |
| 10/07/2018 | 6.1 |
| 10/07/2018 | 5.5 |
| 10/07/2018 | 5.7 |
| 10/07/2018 | 6.5 |
| 10/07/2018 | 6.4 |
| 10/07/2018 | 5.5 |
| 10/07/2018 | 4.5 |
| 10/07/2018 | 4.5 |
| 10/07/2018 | 3.8 |
| 11/07/2018 | 3.5 |
| 11/07/2018 | 3.2 |
| 11/07/2018 | 3.1 |
| 11/07/2018 | 3 |
| 11/07/2018 | 3 |
| 11/07/2018 | 3.1 |
| 11/07/2018 | 3.9 |
| 11/07/2018 | 4.7 |
| 11/07/2018 | 5.8 |
| 11/07/2018 | 5.8 |
| 11/07/2018 | 6.4 |
| 11/07/2018 | 6.4 |
| 11/07/2018 | 6.6 |
| 11/07/2018 | 6.1 |
| 11/07/2018 | 6.1 |
| 11/07/2018 | 6.1 |
| 11/07/2018 | 5.5 |
| 11/07/2018 | 5.6 |
| 11/07/2018 | 6.3 |
| 11/07/2018 | 6.2 |
| 11/07/2018 | 5.4 |
| 11/07/2018 | 4.5 |
| 11/07/2018 | 4.5 |
| 11/07/2018 | 3.8 |
| 12/07/2018 | 3.5 |
| 12/07/2018 | 3.2 |
| 12/07/2018 | 3.1 |
| 12/07/2018 | 3 |
| 12/07/2018 | 3 |
| 12/07/2018 | 3.1 |
| 12/07/2018 | 3.9 |
| 12/07/2018 | 4.7 |
| 12/07/2018 | 5.7 |
| 12/07/2018 | 6.2 |
| 12/07/2018 | 6.3 |
| 12/07/2018 | 6.3 |
| 12/07/2018 | 6.5 |
| 12/07/2018 | 6.1 |
| 12/07/2018 | 6 |
| 12/07/2018 | 6 |
| 12/07/2018 | 5.5 |
| 12/07/2018 | 5.6 |
| 12/07/2018 | 6.3 |
| 12/07/2018 | 6.3 |
| 12/07/2018 | 5.5 |
| 12/07/2018 | 4.5 |
| 12/07/2018 | 4.5 |
| 12/07/2018 | 3.9 |
| 13/07/2018 | 3.6 |
| 13/07/2018 | 3.2 |
| 13/07/2018 | 3.1 |
| 13/07/2018 | 3 |
| 13/07/2018 | 3 |
| 13/07/2018 | 3.1 |
| 13/07/2018 | 3.8 |
| 13/07/2018 | 5 |
| 13/07/2018 | 5.6 |
| 13/07/2018 | 5.6 |
| 13/07/2018 | 6.3 |
| 13/07/2018 | 6.2 |
| 13/07/2018 | 6.2 |
| 13/07/2018 | 6 |
| 13/07/2018 | 5.8 |
| 13/07/2018 | 5.7 |
| 13/07/2018 | 5.2 |
| 13/07/2018 | 5.6 |
| 13/07/2018 | 6.1 |
| 13/07/2018 | 5.9 |
| 13/07/2018 | 4.8 |
| 13/07/2018 | 4.5 |
| 13/07/2018 | 4.3 |
| 13/07/2018 | 4 |
| 14/07/2018 | 3.2 |
| 14/07/2018 | 3.1 |
| 14/07/2018 | 3 |
| 14/07/2018 | 2.7 |
| 14/07/2018 | 2.5 |
| 14/07/2018 | 2.5 |
| 14/07/2018 | 2.9 |
| 14/07/2018 | 3.2 |
| 14/07/2018 | 4.1 |
| 14/07/2018 | 4.4 |
| 14/07/2018 | 5.1 |
| 14/07/2018 | 4.8 |
| 14/07/2018 | 4.8 |
| 14/07/2018 | 4.7 |
| 14/07/2018 | 4.5 |
| 14/07/2018 | 4.6 |
| 14/07/2018 | 4.2 |
| 14/07/2018 | 4.3 |
| 14/07/2018 | 4.7 |
| 14/07/2018 | 5.1 |
| 14/07/2018 | 4.3 |
| 14/07/2018 | 3.7 |
| 14/07/2018 | 3.9 |
| 14/07/2018 | 3.5 |
| 15/07/2018 | 3.1 |
| 15/07/2018 | 3 |
| 15/07/2018 | 2.9 |
| 15/07/2018 | 2.6 |
| 15/07/2018 | 2.5 |
| 15/07/2018 | 2.7 |
| 15/07/2018 | 2.6 |
| 15/07/2018 | 2.9 |
| 15/07/2018 | 3.6 |
| 15/07/2018 | 3.9 |
| 15/07/2018 | 4.3 |
| 15/07/2018 | 4.3 |
| 15/07/2018 | 4.3 |
| 15/07/2018 | 4.3 |
| 15/07/2018 | 4.2 |
| 15/07/2018 | 3.9 |
| 15/07/2018 | 3.7 |
| 15/07/2018 | 4.2 |
| 15/07/2018 | 4.3 |
| 15/07/2018 | 4.7 |
| 15/07/2018 | 3.9 |
| 15/07/2018 | 3.8 |
| 15/07/2018 | 4 |
| 15/07/2018 | 3.5 |
| 16/07/2018 | 3.1 |
| 16/07/2018 | 3 |
| 16/07/2018 | 3 |
| 16/07/2018 | 2.9 |
| 16/07/2018 | 3 |
| 16/07/2018 | 3.2 |
| 16/07/2018 | 4 |
| 16/07/2018 | 4.7 |
| 16/07/2018 | 5.2 |
| 16/07/2018 | 5.8 |
| 16/07/2018 | 6 |
| 16/07/2018 | 6 |
| 16/07/2018 | 6.2 |
| 16/07/2018 | 5.9 |
| 16/07/2018 | 5.9 |
| 16/07/2018 | 5.9 |
| 16/07/2018 | 5.3 |
| 16/07/2018 | 5.4 |
| 16/07/2018 | 6.1 |
| 16/07/2018 | 6.1 |
| 16/07/2018 | 5 |
| 16/07/2018 | 4.5 |
| 16/07/2018 | 4.3 |
| 16/07/2018 | 3.6 |
| 17/07/2018 | 3.3 |
| 17/07/2018 | 3.1 |
| 17/07/2018 | 3 |
| 17/07/2018 | 2.9 |
| 17/07/2018 | 3 |
| 17/07/2018 | 3.2 |
| 17/07/2018 | 3.9 |
| 17/07/2018 | 4.6 |
| 17/07/2018 | 5.6 |
| 17/07/2018 | 5.6 |
| 17/07/2018 | 6.3 |
| 17/07/2018 | 6.2 |
| 17/07/2018 | 6.5 |
| 17/07/2018 | 6.1 |
| 17/07/2018 | 6 |
| 17/07/2018 | 6.1 |
| 17/07/2018 | 5.6 |
| 17/07/2018 | 5.7 |
| 17/07/2018 | 6.3 |
| 17/07/2018 | 6.2 |
| 17/07/2018 | 5.2 |
| 17/07/2018 | 4.7 |
| 17/07/2018 | 4.4 |
| 17/07/2018 | 3.7 |
| 18/07/2018 | 3.4 |
| 18/07/2018 | 3.1 |
| 18/07/2018 | 3.1 |
| 18/07/2018 | 3 |
| 18/07/2018 | 3 |
| 18/07/2018 | 3.2 |
| 18/07/2018 | 4 |
| 18/07/2018 | 4.7 |
| 18/07/2018 | 5.7 |
| 18/07/2018 | 5.7 |
| 18/07/2018 | 6.4 |
| 18/07/2018 | 6.4 |
| 18/07/2018 | 6.5 |
| 18/07/2018 | 6.1 |
| 18/07/2018 | 6.1 |
| 18/07/2018 | 6.1 |
| 18/07/2018 | 5.6 |
| 18/07/2018 | 5.6 |
| 18/07/2018 | 6.1 |
| 18/07/2018 | 6.1 |
| 18/07/2018 | 5.1 |
| 18/07/2018 | 4.6 |
| 18/07/2018 | 4.4 |
| 18/07/2018 | 3.7 |
| 19/07/2018 | 3.5 |
| 19/07/2018 | 3.2 |
| 19/07/2018 | 3.1 |
| 19/07/2018 | 3 |
| 19/07/2018 | 3 |
| 19/07/2018 | 3.2 |
| 19/07/2018 | 3.9 |
| 19/07/2018 | 4.7 |
| 19/07/2018 | 5.6 |
| 19/07/2018 | 5.6 |
| 19/07/2018 | 6.3 |
| 19/07/2018 | 6.2 |
| 19/07/2018 | 6.4 |
| 19/07/2018 | 6.1 |
| 19/07/2018 | 6 |
| 19/07/2018 | 6 |
| 19/07/2018 | 5.5 |
| 19/07/2018 | 5.6 |
| 19/07/2018 | 6.2 |
| 19/07/2018 | 6.1 |
| 19/07/2018 | 5.2 |
| 19/07/2018 | 4.7 |
| 19/07/2018 | 4.5 |
| 19/07/2018 | 3.8 |
| 20/07/2018 | 3.5 |
| 20/07/2018 | 3.2 |
| 20/07/2018 | 3.1 |
| 20/07/2018 | 3 |
| 20/07/2018 | 3.1 |
| 20/07/2018 | 3.2 |
| 20/07/2018 | 3.9 |
| 20/07/2018 | 4.5 |
| 20/07/2018 | 5.5 |
| 20/07/2018 | 5.6 |
| 20/07/2018 | 6.2 |
| 20/07/2018 | 6.2 |
| 20/07/2018 | 6.2 |
| 20/07/2018 | 6 |
| 20/07/2018 | 5.8 |
| 20/07/2018 | 5.7 |
| 20/07/2018 | 5.2 |
| 20/07/2018 | 5.6 |
| 20/07/2018 | 5.4 |
| 20/07/2018 | 5.8 |
| 20/07/2018 | 5 |
| 20/07/2018 | 4.2 |
| 20/07/2018 | 4.2 |
| 20/07/2018 | 3.9 |
| 21/07/2018 | 3.2 |
| 21/07/2018 | 3.1 |
| 21/07/2018 | 3 |
| 21/07/2018 | 2.7 |
| 21/07/2018 | 2.6 |
| 21/07/2018 | 2.6 |
| 21/07/2018 | 2.9 |
| 21/07/2018 | 3.2 |
| 21/07/2018 | 4 |
| 21/07/2018 | 4.3 |
| 21/07/2018 | 4.6 |
| 21/07/2018 | 4.8 |
| 21/07/2018 | 4.8 |
| 21/07/2018 | 4.7 |
| 21/07/2018 | 4.5 |
| 21/07/2018 | 4.6 |
| 21/07/2018 | 4.2 |
| 21/07/2018 | 4.3 |
| 21/07/2018 | 4.6 |
| 21/07/2018 | 4.5 |
| 21/07/2018 | 4 |
| 21/07/2018 | 3.8 |
| 21/07/2018 | 3.9 |
| 21/07/2018 | 3.4 |
| 22/07/2018 | 3 |
| 22/07/2018 | 3 |
| 22/07/2018 | 2.9 |
| 22/07/2018 | 2.7 |
| 22/07/2018 | 2.5 |
| 22/07/2018 | 2.3 |
| 22/07/2018 | 2.7 |
| 22/07/2018 | 2.9 |
| 22/07/2018 | 3.5 |
| 22/07/2018 | 3.9 |
| 22/07/2018 | 4.2 |
| 22/07/2018 | 4.3 |
| 22/07/2018 | 4.2 |
| 22/07/2018 | 4.3 |
| 22/07/2018 | 4.2 |
| 22/07/2018 | 3.9 |
| 22/07/2018 | 3.7 |
| 22/07/2018 | 3.7 |
| 22/07/2018 | 4.2 |
| 22/07/2018 | 4.5 |
| 22/07/2018 | 4.1 |
| 22/07/2018 | 4 |
| 22/07/2018 | 3.9 |
| 22/07/2018 | 3.4 |
| 23/07/2018 | 3 |
| 23/07/2018 | 2.9 |
| 23/07/2018 | 3 |
| 23/07/2018 | 2.9 |
| 23/07/2018 | 3 |
| 23/07/2018 | 3.3 |
| 23/07/2018 | 3.6 |
| 23/07/2018 | 4.7 |
| 23/07/2018 | 5.2 |
| 23/07/2018 | 5.8 |
| 23/07/2018 | 5.9 |
| 23/07/2018 | 5.9 |
| 23/07/2018 | 6.2 |
| 23/07/2018 | 5.9 |
| 23/07/2018 | 5.9 |
| 23/07/2018 | 5.9 |
| 23/07/2018 | 5.4 |
| 23/07/2018 | 5.4 |
| 23/07/2018 | 5.9 |
| 23/07/2018 | 5.9 |
| 23/07/2018 | 5.2 |
| 23/07/2018 | 4.7 |
| 23/07/2018 | 4.3 |
| 23/07/2018 | 3.5 |
| 24/07/2018 | 3.2 |
| 24/07/2018 | 3 |
| 24/07/2018 | 3 |
| 24/07/2018 | 2.9 |
| 24/07/2018 | 3 |
| 24/07/2018 | 3.3 |
| 24/07/2018 | 3.9 |
| 24/07/2018 | 4.6 |
| 24/07/2018 | 5.1 |
| 24/07/2018 | 5.6 |
| 24/07/2018 | 6.2 |
| 24/07/2018 | 6.2 |
| 24/07/2018 | 6.4 |
| 24/07/2018 | 6.1 |
| 24/07/2018 | 6 |
| 24/07/2018 | 6.1 |
| 24/07/2018 | 5.6 |
| 24/07/2018 | 5.6 |
| 24/07/2018 | 5.7 |
| 24/07/2018 | 5.6 |
| 24/07/2018 | 5.3 |
| 24/07/2018 | 4.8 |
| 24/07/2018 | 4.3 |
| 24/07/2018 | 3.6 |
| 25/07/2018 | 3.4 |
| 25/07/2018 | 3.1 |
| 25/07/2018 | 3.1 |
| 25/07/2018 | 3 |
| 25/07/2018 | 3.1 |
| 25/07/2018 | 3.3 |
| 25/07/2018 | 4 |
| 25/07/2018 | 4.6 |
| 25/07/2018 | 5.2 |
| 25/07/2018 | 5.7 |
| 25/07/2018 | 5.8 |
| 25/07/2018 | 6.3 |
| 25/07/2018 | 6.5 |
| 25/07/2018 | 6.1 |
| 25/07/2018 | 6.1 |
| 25/07/2018 | 6.1 |
| 25/07/2018 | 5.6 |
| 25/07/2018 | 5.6 |
| 25/07/2018 | 6 |
| 25/07/2018 | 5.9 |
| 25/07/2018 | 5.3 |
| 25/07/2018 | 4.8 |
| 25/07/2018 | 4.4 |
| 25/07/2018 | 3.6 |
| 26/07/2018 | 3.4 |
| 26/07/2018 | 3.2 |
| 26/07/2018 | 3.1 |
| 26/07/2018 | 3 |
| 26/07/2018 | 3.1 |
| 26/07/2018 | 3.3 |
| 26/07/2018 | 4 |
| 26/07/2018 | 4.6 |
| 26/07/2018 | 5.1 |
| 26/07/2018 | 5.6 |
| 26/07/2018 | 6.2 |
| 26/07/2018 | 6.2 |
| 26/07/2018 | 6.4 |
| 26/07/2018 | 6.1 |
| 26/07/2018 | 6 |
| 26/07/2018 | 6 |
| 26/07/2018 | 5.5 |
| 26/07/2018 | 5.6 |
| 26/07/2018 | 5.5 |
| 26/07/2018 | 5.5 |
| 26/07/2018 | 5.3 |
| 26/07/2018 | 4.9 |
| 26/07/2018 | 4.4 |
| 26/07/2018 | 3.7 |
| 27/07/2018 | 3.5 |
| 27/07/2018 | 3.2 |
| 27/07/2018 | 3.1 |
| 27/07/2018 | 3 |
| 27/07/2018 | 3.1 |
| 27/07/2018 | 3.3 |
| 27/07/2018 | 3.9 |
| 27/07/2018 | 4.5 |
| 27/07/2018 | 5 |
| 27/07/2018 | 5.5 |
| 27/07/2018 | 5.7 |
| 27/07/2018 | 6.1 |
| 27/07/2018 | 6.1 |
| 27/07/2018 | 6 |
| 27/07/2018 | 5.8 |
| 27/07/2018 | 5.7 |
| 27/07/2018 | 5.3 |
| 27/07/2018 | 5.1 |
| 27/07/2018 | 5.3 |
| 27/07/2018 | 5.2 |
| 27/07/2018 | 4.7 |
| 27/07/2018 | 4.3 |
| 27/07/2018 | 4.1 |
| 27/07/2018 | 3.8 |
| 28/07/2018 | 3.1 |
| 28/07/2018 | 3 |
| 28/07/2018 | 3 |
| 28/07/2018 | 2.7 |
| 28/07/2018 | 2.6 |
| 28/07/2018 | 2.7 |
| 28/07/2018 | 3 |
| 28/07/2018 | 3.2 |
| 28/07/2018 | 4 |
| 28/07/2018 | 4.3 |
| 28/07/2018 | 4.5 |
| 28/07/2018 | 4.7 |
| 28/07/2018 | 4.8 |
| 28/07/2018 | 4.7 |
| 28/07/2018 | 4.5 |
| 28/07/2018 | 4.6 |
| 28/07/2018 | 4.3 |
| 28/07/2018 | 4.3 |
| 28/07/2018 | 4.5 |
| 28/07/2018 | 4.4 |
| 28/07/2018 | 4.1 |
| 28/07/2018 | 4 |
| 28/07/2018 | 3.8 |
| 28/07/2018 | 3.3 |
| 29/07/2018 | 3 |
| 29/07/2018 | 3 |
| 29/07/2018 | 2.9 |
| 29/07/2018 | 2.7 |
| 29/07/2018 | 2.6 |
| 29/07/2018 | 2.4 |
| 29/07/2018 | 2.7 |
| 29/07/2018 | 2.9 |
| 29/07/2018 | 3 |
| 29/07/2018 | 3.8 |
| 29/07/2018 | 3.7 |
| 29/07/2018 | 4.2 |
| 29/07/2018 | 4.2 |
| 29/07/2018 | 4.3 |
| 29/07/2018 | 4.2 |
| 29/07/2018 | 3.9 |
| 29/07/2018 | 3.8 |
| 29/07/2018 | 3.7 |
| 29/07/2018 | 4.1 |
| 29/07/2018 | 3.9 |
| 29/07/2018 | 4.2 |
| 29/07/2018 | 4.1 |
| 29/07/2018 | 3.9 |
| 29/07/2018 | 3.3 |
| 30/07/2018 | 3 |
| 30/07/2018 | 2.9 |
| 30/07/2018 | 2.5 |
| 30/07/2018 | 2.9 |
| 30/07/2018 | 3.1 |
| 30/07/2018 | 3.4 |
| 30/07/2018 | 3.6 |
| 30/07/2018 | 4.7 |
| 30/07/2018 | 5.1 |
| 30/07/2018 | 5.7 |
| 30/07/2018 | 5.9 |
| 30/07/2018 | 5.9 |
| 30/07/2018 | 6.2 |
| 30/07/2018 | 5.9 |
| 30/07/2018 | 5.9 |
| 30/07/2018 | 5.9 |
| 30/07/2018 | 5.4 |
| 30/07/2018 | 5.4 |
| 30/07/2018 | 5.3 |
| 30/07/2018 | 5.3 |
| 30/07/2018 | 5.3 |
| 30/07/2018 | 4.9 |
| 30/07/2018 | 4.2 |
| 30/07/2018 | 3.4 |
| 31/07/2018 | 3.2 |
| 31/07/2018 | 3 |
| 31/07/2018 | 3 |
| 31/07/2018 | 2.9 |
| 31/07/2018 | 3.1 |
| 31/07/2018 | 3.4 |
| 31/07/2018 | 4 |
| 31/07/2018 | 4.5 |
| 31/07/2018 | 5 |
| 31/07/2018 | 5.5 |
| 31/07/2018 | 6.1 |
| 31/07/2018 | 6.1 |
| 31/07/2018 | 6.4 |
| 31/07/2018 | 6 |
| 31/07/2018 | 6 |
| 31/07/2018 | 5.6 |
| 31/07/2018 | 5.6 |
| 31/07/2018 | 5.6 |
| 31/07/2018 | 5.5 |
| 31/07/2018 | 5.5 |
| 31/07/2018 | 5 |
| 31/07/2018 | 5 |
| 31/07/2018 | 4.3 |
| 31/07/2018 | 3.5 |
| 01/08/2018 | 3.3 |
| 01/08/2018 | 3.1 |
| 01/08/2018 | 3.1 |
| 01/08/2018 | 3 |
| 01/08/2018 | 3.1 |
| 01/08/2018 | 3.4 |
| 01/08/2018 | 4 |
| 01/08/2018 | 4.6 |
| 01/08/2018 | 5.1 |
| 01/08/2018 | 5.6 |
| 01/08/2018 | 5.8 |
| 01/08/2018 | 6.2 |
| 01/08/2018 | 5.9 |
| 01/08/2018 | 6.1 |
| 01/08/2018 | 6.1 |
| 01/08/2018 | 6.1 |
| 01/08/2018 | 5.6 |
| 01/08/2018 | 5.6 |
| 01/08/2018 | 5.3 |
| 01/08/2018 | 5.3 |
| 01/08/2018 | 4.9 |
| 01/08/2018 | 5 |
| 01/08/2018 | 4.3 |
| 01/08/2018 | 3.5 |
| 02/08/2018 | 3.4 |
| 02/08/2018 | 3.1 |
| 02/08/2018 | 3.1 |
| 02/08/2018 | 3 |
| 02/08/2018 | 3.1 |
| 02/08/2018 | 3.5 |
| 02/08/2018 | 4 |
| 02/08/2018 | 4.6 |
| 02/08/2018 | 5 |
| 02/08/2018 | 5.5 |
| 02/08/2018 | 6.1 |
| 02/08/2018 | 6.1 |
| 02/08/2018 | 6.4 |
| 02/08/2018 | 6 |
| 02/08/2018 | 6 |
| 02/08/2018 | 6 |
| 02/08/2018 | 5.6 |
| 02/08/2018 | 5.5 |
| 02/08/2018 | 5.4 |
| 02/08/2018 | 5.4 |
| 02/08/2018 | 5 |
| 02/08/2018 | 5 |
| 02/08/2018 | 4.3 |
| 02/08/2018 | 3.6 |
| 03/08/2018 | 3.4 |
| 03/08/2018 | 3.2 |
| 03/08/2018 | 2.6 |
| 03/08/2018 | 3 |
| 03/08/2018 | 3.2 |
| 03/08/2018 | 3.4 |
| 03/08/2018 | 4 |
| 03/08/2018 | 4.5 |
| 03/08/2018 | 5 |
| 03/08/2018 | 5.5 |
| 03/08/2018 | 5.6 |
| 03/08/2018 | 6 |
| 03/08/2018 | 6.1 |
| 03/08/2018 | 6 |
| 03/08/2018 | 5.8 |
| 03/08/2018 | 5.7 |
| 03/08/2018 | 5.3 |
| 03/08/2018 | 5.1 |
| 03/08/2018 | 5.2 |
| 03/08/2018 | 5 |
| 03/08/2018 | 4.8 |
| 03/08/2018 | 4.5 |
| 03/08/2018 | 4.1 |
| 03/08/2018 | 3.7 |
| 04/08/2018 | 3.1 |
| 04/08/2018 | 3 |
| 04/08/2018 | 3 |
| 04/08/2018 | 2.7 |
| 04/08/2018 | 2.7 |
| 04/08/2018 | 2.8 |
| 04/08/2018 | 3 |
| 04/08/2018 | 3.2 |
| 04/08/2018 | 4 |
| 04/08/2018 | 4.2 |
| 04/08/2018 | 4.5 |
| 04/08/2018 | 4.7 |
| 04/08/2018 | 4.7 |
| 04/08/2018 | 4.6 |
| 04/08/2018 | 4.5 |
| 04/08/2018 | 4.6 |
| 04/08/2018 | 4.3 |
| 04/08/2018 | 4.3 |
| 04/08/2018 | 3.9 |
| 04/08/2018 | 4.3 |
| 04/08/2018 | 4.3 |
| 04/08/2018 | 4.1 |
| 04/08/2018 | 3.7 |
| 04/08/2018 | 3.2 |
| 05/08/2018 | 2.9 |
| 05/08/2018 | 3 |
| 05/08/2018 | 2.9 |
| 05/08/2018 | 2.7 |
| 05/08/2018 | 2.6 |
| 05/08/2018 | 2.4 |
| 05/08/2018 | 2.7 |
| 05/08/2018 | 2.9 |
| 05/08/2018 | 3 |
| 05/08/2018 | 3.8 |
| 05/08/2018 | 3.7 |
| 05/08/2018 | 4.2 |
| 05/08/2018 | 4.2 |
| 05/08/2018 | 4.3 |
| 05/08/2018 | 4.2 |
| 05/08/2018 | 3.9 |
| 05/08/2018 | 3.8 |
| 05/08/2018 | 3.6 |
| 05/08/2018 | 4 |
| 05/08/2018 | 3.8 |
| 05/08/2018 | 3.9 |
| 05/08/2018 | 4.2 |
| 05/08/2018 | 3.8 |
| 05/08/2018 | 3.2 |
| 06/08/2018 | 2.9 |
| 06/08/2018 | 2.9 |
| 06/08/2018 | 2.5 |
| 06/08/2018 | 2.9 |
| 06/08/2018 | 3.1 |
| 06/08/2018 | 3 |
| 06/08/2018 | 3.7 |
| 06/08/2018 | 4.2 |
| 06/08/2018 | 5.1 |
| 06/08/2018 | 5.2 |
| 06/08/2018 | 5.8 |
| 06/08/2018 | 5.8 |
| 06/08/2018 | 6.1 |
| 06/08/2018 | 5.9 |
| 06/08/2018 | 5.9 |
| 06/08/2018 | 5.9 |
| 06/08/2018 | 5.4 |
| 06/08/2018 | 5.3 |
| 06/08/2018 | 5.1 |
| 06/08/2018 | 5.2 |
| 06/08/2018 | 5 |
| 06/08/2018 | 5 |
| 06/08/2018 | 4.1 |
| 06/08/2018 | 3.3 |
| 07/08/2018 | 3.1 |
| 07/08/2018 | 3 |
| 07/08/2018 | 3 |
| 07/08/2018 | 2.9 |
| 07/08/2018 | 3.1 |
| 07/08/2018 | 3.5 |
| 07/08/2018 | 3.5 |
| 07/08/2018 | 4.5 |
| 07/08/2018 | 5 |
| 07/08/2018 | 5.5 |
| 07/08/2018 | 5.6 |
| 07/08/2018 | 6.1 |
| 07/08/2018 | 5.8 |
| 07/08/2018 | 6 |
| 07/08/2018 | 6 |
| 07/08/2018 | 5.6 |
| 07/08/2018 | 5.6 |
| 07/08/2018 | 5.1 |
| 07/08/2018 | 5.4 |
| 07/08/2018 | 4.8 |
| 07/08/2018 | 5.2 |
| 07/08/2018 | 4.7 |
| 07/08/2018 | 4.2 |
| 07/08/2018 | 3.4 |
| 08/08/2018 | 3.3 |
| 08/08/2018 | 3.1 |
| 08/08/2018 | 3.1 |
| 08/08/2018 | 3 |
| 08/08/2018 | 3.2 |
| 08/08/2018 | 3.5 |
| 08/08/2018 | 3.6 |
| 08/08/2018 | 4.6 |
| 08/08/2018 | 5.1 |
| 08/08/2018 | 5.6 |
| 08/08/2018 | 5.7 |
| 08/08/2018 | 6.2 |
| 08/08/2018 | 5.9 |
| 08/08/2018 | 6 |
| 08/08/2018 | 6 |
| 08/08/2018 | 6.1 |
| 08/08/2018 | 5.7 |
| 08/08/2018 | 5.5 |
| 08/08/2018 | 5.2 |
| 08/08/2018 | 5.2 |
| 08/08/2018 | 5.1 |
| 08/08/2018 | 5.1 |
| 08/08/2018 | 4.2 |
| 08/08/2018 | 3.4 |
| 09/08/2018 | 3.3 |
| 09/08/2018 | 3.1 |
| 09/08/2018 | 3.1 |
| 09/08/2018 | 3 |
| 09/08/2018 | 3.2 |
| 09/08/2018 | 3.6 |
| 09/08/2018 | 3.6 |
| 09/08/2018 | 4.6 |
| 09/08/2018 | 5 |
| 09/08/2018 | 5.5 |
| 09/08/2018 | 5.6 |
| 09/08/2018 | 6.1 |
| 09/08/2018 | 5.8 |
| 09/08/2018 | 6 |
| 09/08/2018 | 6 |
| 09/08/2018 | 6 |
| 09/08/2018 | 5.6 |
| 09/08/2018 | 5.5 |
| 09/08/2018 | 5.3 |
| 09/08/2018 | 4.7 |
| 09/08/2018 | 5.2 |
| 09/08/2018 | 4.7 |
| 09/08/2018 | 4.2 |
| 09/08/2018 | 3.5 |
| 10/08/2018 | 3.4 |
| 10/08/2018 | 3.2 |
| 10/08/2018 | 2.6 |
| 10/08/2018 | 3 |
| 10/08/2018 | 3.2 |
| 10/08/2018 | 3.6 |
| 10/08/2018 | 3.5 |
| 10/08/2018 | 4.4 |
| 10/08/2018 | 4.9 |
| 10/08/2018 | 5.4 |
| 10/08/2018 | 5.6 |
| 10/08/2018 | 6 |
| 10/08/2018 | 6 |
| 10/08/2018 | 5.9 |
| 10/08/2018 | 5.8 |
| 10/08/2018 | 5.7 |
| 10/08/2018 | 5.3 |
| 10/08/2018 | 5 |
| 10/08/2018 | 5 |
| 10/08/2018 | 4.4 |
| 10/08/2018 | 5 |
| 10/08/2018 | 4.7 |
| 10/08/2018 | 4 |
| 10/08/2018 | 3.6 |
| 11/08/2018 | 3 |
| 11/08/2018 | 3 |
| 11/08/2018 | 2.9 |
| 11/08/2018 | 2.7 |
| 11/08/2018 | 2.7 |
| 11/08/2018 | 2.8 |
| 11/08/2018 | 3 |
| 11/08/2018 | 3.2 |
| 11/08/2018 | 3.4 |
| 11/08/2018 | 4.2 |
| 11/08/2018 | 4.4 |
| 11/08/2018 | 4.6 |
| 11/08/2018 | 4.7 |
| 11/08/2018 | 4.6 |
| 11/08/2018 | 4.5 |
| 11/08/2018 | 4.6 |
| 11/08/2018 | 4.3 |
| 11/08/2018 | 4.2 |
| 11/08/2018 | 3.7 |
| 11/08/2018 | 3.6 |
| 11/08/2018 | 3.9 |
| 11/08/2018 | 4.3 |
| 11/08/2018 | 3.6 |
| 11/08/2018 | 3.1 |
| 12/08/2018 | 2.9 |
| 12/08/2018 | 2.9 |
| 12/08/2018 | 2.4 |
| 12/08/2018 | 2.7 |
| 12/08/2018 | 2.6 |
| 12/08/2018 | 2.5 |
| 12/08/2018 | 2.3 |
| 12/08/2018 | 2.9 |
| 12/08/2018 | 3 |
| 12/08/2018 | 3.2 |
| 12/08/2018 | 3.6 |
| 12/08/2018 | 4.1 |
| 12/08/2018 | 4.1 |
| 12/08/2018 | 4.3 |
| 12/08/2018 | 4.2 |
| 12/08/2018 | 3.9 |
| 12/08/2018 | 3.8 |
| 12/08/2018 | 3.6 |
| 12/08/2018 | 3.4 |
| 12/08/2018 | 3.2 |
| 12/08/2018 | 4 |
| 12/08/2018 | 3.9 |
| 12/08/2018 | 3.7 |
| 12/08/2018 | 3.1 |
| 13/08/2018 | 2.9 |
| 13/08/2018 | 2.9 |
| 13/08/2018 | 2.5 |
| 13/08/2018 | 2.9 |
| 13/08/2018 | 3.2 |
| 13/08/2018 | 3.1 |
| 13/08/2018 | 3.7 |
| 13/08/2018 | 4.1 |
| 13/08/2018 | 5.1 |
| 13/08/2018 | 5.1 |
| 13/08/2018 | 5.8 |
| 13/08/2018 | 5.8 |
| 13/08/2018 | 6.1 |
| 13/08/2018 | 5.8 |
| 13/08/2018 | 5.9 |
| 13/08/2018 | 5.9 |
| 13/08/2018 | 5.4 |
| 13/08/2018 | 5.3 |
| 13/08/2018 | 5 |
| 13/08/2018 | 4.6 |
| 13/08/2018 | 5.2 |
| 13/08/2018 | 4.7 |
| 13/08/2018 | 4 |
| 13/08/2018 | 3.2 |
| 14/08/2018 | 3.1 |
| 14/08/2018 | 3 |
| 14/08/2018 | 3 |
| 14/08/2018 | 2.9 |
| 14/08/2018 | 3.2 |
| 14/08/2018 | 3.6 |
| 14/08/2018 | 3.6 |
| 14/08/2018 | 4.5 |
| 14/08/2018 | 4.9 |
| 14/08/2018 | 5.4 |
| 14/08/2018 | 5.5 |
| 14/08/2018 | 6 |
| 14/08/2018 | 5.8 |
| 14/08/2018 | 6 |
| 14/08/2018 | 6 |
| 14/08/2018 | 5.6 |
| 14/08/2018 | 5.7 |
| 14/08/2018 | 5 |
| 14/08/2018 | 4.7 |
| 14/08/2018 | 4.7 |
| 14/08/2018 | 4.9 |
| 14/08/2018 | 4.8 |
| 14/08/2018 | 4.1 |
| 14/08/2018 | 3.3 |
| 15/08/2018 | 3.2 |
| 15/08/2018 | 3.1 |
| 15/08/2018 | 3.1 |
| 15/08/2018 | 3 |
| 15/08/2018 | 3.2 |
| 15/08/2018 | 3.7 |
| 15/08/2018 | 3.6 |
| 15/08/2018 | 4.6 |
| 15/08/2018 | 5 |
| 15/08/2018 | 5.5 |
| 15/08/2018 | 5.7 |
| 15/08/2018 | 6.1 |
| 15/08/2018 | 5.8 |
| 15/08/2018 | 6 |
| 15/08/2018 | 6 |
| 15/08/2018 | 6.1 |
| 15/08/2018 | 5.7 |
| 15/08/2018 | 5.5 |
| 15/08/2018 | 5.1 |
| 15/08/2018 | 4.5 |
| 15/08/2018 | 5.3 |
| 15/08/2018 | 4.8 |
| 15/08/2018 | 4.1 |
| 15/08/2018 | 3.3 |
| 16/08/2018 | 3.3 |
| 16/08/2018 | 3.1 |
| 16/08/2018 | 2.6 |
| 16/08/2018 | 3 |
| 16/08/2018 | 3.2 |
| 16/08/2018 | 3.7 |
| 16/08/2018 | 3.6 |
| 16/08/2018 | 4.1 |
| 16/08/2018 | 4.9 |
| 16/08/2018 | 5.4 |
| 16/08/2018 | 5.5 |
| 16/08/2018 | 6 |
| 16/08/2018 | 5.8 |
| 16/08/2018 | 6 |
| 16/08/2018 | 6 |
| 16/08/2018 | 6 |
| 16/08/2018 | 5.6 |
| 16/08/2018 | 5.5 |
| 16/08/2018 | 4.6 |
| 16/08/2018 | 4.6 |
| 16/08/2018 | 4.9 |
| 16/08/2018 | 4.9 |
| 16/08/2018 | 4.2 |
| 16/08/2018 | 3.4 |
| 17/08/2018 | 3.3 |
| 17/08/2018 | 3.1 |
| 17/08/2018 | 2.6 |
| 17/08/2018 | 3 |
| 17/08/2018 | 3.3 |
| 17/08/2018 | 3.7 |
| 17/08/2018 | 3.5 |
| 17/08/2018 | 4.4 |
| 17/08/2018 | 4.9 |
| 17/08/2018 | 5.4 |
| 17/08/2018 | 5.5 |
| 17/08/2018 | 5.9 |
| 17/08/2018 | 6 |
| 17/08/2018 | 5.9 |
| 17/08/2018 | 5.8 |
| 17/08/2018 | 5.7 |
| 17/08/2018 | 5.4 |
| 17/08/2018 | 5 |
| 17/08/2018 | 4.4 |
| 17/08/2018 | 4.3 |
| 17/08/2018 | 4.7 |
| 17/08/2018 | 4.8 |
| 17/08/2018 | 3.9 |
| 17/08/2018 | 3.5 |
| 18/08/2018 | 3.1 |
| 18/08/2018 | 3.1 |
| 18/08/2018 | 3.1 |
| 18/08/2018 | 2.9 |
| 18/08/2018 | 2.9 |
| 18/08/2018 | 3.3 |
| 18/08/2018 | 3.2 |
| 18/08/2018 | 3.4 |
| 18/08/2018 | 3.6 |
| 18/08/2018 | 4.3 |
| 18/08/2018 | 4.5 |
| 18/08/2018 | 5.2 |
| 18/08/2018 | 4.7 |
| 18/08/2018 | 4.8 |
| 18/08/2018 | 4.7 |
| 18/08/2018 | 4.9 |
| 18/08/2018 | 4.8 |
| 18/08/2018 | 4.5 |
| 18/08/2018 | 3.6 |
| 18/08/2018 | 3.2 |
| 18/08/2018 | 4.6 |
| 18/08/2018 | 4.5 |
| 18/08/2018 | 3.9 |
| 18/08/2018 | 3.2 |
| 19/08/2018 | 2.9 |
| 19/08/2018 | 3 |
| 19/08/2018 | 3 |
| 19/08/2018 | 2.8 |
| 19/08/2018 | 2.8 |
| 19/08/2018 | 2.9 |
| 19/08/2018 | 2.9 |
| 19/08/2018 | 3.1 |
| 19/08/2018 | 3.1 |
| 19/08/2018 | 3.8 |
| 19/08/2018 | 4.1 |
| 19/08/2018 | 4.1 |
| 19/08/2018 | 4.1 |
| 19/08/2018 | 4.4 |
| 19/08/2018 | 4.4 |
| 19/08/2018 | 4.1 |
| 19/08/2018 | 4.2 |
| 19/08/2018 | 3.8 |
| 19/08/2018 | 3.3 |
| 19/08/2018 | 3.3 |
| 19/08/2018 | 4.6 |
| 19/08/2018 | 4.6 |
| 19/08/2018 | 4 |
| 19/08/2018 | 3.2 |
| 20/08/2018 | 2.9 |
| 20/08/2018 | 3 |
| 20/08/2018 | 3.1 |
| 20/08/2018 | 3.1 |
| 20/08/2018 | 3.4 |
| 20/08/2018 | 3.6 |
| 20/08/2018 | 4.2 |
| 20/08/2018 | 4.7 |
| 20/08/2018 | 5 |
| 20/08/2018 | 5.4 |
| 20/08/2018 | 6 |
| 20/08/2018 | 5.9 |
| 20/08/2018 | 6.2 |
| 20/08/2018 | 6.1 |
| 20/08/2018 | 6.3 |
| 20/08/2018 | 6.3 |
| 20/08/2018 | 6.1 |
| 20/08/2018 | 5.7 |
| 20/08/2018 | 4.6 |
| 20/08/2018 | 4.4 |
| 20/08/2018 | 5.5 |
| 20/08/2018 | 5.5 |
| 20/08/2018 | 4.3 |
| 20/08/2018 | 3.3 |
| 21/08/2018 | 3.2 |
| 21/08/2018 | 3.1 |
| 21/08/2018 | 3.1 |
| 21/08/2018 | 3.1 |
| 21/08/2018 | 3.4 |
| 21/08/2018 | 3.5 |
| 21/08/2018 | 4 |
| 21/08/2018 | 4.6 |
| 21/08/2018 | 5 |
| 21/08/2018 | 5.8 |
| 21/08/2018 | 5.7 |
| 21/08/2018 | 6.2 |
| 21/08/2018 | 6.4 |
| 21/08/2018 | 6.3 |
| 21/08/2018 | 6.4 |
| 21/08/2018 | 6.5 |
| 21/08/2018 | 6.3 |
| 21/08/2018 | 5.4 |
| 21/08/2018 | 4.9 |
| 21/08/2018 | 4.7 |
| 21/08/2018 | 5.7 |
| 21/08/2018 | 5.6 |
| 21/08/2018 | 4.4 |
| 21/08/2018 | 3.4 |
| 22/08/2018 | 3.3 |
| 22/08/2018 | 3.2 |
| 22/08/2018 | 3.2 |
| 22/08/2018 | 3.1 |
| 22/08/2018 | 3.4 |
| 22/08/2018 | 3.6 |
| 22/08/2018 | 4.1 |
| 22/08/2018 | 4.7 |
| 22/08/2018 | 5.1 |
| 22/08/2018 | 5.4 |
| 22/08/2018 | 5.9 |
| 22/08/2018 | 6.3 |
| 22/08/2018 | 6.5 |
| 22/08/2018 | 6.3 |
| 22/08/2018 | 6.4 |
| 22/08/2018 | 6.5 |
| 22/08/2018 | 6.3 |
| 22/08/2018 | 5.9 |
| 22/08/2018 | 4.8 |
| 22/08/2018 | 4.6 |
| 22/08/2018 | 5.6 |
| 22/08/2018 | 5.5 |
| 22/08/2018 | 4.4 |
| 22/08/2018 | 3.4 |
| 23/08/2018 | 3.3 |
| 23/08/2018 | 3.2 |
| 23/08/2018 | 3.2 |
| 23/08/2018 | 3.1 |
| 23/08/2018 | 3.4 |
| 23/08/2018 | 3.6 |
| 23/08/2018 | 4.1 |
| 23/08/2018 | 4.8 |
| 23/08/2018 | 5 |
| 23/08/2018 | 5.8 |
| 23/08/2018 | 5.8 |
| 23/08/2018 | 6.2 |
| 23/08/2018 | 6.5 |
| 23/08/2018 | 6.3 |
| 23/08/2018 | 6.3 |
| 23/08/2018 | 6.4 |
| 23/08/2018 | 6.2 |
| 23/08/2018 | 5.9 |
| 23/08/2018 | 5 |
| 23/08/2018 | 4.8 |
| 23/08/2018 | 5.7 |
| 23/08/2018 | 5.6 |
| 23/08/2018 | 4.4 |
| 23/08/2018 | 3.5 |
| 24/08/2018 | 3.4 |
| 24/08/2018 | 3.2 |
| 24/08/2018 | 3.2 |
| 24/08/2018 | 3.2 |
| 24/08/2018 | 3.4 |
| 24/08/2018 | 3.5 |
| 24/08/2018 | 4.1 |
| 24/08/2018 | 4.6 |
| 24/08/2018 | 5 |
| 24/08/2018 | 5.8 |
| 24/08/2018 | 5.8 |
| 24/08/2018 | 6.1 |
| 24/08/2018 | 6.2 |
| 24/08/2018 | 6.2 |
| 24/08/2018 | 6.1 |
| 24/08/2018 | 6.1 |
| 24/08/2018 | 5.9 |
| 24/08/2018 | 5.4 |
| 24/08/2018 | 4.8 |
| 24/08/2018 | 4.5 |
| 24/08/2018 | 5.5 |
| 24/08/2018 | 5 |
| 24/08/2018 | 4.2 |
| 24/08/2018 | 3.6 |
| 25/08/2018 | 3.1 |
| 25/08/2018 | 3.1 |
| 25/08/2018 | 3 |
| 25/08/2018 | 2.8 |
| 25/08/2018 | 2.9 |
| 25/08/2018 | 3.2 |
| 25/08/2018 | 2.8 |
| 25/08/2018 | 3 |
| 25/08/2018 | 3.7 |
| 25/08/2018 | 4.4 |
| 25/08/2018 | 4.5 |
| 25/08/2018 | 4.7 |
| 25/08/2018 | 4.7 |
| 25/08/2018 | 4.7 |
| 25/08/2018 | 4.7 |
| 25/08/2018 | 4.9 |
| 25/08/2018 | 4.7 |
| 25/08/2018 | 4.5 |
| 25/08/2018 | 4 |
| 25/08/2018 | 3.7 |
| 25/08/2018 | 4.8 |
| 25/08/2018 | 4.5 |
| 25/08/2018 | 3.9 |
| 25/08/2018 | 3.2 |
| 26/08/2018 | 2.9 |
| 26/08/2018 | 3 |
| 26/08/2018 | 3 |
| 26/08/2018 | 2.8 |
| 26/08/2018 | 2.8 |
| 26/08/2018 | 2.9 |
| 26/08/2018 | 2.5 |
| 26/08/2018 | 2.6 |
| 26/08/2018 | 3.2 |
| 26/08/2018 | 3.4 |
| 26/08/2018 | 4.2 |
| 26/08/2018 | 4.1 |
| 26/08/2018 | 4.1 |
| 26/08/2018 | 4.3 |
| 26/08/2018 | 4.3 |
| 26/08/2018 | 4.1 |
| 26/08/2018 | 4.1 |
| 26/08/2018 | 3.8 |
| 26/08/2018 | 3.6 |
| 26/08/2018 | 3.3 |
| 26/08/2018 | 4.3 |
| 26/08/2018 | 4.6 |
| 26/08/2018 | 3.9 |
| 26/08/2018 | 3.2 |
| 27/08/2018 | 2.9 |
| 27/08/2018 | 2.9 |
| 27/08/2018 | 3 |
| 27/08/2018 | 3 |
| 27/08/2018 | 3.3 |
| 27/08/2018 | 3.6 |
| 27/08/2018 | 3.8 |
| 27/08/2018 | 4.4 |
| 27/08/2018 | 5.2 |
| 27/08/2018 | 5.5 |
| 27/08/2018 | 6 |
| 27/08/2018 | 5.9 |
| 27/08/2018 | 6.2 |
| 27/08/2018 | 6.1 |
| 27/08/2018 | 6.2 |
| 27/08/2018 | 6.2 |
| 27/08/2018 | 5.9 |
| 27/08/2018 | 5.7 |
| 27/08/2018 | 5 |
| 27/08/2018 | 5.1 |
| 27/08/2018 | 5.8 |
| 27/08/2018 | 5.4 |
| 27/08/2018 | 4.3 |
| 27/08/2018 | 3.3 |
| 28/08/2018 | 3.1 |
| 28/08/2018 | 3 |
| 28/08/2018 | 3 |
| 28/08/2018 | 3 |
| 28/08/2018 | 3.3 |
| 28/08/2018 | 3.5 |
| 28/08/2018 | 4.2 |
| 28/08/2018 | 4.8 |
| 28/08/2018 | 5.1 |
| 28/08/2018 | 5.4 |
| 28/08/2018 | 5.8 |
| 28/08/2018 | 6.2 |
| 28/08/2018 | 6.4 |
| 28/08/2018 | 6.2 |
| 28/08/2018 | 6.3 |
| 28/08/2018 | 6.4 |
| 28/08/2018 | 6.2 |
| 28/08/2018 | 5.5 |
| 28/08/2018 | 4.8 |
| 28/08/2018 | 4.8 |
| 28/08/2018 | 5.5 |
| 28/08/2018 | 5 |
| 28/08/2018 | 4.3 |
| 28/08/2018 | 3.4 |
| 29/08/2018 | 3.3 |
| 29/08/2018 | 3.1 |
| 29/08/2018 | 3.1 |
| 29/08/2018 | 3.1 |
| 29/08/2018 | 3.3 |
| 29/08/2018 | 3.6 |
| 29/08/2018 | 4.3 |
| 29/08/2018 | 4.9 |
| 29/08/2018 | 5.2 |
| 29/08/2018 | 5.5 |
| 29/08/2018 | 6 |
| 29/08/2018 | 6.3 |
| 29/08/2018 | 6.5 |
| 29/08/2018 | 6.2 |
| 29/08/2018 | 6.3 |
| 29/08/2018 | 6.4 |
| 29/08/2018 | 6.1 |
| 29/08/2018 | 6 |
| 29/08/2018 | 5.2 |
| 29/08/2018 | 4.8 |
| 29/08/2018 | 5.9 |
| 29/08/2018 | 5.5 |
| 29/08/2018 | 4.4 |
| 29/08/2018 | 3.4 |
| 30/08/2018 | 3.3 |
| 30/08/2018 | 3.2 |
| 30/08/2018 | 3.1 |
| 30/08/2018 | 3.1 |
| 30/08/2018 | 3.3 |
| 30/08/2018 | 3.5 |
| 30/08/2018 | 4.3 |
| 30/08/2018 | 4.9 |
| 30/08/2018 | 5.2 |
| 30/08/2018 | 5.4 |
| 30/08/2018 | 5.8 |
| 30/08/2018 | 6.2 |
| 30/08/2018 | 6.4 |
| 30/08/2018 | 6.2 |
| 30/08/2018 | 6.3 |
| 30/08/2018 | 6.3 |
| 30/08/2018 | 6 |
| 30/08/2018 | 5.5 |
| 30/08/2018 | 5.4 |
| 30/08/2018 | 4.9 |
| 30/08/2018 | 5.5 |
| 30/08/2018 | 5 |
| 30/08/2018 | 4.4 |
| 30/08/2018 | 3.5 |
| 31/08/2018 | 3.4 |
| 31/08/2018 | 3.2 |
| 31/08/2018 | 3.2 |
| 31/08/2018 | 3.1 |
| 31/08/2018 | 3.4 |
| 31/08/2018 | 3.5 |
| 31/08/2018 | 4.2 |
| 31/08/2018 | 4.8 |
| 31/08/2018 | 5.1 |
| 31/08/2018 | 5.4 |
| 31/08/2018 | 5.8 |
| 31/08/2018 | 6.1 |
| 31/08/2018 | 6.2 |
| 31/08/2018 | 6.1 |
| 31/08/2018 | 6.1 |
| 31/08/2018 | 6 |
| 31/08/2018 | 5.8 |
| 31/08/2018 | 5.5 |
| 31/08/2018 | 4.7 |
| 31/08/2018 | 4.7 |
| 31/08/2018 | 5.3 |
| 31/08/2018 | 4.9 |
| 31/08/2018 | 4.2 |
| 31/08/2018 | 3.6 |
| 01/09/2018 | 3.1 |
| 01/09/2018 | 3 |
| 01/09/2018 | 3 |
| 01/09/2018 | 2.8 |
| 01/09/2018 | 2.8 |
| 01/09/2018 | 3.2 |
| 01/09/2018 | 2.9 |
| 01/09/2018 | 3.1 |
| 01/09/2018 | 3.8 |
| 01/09/2018 | 4.5 |
| 01/09/2018 | 4.6 |
| 01/09/2018 | 4.7 |
| 01/09/2018 | 4.7 |
| 01/09/2018 | 4.7 |
| 01/09/2018 | 4.6 |
| 01/09/2018 | 4.8 |
| 01/09/2018 | 4.6 |
| 01/09/2018 | 4.5 |
| 01/09/2018 | 3.8 |
| 01/09/2018 | 3.8 |
| 01/09/2018 | 4.5 |
| 01/09/2018 | 4.4 |
| 01/09/2018 | 3.8 |
| 01/09/2018 | 3.2 |
| 02/09/2018 | 2.9 |
| 02/09/2018 | 3 |
| 02/09/2018 | 3 |
| 02/09/2018 | 2.7 |
| 02/09/2018 | 2.7 |
| 02/09/2018 | 2.9 |
| 02/09/2018 | 2.5 |
| 02/09/2018 | 2.7 |
| 02/09/2018 | 3.3 |
| 02/09/2018 | 3.5 |
| 02/09/2018 | 3.7 |
| 02/09/2018 | 4.1 |
| 02/09/2018 | 4.1 |
| 02/09/2018 | 4.3 |
| 02/09/2018 | 4.2 |
| 02/09/2018 | 4 |
| 02/09/2018 | 4 |
| 02/09/2018 | 3.9 |
| 02/09/2018 | 3.9 |
| 02/09/2018 | 3.9 |
| 02/09/2018 | 4.6 |
| 02/09/2018 | 4.5 |
| 02/09/2018 | 3.9 |
| 02/09/2018 | 3.2 |
| 03/09/2018 | 2.9 |
| 03/09/2018 | 2.9 |
| 03/09/2018 | 2.5 |
| 03/09/2018 | 3 |
| 03/09/2018 | 2.8 |
| 03/09/2018 | 3.5 |
| 03/09/2018 | 3.9 |
| 03/09/2018 | 4.5 |
| 03/09/2018 | 5.3 |
| 03/09/2018 | 5.7 |
| 03/09/2018 | 5.6 |
| 03/09/2018 | 5.9 |
| 03/09/2018 | 6.2 |
| 03/09/2018 | 6 |
| 03/09/2018 | 6.1 |
| 03/09/2018 | 6.1 |
| 03/09/2018 | 5.8 |
| 03/09/2018 | 5.8 |
| 03/09/2018 | 5.4 |
| 03/09/2018 | 5.2 |
| 03/09/2018 | 5.6 |
| 03/09/2018 | 5.4 |
| 03/09/2018 | 4.2 |
| 03/09/2018 | 3.3 |
| 04/09/2018 | 3.1 |
| 04/09/2018 | 3 |
| 04/09/2018 | 3 |
| 04/09/2018 | 3 |
| 04/09/2018 | 3.2 |
| 04/09/2018 | 3.5 |
| 04/09/2018 | 4.3 |
| 04/09/2018 | 4.9 |
| 04/09/2018 | 5.2 |
| 04/09/2018 | 5.5 |
| 04/09/2018 | 5.9 |
| 04/09/2018 | 6.2 |
| 04/09/2018 | 6.4 |
| 04/09/2018 | 6.2 |
| 04/09/2018 | 6.2 |
| 04/09/2018 | 6.3 |
| 04/09/2018 | 6 |
| 04/09/2018 | 5.5 |
| 04/09/2018 | 5.2 |
| 04/09/2018 | 5.5 |
| 04/09/2018 | 5.7 |
| 04/09/2018 | 5 |
| 04/09/2018 | 4.3 |
| 04/09/2018 | 3.4 |
| 05/09/2018 | 3.3 |
| 05/09/2018 | 3.1 |
| 05/09/2018 | 3.1 |
| 05/09/2018 | 3 |
| 05/09/2018 | 3.3 |
| 05/09/2018 | 3.5 |
| 05/09/2018 | 4.4 |
| 05/09/2018 | 4.5 |
| 05/09/2018 | 5.3 |
| 05/09/2018 | 5.6 |
| 05/09/2018 | 6 |
| 05/09/2018 | 6.3 |
| 05/09/2018 | 6.5 |
| 05/09/2018 | 6.2 |
| 05/09/2018 | 6.3 |
| 05/09/2018 | 6.3 |
| 05/09/2018 | 6 |
| 05/09/2018 | 5.5 |
| 05/09/2018 | 5.1 |
| 05/09/2018 | 5.4 |
| 05/09/2018 | 5.7 |
| 05/09/2018 | 4.9 |
| 05/09/2018 | 4.3 |
| 05/09/2018 | 3.4 |
| 06/09/2018 | 3.3 |
| 06/09/2018 | 3.1 |
| 06/09/2018 | 3.1 |
| 06/09/2018 | 3.1 |
| 06/09/2018 | 3.3 |
| 06/09/2018 | 3.5 |
| 06/09/2018 | 3.9 |
| 06/09/2018 | 4.6 |
| 06/09/2018 | 5.3 |
| 06/09/2018 | 5.5 |
| 06/09/2018 | 5.9 |
| 06/09/2018 | 6.2 |
| 06/09/2018 | 6.4 |
| 06/09/2018 | 6.2 |
| 06/09/2018 | 6.2 |
| 06/09/2018 | 6.2 |
| 06/09/2018 | 5.9 |
| 06/09/2018 | 5.5 |
| 06/09/2018 | 5.3 |
| 06/09/2018 | 5.6 |
| 06/09/2018 | 5.8 |
| 06/09/2018 | 5 |
| 06/09/2018 | 4.4 |
| 06/09/2018 | 3.5 |
| 07/09/2018 | 3.4 |
| 07/09/2018 | 3.2 |
| 07/09/2018 | 2.6 |
| 07/09/2018 | 3.1 |
| 07/09/2018 | 3.3 |
| 07/09/2018 | 3.5 |
| 07/09/2018 | 4.3 |
| 07/09/2018 | 4.9 |
| 07/09/2018 | 5.2 |
| 07/09/2018 | 5.5 |
| 07/09/2018 | 5.9 |
| 07/09/2018 | 6.1 |
| 07/09/2018 | 6.2 |
| 07/09/2018 | 6.1 |
| 07/09/2018 | 6 |
| 07/09/2018 | 5.9 |
| 07/09/2018 | 5.6 |
| 07/09/2018 | 5.5 |
| 07/09/2018 | 5.1 |
| 07/09/2018 | 5.3 |
| 07/09/2018 | 5.5 |
| 07/09/2018 | 4.9 |
| 07/09/2018 | 4.2 |
| 07/09/2018 | 3.6 |
| 08/09/2018 | 3 |
| 08/09/2018 | 3 |
| 08/09/2018 | 3 |
| 08/09/2018 | 2.7 |
| 08/09/2018 | 2.8 |
| 08/09/2018 | 2.7 |
| 08/09/2018 | 3 |
| 08/09/2018 | 3.3 |
| 08/09/2018 | 4 |
| 08/09/2018 | 4.1 |
| 08/09/2018 | 4.6 |
| 08/09/2018 | 4.7 |
| 08/09/2018 | 4.7 |
| 08/09/2018 | 4.7 |
| 08/09/2018 | 4.5 |
| 08/09/2018 | 4.7 |
| 08/09/2018 | 4.5 |
| 08/09/2018 | 4.1 |
| 08/09/2018 | 4.1 |
| 08/09/2018 | 4.4 |
| 08/09/2018 | 4.8 |
| 08/09/2018 | 4.4 |
| 08/09/2018 | 3.8 |
| 08/09/2018 | 3.2 |
| 09/09/2018 | 2.9 |
| 09/09/2018 | 2.9 |
| 09/09/2018 | 2.9 |
| 09/09/2018 | 2.7 |
| 09/09/2018 | 2.7 |
| 09/09/2018 | 2.8 |
| 09/09/2018 | 2.6 |
| 09/09/2018 | 2.8 |
| 09/09/2018 | 3.4 |
| 09/09/2018 | 3.5 |
| 09/09/2018 | 3.7 |
| 09/09/2018 | 4.1 |
| 09/09/2018 | 4.1 |
| 09/09/2018 | 4.2 |
| 09/09/2018 | 4.2 |
| 09/09/2018 | 3.9 |
| 09/09/2018 | 3.9 |
| 09/09/2018 | 3.9 |
| 09/09/2018 | 3.7 |
| 09/09/2018 | 3.9 |
| 09/09/2018 | 4.3 |
| 09/09/2018 | 4.5 |
| 09/09/2018 | 3.9 |
| 09/09/2018 | 3.2 |
| 10/09/2018 | 2.9 |
| 10/09/2018 | 2.9 |
| 10/09/2018 | 2.5 |
| 10/09/2018 | 3 |
| 10/09/2018 | 2.7 |
| 10/09/2018 | 3.5 |
| 10/09/2018 | 4.1 |
| 10/09/2018 | 4.7 |
| 10/09/2018 | 5.5 |
| 10/09/2018 | 5.8 |
| 10/09/2018 | 5.6 |
| 10/09/2018 | 6 |
| 10/09/2018 | 6.2 |
| 10/09/2018 | 6 |
| 10/09/2018 | 6 |
| 10/09/2018 | 6 |
| 10/09/2018 | 5.7 |
| 10/09/2018 | 5.3 |
| 10/09/2018 | 5.3 |
| 10/09/2018 | 5.4 |
| 10/09/2018 | 5.8 |
| 10/09/2018 | 4.8 |
| 10/09/2018 | 4.2 |
| 10/09/2018 | 3.3 |
| 11/09/2018 | 3.1 |
| 11/09/2018 | 3 |
| 11/09/2018 | 3 |
| 11/09/2018 | 3 |
| 11/09/2018 | 3.2 |
| 11/09/2018 | 3.5 |
| 11/09/2018 | 3.9 |
| 11/09/2018 | 4.6 |
| 11/09/2018 | 5.4 |
| 11/09/2018 | 5.6 |
| 11/09/2018 | 5.9 |
| 11/09/2018 | 6.2 |
| 11/09/2018 | 6.4 |
| 11/09/2018 | 6.1 |
| 11/09/2018 | 6.2 |
| 11/09/2018 | 5.7 |
| 11/09/2018 | 5.9 |
| 11/09/2018 | 5.6 |
| 11/09/2018 | 5.6 |
| 11/09/2018 | 5.7 |
| 11/09/2018 | 5.5 |
| 11/09/2018 | 4.9 |
| 11/09/2018 | 4.3 |
| 11/09/2018 | 3.4 |
| 12/09/2018 | 3.2 |
| 12/09/2018 | 3.1 |
| 12/09/2018 | 3 |
| 12/09/2018 | 3 |
| 12/09/2018 | 3.2 |
| 12/09/2018 | 3.5 |
| 12/09/2018 | 4 |
| 12/09/2018 | 4.7 |
| 12/09/2018 | 5.5 |
| 12/09/2018 | 5.7 |
| 12/09/2018 | 6.1 |
| 12/09/2018 | 6.3 |
| 12/09/2018 | 6 |
| 12/09/2018 | 6.1 |
| 12/09/2018 | 6.2 |
| 12/09/2018 | 6.2 |
| 12/09/2018 | 5.9 |
| 12/09/2018 | 5.5 |
| 12/09/2018 | 5.5 |
| 12/09/2018 | 5.6 |
| 12/09/2018 | 5.9 |
| 12/09/2018 | 4.9 |
| 12/09/2018 | 4.3 |
| 12/09/2018 | 3.4 |
| 13/09/2018 | 3.3 |
| 13/09/2018 | 3.1 |
| 13/09/2018 | 3.1 |
| 13/09/2018 | 3 |
| 13/09/2018 | 3.2 |
| 13/09/2018 | 3.5 |
| 13/09/2018 | 4 |
| 13/09/2018 | 4.7 |
| 13/09/2018 | 5.4 |
| 13/09/2018 | 5.6 |
| 13/09/2018 | 6 |
| 13/09/2018 | 6.2 |
| 13/09/2018 | 6.4 |
| 13/09/2018 | 6.1 |
| 13/09/2018 | 6.1 |
| 13/09/2018 | 6.1 |
| 13/09/2018 | 5.8 |
| 13/09/2018 | 5.5 |
| 13/09/2018 | 5.7 |
| 13/09/2018 | 5.8 |
| 13/09/2018 | 5.5 |
| 13/09/2018 | 4.9 |
| 13/09/2018 | 4.3 |
| 13/09/2018 | 3.5 |
| 14/09/2018 | 3.3 |
| 14/09/2018 | 3.1 |
| 14/09/2018 | 2.6 |
| 14/09/2018 | 3 |
| 14/09/2018 | 3.2 |
| 14/09/2018 | 3.5 |
| 14/09/2018 | 3.9 |
| 14/09/2018 | 4.6 |
| 14/09/2018 | 5.4 |
| 14/09/2018 | 5.6 |
| 14/09/2018 | 5.9 |
| 14/09/2018 | 6.2 |
| 14/09/2018 | 6.2 |
| 14/09/2018 | 6 |
| 14/09/2018 | 5.9 |
| 14/09/2018 | 5.8 |
| 14/09/2018 | 5.5 |
| 14/09/2018 | 5.5 |
| 14/09/2018 | 5.4 |
| 14/09/2018 | 5.5 |
| 14/09/2018 | 5.3 |
| 14/09/2018 | 4.8 |
| 14/09/2018 | 4.1 |
| 14/09/2018 | 3.6 |
| 15/09/2018 | 3 |
| 15/09/2018 | 3 |
| 15/09/2018 | 2.9 |
| 15/09/2018 | 2.7 |
| 15/09/2018 | 2.7 |
| 15/09/2018 | 2.7 |
| 15/09/2018 | 3.1 |
| 15/09/2018 | 3.4 |
| 15/09/2018 | 4.1 |
| 15/09/2018 | 4.2 |
| 15/09/2018 | 4.7 |
| 15/09/2018 | 4.7 |
| 15/09/2018 | 4.7 |
| 15/09/2018 | 4.6 |
| 15/09/2018 | 4.5 |
| 15/09/2018 | 4.6 |
| 15/09/2018 | 4.4 |
| 15/09/2018 | 4.1 |
| 15/09/2018 | 4.5 |
| 15/09/2018 | 5 |
| 15/09/2018 | 4.5 |
| 15/09/2018 | 4.3 |
| 15/09/2018 | 3.8 |
| 15/09/2018 | 3.2 |
| 16/09/2018 | 2.8 |
| 16/09/2018 | 2.9 |
| 16/09/2018 | 2.4 |
| 16/09/2018 | 2.7 |
| 16/09/2018 | 2.6 |
| 16/09/2018 | 2.8 |
| 16/09/2018 | 2.7 |
| 16/09/2018 | 2.9 |
| 16/09/2018 | 3.4 |
| 16/09/2018 | 3.6 |
| 16/09/2018 | 3.8 |
| 16/09/2018 | 4.2 |
| 16/09/2018 | 4.1 |
| 16/09/2018 | 4.2 |
| 16/09/2018 | 4.1 |
| 16/09/2018 | 3.9 |
| 16/09/2018 | 3.8 |
| 16/09/2018 | 3.9 |
| 16/09/2018 | 4.1 |
| 16/09/2018 | 4.5 |
| 16/09/2018 | 4.5 |
| 16/09/2018 | 3.9 |
| 16/09/2018 | 3.8 |
| 16/09/2018 | 3.2 |
| 17/09/2018 | 2.9 |
| 17/09/2018 | 2.9 |
| 17/09/2018 | 2.4 |
| 17/09/2018 | 2.4 |
| 17/09/2018 | 2.7 |
| 17/09/2018 | 3.5 |
| 17/09/2018 | 4.2 |
| 17/09/2018 | 4.8 |
| 17/09/2018 | 5.1 |
| 17/09/2018 | 5.4 |
| 17/09/2018 | 5.7 |
| 17/09/2018 | 6 |
| 17/09/2018 | 6.2 |
| 17/09/2018 | 5.9 |
| 17/09/2018 | 5.9 |
| 17/09/2018 | 5.9 |
| 17/09/2018 | 5.6 |
| 17/09/2018 | 5.4 |
| 17/09/2018 | 5.7 |
| 17/09/2018 | 6.1 |
| 17/09/2018 | 5.6 |
| 17/09/2018 | 4.8 |
| 17/09/2018 | 4.2 |
| 17/09/2018 | 3.3 |
| 18/09/2018 | 3.1 |
| 18/09/2018 | 3 |
| 18/09/2018 | 2.9 |
| 18/09/2018 | 2.9 |
| 18/09/2018 | 3.1 |
| 18/09/2018 | 3.4 |
| 18/09/2018 | 4.1 |
| 18/09/2018 | 4.7 |
| 18/09/2018 | 5.5 |
| 18/09/2018 | 5.7 |
| 18/09/2018 | 6 |
| 18/09/2018 | 6.2 |
| 18/09/2018 | 5.9 |
| 18/09/2018 | 6.1 |
| 18/09/2018 | 6.1 |
| 18/09/2018 | 5.6 |
| 18/09/2018 | 5.8 |
| 18/09/2018 | 5.6 |
| 18/09/2018 | 5.5 |
| 18/09/2018 | 6.4 |
| 18/09/2018 | 5.8 |
| 18/09/2018 | 4.9 |
| 18/09/2018 | 4.3 |
| 18/09/2018 | 3.4 |
| 19/09/2018 | 3.2 |
| 19/09/2018 | 3 |
| 19/09/2018 | 3 |
| 19/09/2018 | 3 |
| 19/09/2018 | 3.2 |
| 19/09/2018 | 3.5 |
| 19/09/2018 | 4.1 |
| 19/09/2018 | 4.8 |
| 19/09/2018 | 5.6 |
| 19/09/2018 | 5.8 |
| 19/09/2018 | 6.1 |
| 19/09/2018 | 6.4 |
| 19/09/2018 | 6 |
| 19/09/2018 | 6.1 |
| 19/09/2018 | 6.1 |
| 19/09/2018 | 6.2 |
| 19/09/2018 | 5.8 |
| 19/09/2018 | 5.6 |
| 19/09/2018 | 5.9 |
| 19/09/2018 | 6.3 |
| 19/09/2018 | 5.7 |
| 19/09/2018 | 4.8 |
| 19/09/2018 | 4.3 |
| 19/09/2018 | 3.4 |
| 20/09/2018 | 3.3 |
| 20/09/2018 | 3.1 |
| 20/09/2018 | 2.5 |
| 20/09/2018 | 3 |
| 20/09/2018 | 2.7 |
| 20/09/2018 | 3.5 |
| 20/09/2018 | 4.2 |
| 20/09/2018 | 4.9 |
| 20/09/2018 | 5.6 |
| 20/09/2018 | 5.8 |
| 20/09/2018 | 6 |
| 20/09/2018 | 6.2 |
| 20/09/2018 | 6.4 |
| 20/09/2018 | 6.1 |
| 20/09/2018 | 6 |
| 20/09/2018 | 6 |
| 20/09/2018 | 5.7 |
| 20/09/2018 | 5.6 |
| 20/09/2018 | 6.1 |
| 20/09/2018 | 6.5 |
| 20/09/2018 | 5.8 |
| 20/09/2018 | 4.9 |
| 20/09/2018 | 4.3 |
| 20/09/2018 | 3.5 |
| 21/09/2018 | 3.3 |
| 21/09/2018 | 3.1 |
| 21/09/2018 | 2.6 |
| 21/09/2018 | 3 |
| 21/09/2018 | 2.7 |
| 21/09/2018 | 3.5 |
| 21/09/2018 | 4.1 |
| 21/09/2018 | 4.7 |
| 21/09/2018 | 5.5 |
| 21/09/2018 | 5.7 |
| 21/09/2018 | 6 |
| 21/09/2018 | 6.2 |
| 21/09/2018 | 6.2 |
| 21/09/2018 | 6 |
| 21/09/2018 | 5.8 |
| 21/09/2018 | 5.7 |
| 21/09/2018 | 5.4 |
| 21/09/2018 | 5.6 |
| 21/09/2018 | 5.3 |
| 21/09/2018 | 6.2 |
| 21/09/2018 | 5.5 |
| 21/09/2018 | 4.8 |
| 21/09/2018 | 4.1 |
| 21/09/2018 | 3.7 |
| 22/09/2018 | 3 |
| 22/09/2018 | 3 |
| 22/09/2018 | 2.9 |
| 22/09/2018 | 2.7 |
| 22/09/2018 | 2.7 |
| 22/09/2018 | 2.7 |
| 22/09/2018 | 3.2 |
| 22/09/2018 | 3.5 |
| 22/09/2018 | 4.2 |
| 22/09/2018 | 4.3 |
| 22/09/2018 | 4.8 |
| 22/09/2018 | 4.7 |
| 22/09/2018 | 4.7 |
| 22/09/2018 | 4.6 |
| 22/09/2018 | 4.4 |
| 22/09/2018 | 4.5 |
| 22/09/2018 | 4.3 |
| 22/09/2018 | 4.1 |
| 22/09/2018 | 4.8 |
| 22/09/2018 | 5.1 |
| 22/09/2018 | 4.8 |
| 22/09/2018 | 4.3 |
| 22/09/2018 | 3.7 |
| 22/09/2018 | 3.2 |
| 23/09/2018 | 2.8 |
| 23/09/2018 | 2.9 |
| 23/09/2018 | 2.4 |
| 23/09/2018 | 2.6 |
| 23/09/2018 | 2.6 |
| 23/09/2018 | 2.8 |
| 23/09/2018 | 2.8 |
| 23/09/2018 | 3 |
| 23/09/2018 | 3.5 |
| 23/09/2018 | 3.7 |
| 23/09/2018 | 3.8 |
| 23/09/2018 | 4.2 |
| 23/09/2018 | 4.1 |
| 23/09/2018 | 4.2 |
| 23/09/2018 | 4.1 |
| 23/09/2018 | 3.8 |
| 23/09/2018 | 3.7 |
| 23/09/2018 | 4 |
| 23/09/2018 | 4.4 |
| 23/09/2018 | 5.1 |
| 23/09/2018 | 4.7 |
| 23/09/2018 | 3.9 |
| 23/09/2018 | 3.8 |
| 23/09/2018 | 3.2 |
| 24/09/2018 | 2.8 |
| 24/09/2018 | 2.8 |
| 24/09/2018 | 2.4 |
| 24/09/2018 | 2.4 |
| 24/09/2018 | 2.6 |
| 24/09/2018 | 3 |
| 24/09/2018 | 4.3 |
| 24/09/2018 | 5 |
| 24/09/2018 | 5.2 |
| 24/09/2018 | 5.5 |
| 24/09/2018 | 5.8 |
| 24/09/2018 | 6 |
| 24/09/2018 | 6.2 |
| 24/09/2018 | 5.9 |
| 24/09/2018 | 5.9 |
| 24/09/2018 | 5.8 |
| 24/09/2018 | 5.4 |
| 24/09/2018 | 5.4 |
| 24/09/2018 | 6.1 |
| 24/09/2018 | 6.3 |
| 24/09/2018 | 5.9 |
| 24/09/2018 | 4.7 |
| 24/09/2018 | 4.1 |
| 24/09/2018 | 3.3 |
| 25/09/2018 | 3.1 |
| 25/09/2018 | 2.9 |
| 25/09/2018 | 2.9 |
| 25/09/2018 | 2.9 |
| 25/09/2018 | 3.1 |
| 25/09/2018 | 3.4 |
| 25/09/2018 | 4.2 |
| 25/09/2018 | 4.9 |
| 25/09/2018 | 5.2 |
| 25/09/2018 | 5.8 |
| 25/09/2018 | 6 |
| 25/09/2018 | 6.2 |
| 25/09/2018 | 5.9 |
| 25/09/2018 | 6 |
| 25/09/2018 | 6 |
| 25/09/2018 | 5.5 |
| 25/09/2018 | 5.7 |
| 25/09/2018 | 5.7 |
| 25/09/2018 | 6 |
| 25/09/2018 | 6.6 |
| 25/09/2018 | 6.1 |
| 25/09/2018 | 4.9 |
| 25/09/2018 | 4.2 |
| 25/09/2018 | 3.4 |
| 26/09/2018 | 3.2 |
| 26/09/2018 | 3 |
| 26/09/2018 | 3 |
| 26/09/2018 | 2.9 |
| 26/09/2018 | 2.6 |
| 26/09/2018 | 3.5 |
| 26/09/2018 | 4.3 |
| 26/09/2018 | 5 |
| 26/09/2018 | 5.3 |
| 26/09/2018 | 5.9 |
| 26/09/2018 | 6.2 |
| 26/09/2018 | 5.9 |
| 26/09/2018 | 6 |
| 26/09/2018 | 6 |
| 26/09/2018 | 6 |
| 26/09/2018 | 6.1 |
| 26/09/2018 | 5.7 |
| 26/09/2018 | 5.6 |
| 26/09/2018 | 5.8 |
| 26/09/2018 | 6.5 |
| 26/09/2018 | 6 |
| 26/09/2018 | 4.8 |
| 26/09/2018 | 4.2 |
| 26/09/2018 | 3.4 |
| 27/09/2018 | 3.2 |
| 27/09/2018 | 3 |
| 27/09/2018 | 2.5 |
| 27/09/2018 | 2.9 |
| 27/09/2018 | 2.6 |
| 27/09/2018 | 3.5 |
| 27/09/2018 | 4.3 |
| 27/09/2018 | 5 |
| 27/09/2018 | 5.2 |
| 27/09/2018 | 5.9 |
| 27/09/2018 | 6.1 |
| 27/09/2018 | 6.3 |
| 27/09/2018 | 5.9 |
| 27/09/2018 | 6 |
| 27/09/2018 | 5.9 |
| 27/09/2018 | 5.9 |
| 27/09/2018 | 5.6 |
| 27/09/2018 | 5.6 |
| 27/09/2018 | 6 |
| 27/09/2018 | 6.7 |
| 27/09/2018 | 5.6 |
| 27/09/2018 | 4.8 |
| 27/09/2018 | 4.3 |
| 27/09/2018 | 3.5 |
| 28/09/2018 | 3.3 |
| 28/09/2018 | 3.1 |
| 28/09/2018 | 2.5 |
| 28/09/2018 | 3 |
| 28/09/2018 | 2.6 |
| 28/09/2018 | 3.5 |
| 28/09/2018 | 4.2 |
| 28/09/2018 | 4.9 |
| 28/09/2018 | 5.7 |
| 28/09/2018 | 5.8 |
| 28/09/2018 | 6.1 |
| 28/09/2018 | 5.7 |
| 28/09/2018 | 6.1 |
| 28/09/2018 | 5.9 |
| 28/09/2018 | 5.7 |
| 28/09/2018 | 5.7 |
| 28/09/2018 | 5.3 |
| 28/09/2018 | 5.1 |
| 28/09/2018 | 5.7 |
| 28/09/2018 | 6.4 |
| 28/09/2018 | 5.3 |
| 28/09/2018 | 4.2 |
| 28/09/2018 | 4.1 |
| 28/09/2018 | 3.7 |
| 29/09/2018 | 3 |
| 29/09/2018 | 2.9 |
| 29/09/2018 | 2.9 |
| 29/09/2018 | 2.6 |
| 29/09/2018 | 2.6 |
| 29/09/2018 | 2.7 |
| 29/09/2018 | 3.3 |
| 29/09/2018 | 3.6 |
| 29/09/2018 | 3.8 |
| 29/09/2018 | 4.4 |
| 29/09/2018 | 4.8 |
| 29/09/2018 | 4.7 |
| 29/09/2018 | 4.7 |
| 29/09/2018 | 4.5 |
| 29/09/2018 | 4.3 |
| 29/09/2018 | 4.5 |
| 29/09/2018 | 4.2 |
| 29/09/2018 | 4.2 |
| 29/09/2018 | 4.7 |
| 29/09/2018 | 5.7 |
| 29/09/2018 | 5 |
| 29/09/2018 | 3.8 |
| 29/09/2018 | 3.7 |
| 29/09/2018 | 3.2 |
| 30/09/2018 | 2.8 |
| 30/09/2018 | 2.9 |
| 30/09/2018 | 2.3 |
| 30/09/2018 | 2.6 |
| 30/09/2018 | 2.5 |
| 30/09/2018 | 2.3 |
| 30/09/2018 | 2.9 |
| 30/09/2018 | 3.1 |
| 30/09/2018 | 3.6 |
| 30/09/2018 | 3.8 |
| 30/09/2018 | 3.9 |
| 30/09/2018 | 4.2 |
| 30/09/2018 | 4.1 |
| 30/09/2018 | 4.1 |
| 30/09/2018 | 4 |
| 30/09/2018 | 3.7 |
| 30/09/2018 | 3.6 |
| 30/09/2018 | 4 |
| 30/09/2018 | 4.7 |
| 30/09/2018 | 5.2 |
| 30/09/2018 | 4.5 |
| 30/09/2018 | 3.9 |
| 30/09/2018 | 3.8 |
| 30/09/2018 | 3.2 |
| 01/10/2018 | 2.8 |
| 01/10/2018 | 2.8 |
| 01/10/2018 | 2.4 |
| 01/10/2018 | 2.3 |
| 01/10/2018 | 2.6 |
| 01/10/2018 | 3 |
| 01/10/2018 | 3.9 |
| 01/10/2018 | 4.6 |
| 01/10/2018 | 5.4 |
| 01/10/2018 | 5.6 |
| 01/10/2018 | 5.8 |
| 01/10/2018 | 6 |
| 01/10/2018 | 5.7 |
| 01/10/2018 | 5.8 |
| 01/10/2018 | 5.8 |
| 01/10/2018 | 5.3 |
| 01/10/2018 | 5.3 |
| 01/10/2018 | 5.5 |
| 01/10/2018 | 6 |
| 01/10/2018 | 7 |
| 01/10/2018 | 5.7 |
| 01/10/2018 | 4.7 |
| 01/10/2018 | 4.1 |
| 01/10/2018 | 3.3 |
| 02/10/2018 | 3.1 |
| 02/10/2018 | 2.9 |
| 02/10/2018 | 2.9 |
| 02/10/2018 | 2.8 |
| 02/10/2018 | 2.5 |
| 02/10/2018 | 3.4 |
| 02/10/2018 | 4.3 |
| 02/10/2018 | 5 |
| 02/10/2018 | 5.3 |
| 02/10/2018 | 6 |
| 02/10/2018 | 6.1 |
| 02/10/2018 | 6.3 |
| 02/10/2018 | 5.9 |
| 02/10/2018 | 6 |
| 02/10/2018 | 5.9 |
| 02/10/2018 | 5.5 |
| 02/10/2018 | 5.6 |
| 02/10/2018 | 5.2 |
| 02/10/2018 | 6.4 |
| 02/10/2018 | 6.8 |
| 02/10/2018 | 5.9 |
| 02/10/2018 | 4.8 |
| 02/10/2018 | 4.2 |
| 02/10/2018 | 3.4 |
| 03/10/2018 | 2.6 |
| 03/10/2018 | 2.7 |
| 03/10/2018 | 2.7 |
| 03/10/2018 | 2.4 |
| 03/10/2018 | 2.4 |
| 03/10/2018 | 2.6 |
| 03/10/2018 | 2.8 |
| 03/10/2018 | 2.8 |
| 03/10/2018 | 3.6 |
| 03/10/2018 | 3.8 |
| 03/10/2018 | 3.8 |
| 03/10/2018 | 3.9 |
| 03/10/2018 | 4.1 |
| 03/10/2018 | 3.9 |
| 03/10/2018 | 3.7 |
| 03/10/2018 | 3.8 |
| 03/10/2018 | 3.7 |
| 03/10/2018 | 3.6 |
| 03/10/2018 | 4.6 |
| 03/10/2018 | 5.5 |
| 03/10/2018 | 4.6 |
| 03/10/2018 | 3.9 |
| 03/10/2018 | 3.8 |
| 03/10/2018 | 3 |
| 04/10/2018 | 3.3 |
| 04/10/2018 | 3.1 |
| 04/10/2018 | 2.5 |
| 04/10/2018 | 3 |
| 04/10/2018 | 2.6 |
| 04/10/2018 | 3.5 |
| 04/10/2018 | 4.4 |
| 04/10/2018 | 5.3 |
| 04/10/2018 | 5.5 |
| 04/10/2018 | 6.1 |
| 04/10/2018 | 6.3 |
| 04/10/2018 | 5.9 |
| 04/10/2018 | 6.1 |
| 04/10/2018 | 6.2 |
| 04/10/2018 | 6.1 |
| 04/10/2018 | 5.6 |
| 04/10/2018 | 5.7 |
| 04/10/2018 | 6 |
| 04/10/2018 | 6.5 |
| 04/10/2018 | 7.3 |
| 04/10/2018 | 5.9 |
| 04/10/2018 | 4.9 |
| 04/10/2018 | 4.4 |
| 04/10/2018 | 3.7 |
| 05/10/2018 | 3.4 |
| 05/10/2018 | 2.7 |
| 05/10/2018 | 2.6 |
| 05/10/2018 | 2.5 |
| 05/10/2018 | 2.7 |
| 05/10/2018 | 3.5 |
| 05/10/2018 | 4.4 |
| 05/10/2018 | 5.2 |
| 05/10/2018 | 5.4 |
| 05/10/2018 | 6.1 |
| 05/10/2018 | 5.8 |
| 05/10/2018 | 5.9 |
| 05/10/2018 | 5.9 |
| 05/10/2018 | 6.2 |
| 05/10/2018 | 6 |
| 05/10/2018 | 5.4 |
| 05/10/2018 | 5.6 |
| 05/10/2018 | 5.6 |
| 05/10/2018 | 6.3 |
| 05/10/2018 | 6.8 |
| 05/10/2018 | 5.6 |
| 05/10/2018 | 4.4 |
| 05/10/2018 | 4.2 |
| 05/10/2018 | 3.8 |
| 06/10/2018 | 3.1 |
| 06/10/2018 | 3 |
| 06/10/2018 | 3 |
| 06/10/2018 | 2.7 |
| 06/10/2018 | 2.7 |
| 06/10/2018 | 2.7 |
| 06/10/2018 | 3.4 |
| 06/10/2018 | 3.8 |
| 06/10/2018 | 4 |
| 06/10/2018 | 4.6 |
| 06/10/2018 | 5.1 |
| 06/10/2018 | 5 |
| 06/10/2018 | 5 |
| 06/10/2018 | 4.8 |
| 06/10/2018 | 4.6 |
| 06/10/2018 | 4.3 |
| 06/10/2018 | 4.1 |
| 06/10/2018 | 4.7 |
| 06/10/2018 | 5.2 |
| 06/10/2018 | 5.5 |
| 06/10/2018 | 4.7 |
| 06/10/2018 | 3.9 |
| 06/10/2018 | 3.9 |
| 06/10/2018 | 3.4 |
| 07/10/2018 | 3 |
| 07/10/2018 | 3 |
| 07/10/2018 | 2.4 |
| 07/10/2018 | 2.7 |
| 07/10/2018 | 2.6 |
| 07/10/2018 | 2.4 |
| 07/10/2018 | 3 |
| 07/10/2018 | 3.3 |
| 07/10/2018 | 3.4 |
| 07/10/2018 | 4 |
| 07/10/2018 | 4.2 |
| 07/10/2018 | 4.5 |
| 07/10/2018 | 4.4 |
| 07/10/2018 | 4.4 |
| 07/10/2018 | 4.3 |
| 07/10/2018 | 4.1 |
| 07/10/2018 | 4.1 |
| 07/10/2018 | 4.1 |
| 07/10/2018 | 4.8 |
| 07/10/2018 | 5.4 |
| 07/10/2018 | 4.7 |
| 07/10/2018 | 4.1 |
| 07/10/2018 | 4 |
| 07/10/2018 | 3.4 |
| 08/10/2018 | 3 |
| 08/10/2018 | 3 |
| 08/10/2018 | 2.5 |
| 08/10/2018 | 2.5 |
| 08/10/2018 | 2.7 |
| 08/10/2018 | 3.1 |
| 08/10/2018 | 4.2 |
| 08/10/2018 | 5 |
| 08/10/2018 | 5.8 |
| 08/10/2018 | 6 |
| 08/10/2018 | 6.3 |
| 08/10/2018 | 6 |
| 08/10/2018 | 6.2 |
| 08/10/2018 | 6.3 |
| 08/10/2018 | 5.8 |
| 08/10/2018 | 5.8 |
| 08/10/2018 | 5.6 |
| 08/10/2018 | 5.8 |
| 08/10/2018 | 6.8 |
| 08/10/2018 | 7.2 |
| 08/10/2018 | 5.9 |
| 08/10/2018 | 5 |
| 08/10/2018 | 4.4 |
| 08/10/2018 | 3.6 |
| 09/10/2018 | 3.3 |
| 09/10/2018 | 3.1 |
| 09/10/2018 | 3.1 |
| 09/10/2018 | 3 |
| 09/10/2018 | 2.7 |
| 09/10/2018 | 3.6 |
| 09/10/2018 | 4.6 |
| 09/10/2018 | 5.5 |
| 09/10/2018 | 5.7 |
| 09/10/2018 | 5.9 |
| 09/10/2018 | 6.1 |
| 09/10/2018 | 6.3 |
| 09/10/2018 | 6.5 |
| 09/10/2018 | 6.5 |
| 09/10/2018 | 6 |
| 09/10/2018 | 6.1 |
| 09/10/2018 | 6 |
| 09/10/2018 | 6.2 |
| 09/10/2018 | 7.2 |
| 09/10/2018 | 7.5 |
| 09/10/2018 | 6.1 |
| 09/10/2018 | 4.7 |
| 09/10/2018 | 4.5 |
| 09/10/2018 | 3.7 |
| 10/10/2018 | 3.5 |
| 10/10/2018 | 3.2 |
| 10/10/2018 | 2.7 |
| 10/10/2018 | 3.1 |
| 10/10/2018 | 2.8 |
| 10/10/2018 | 3.7 |
| 10/10/2018 | 4.7 |
| 10/10/2018 | 5.1 |
| 10/10/2018 | 5.9 |
| 10/10/2018 | 6.1 |
| 10/10/2018 | 6.4 |
| 10/10/2018 | 6.5 |
| 10/10/2018 | 6.6 |
| 10/10/2018 | 6.7 |
| 10/10/2018 | 6.1 |
| 10/10/2018 | 6.3 |
| 10/10/2018 | 6.1 |
| 10/10/2018 | 6.3 |
| 10/10/2018 | 7.1 |
| 10/10/2018 | 7.3 |
| 10/10/2018 | 6 |
| 10/10/2018 | 5.2 |
| 10/10/2018 | 4.1 |
| 10/10/2018 | 3.8 |
| 11/10/2018 | 3.6 |
| 11/10/2018 | 3.3 |
| 11/10/2018 | 2.7 |
| 11/10/2018 | 2.6 |
| 11/10/2018 | 2.8 |
| 11/10/2018 | 3.7 |
| 11/10/2018 | 4.7 |
| 11/10/2018 | 5.2 |
| 11/10/2018 | 5.9 |
| 11/10/2018 | 6 |
| 11/10/2018 | 6.3 |
| 11/10/2018 | 6.5 |
| 11/10/2018 | 6.6 |
| 11/10/2018 | 6.7 |
| 11/10/2018 | 6.1 |
| 11/10/2018 | 6.2 |
| 11/10/2018 | 6.1 |
| 11/10/2018 | 6.4 |
| 11/10/2018 | 7.3 |
| 11/10/2018 | 7.4 |
| 11/10/2018 | 6.1 |
| 11/10/2018 | 4.8 |
| 11/10/2018 | 4.2 |
| 11/10/2018 | 4 |
| 12/10/2018 | 3.2 |
| 12/10/2018 | 2.9 |
| 12/10/2018 | 2.8 |
| 12/10/2018 | 2.7 |
| 12/10/2018 | 2.8 |
| 12/10/2018 | 3.7 |
| 12/10/2018 | 4.6 |
| 12/10/2018 | 5.6 |
| 12/10/2018 | 5.9 |
| 12/10/2018 | 6.1 |
| 12/10/2018 | 6.4 |
| 12/10/2018 | 6.5 |
| 12/10/2018 | 6.4 |
| 12/10/2018 | 6.2 |
| 12/10/2018 | 6 |
| 12/10/2018 | 6 |
| 12/10/2018 | 6 |
| 12/10/2018 | 6 |
| 12/10/2018 | 7 |
| 12/10/2018 | 7 |
| 12/10/2018 | 5.8 |
| 12/10/2018 | 4.7 |
| 12/10/2018 | 4 |
| 12/10/2018 | 3.6 |
| 13/10/2018 | 3.4 |
| 13/10/2018 | 3.3 |
| 13/10/2018 | 3.1 |
| 13/10/2018 | 2.9 |
| 13/10/2018 | 2.8 |
| 13/10/2018 | 2.9 |
| 13/10/2018 | 3.6 |
| 13/10/2018 | 4.1 |
| 13/10/2018 | 4.3 |
| 13/10/2018 | 5 |
| 13/10/2018 | 5 |
| 13/10/2018 | 5.5 |
| 13/10/2018 | 5.4 |
| 13/10/2018 | 5.3 |
| 13/10/2018 | 5.1 |
| 13/10/2018 | 4.8 |
| 13/10/2018 | 4.8 |
| 13/10/2018 | 5 |
| 13/10/2018 | 5.9 |
| 13/10/2018 | 6.2 |
| 13/10/2018 | 5 |
| 13/10/2018 | 4.2 |
| 13/10/2018 | 4.2 |
| 13/10/2018 | 3.7 |
| 14/10/2018 | 3.3 |
| 14/10/2018 | 3.2 |
| 14/10/2018 | 2.6 |
| 14/10/2018 | 2.8 |
| 14/10/2018 | 2.8 |
| 14/10/2018 | 2.5 |
| 14/10/2018 | 3.2 |
| 14/10/2018 | 3.6 |
| 14/10/2018 | 3.6 |
| 14/10/2018 | 4.4 |
| 14/10/2018 | 4.6 |
| 14/10/2018 | 4.4 |
| 14/10/2018 | 4.8 |
| 14/10/2018 | 4.4 |
| 14/10/2018 | 4.2 |
| 14/10/2018 | 4.6 |
| 14/10/2018 | 4.3 |
| 14/10/2018 | 4.8 |
| 14/10/2018 | 5.4 |
| 14/10/2018 | 5.5 |
| 14/10/2018 | 4.9 |
| 14/10/2018 | 4.4 |
| 14/10/2018 | 3.8 |
| 14/10/2018 | 3.7 |
| 15/10/2018 | 3.3 |
| 15/10/2018 | 3.2 |
| 15/10/2018 | 2.7 |
| 15/10/2018 | 2.6 |
| 15/10/2018 | 2.9 |
| 15/10/2018 | 3.3 |
| 15/10/2018 | 4.4 |
| 15/10/2018 | 5.4 |
| 15/10/2018 | 6.2 |
| 15/10/2018 | 6.5 |
| 15/10/2018 | 6.3 |
| 15/10/2018 | 6.5 |
| 15/10/2018 | 6.7 |
| 15/10/2018 | 6.4 |
| 15/10/2018 | 6.4 |
| 15/10/2018 | 6.5 |
| 15/10/2018 | 6 |
| 15/10/2018 | 6.8 |
| 15/10/2018 | 7.5 |
| 15/10/2018 | 7.4 |
| 15/10/2018 | 6.2 |
| 15/10/2018 | 4.9 |
| 15/10/2018 | 4.2 |
| 15/10/2018 | 3.9 |
| 16/10/2018 | 3.6 |
| 16/10/2018 | 3.3 |
| 16/10/2018 | 2.7 |
| 16/10/2018 | 3.2 |
| 16/10/2018 | 2.9 |
| 16/10/2018 | 3.7 |
| 16/10/2018 | 4.8 |
| 16/10/2018 | 5.4 |
| 16/10/2018 | 6.2 |
| 16/10/2018 | 6.4 |
| 16/10/2018 | 6.7 |
| 16/10/2018 | 6.9 |
| 16/10/2018 | 7 |
| 16/10/2018 | 6.6 |
| 16/10/2018 | 6.6 |
| 16/10/2018 | 6.3 |
| 16/10/2018 | 6.4 |
| 16/10/2018 | 6.7 |
| 16/10/2018 | 7.4 |
| 16/10/2018 | 7.6 |
| 16/10/2018 | 6.4 |
| 16/10/2018 | 5 |
| 16/10/2018 | 4.4 |
| 16/10/2018 | 4.1 |
| 17/10/2018 | 3.8 |
| 17/10/2018 | 3.4 |
| 17/10/2018 | 2.8 |
| 17/10/2018 | 2.8 |
| 17/10/2018 | 2.9 |
| 17/10/2018 | 3.8 |
| 17/10/2018 | 4.9 |
| 17/10/2018 | 5.5 |
| 17/10/2018 | 6.3 |
| 17/10/2018 | 6.5 |
| 17/10/2018 | 6.9 |
| 17/10/2018 | 7.1 |
| 17/10/2018 | 7.1 |
| 17/10/2018 | 6.7 |
| 17/10/2018 | 6.7 |
| 17/10/2018 | 6.4 |
| 17/10/2018 | 6.5 |
| 17/10/2018 | 6.8 |
| 17/10/2018 | 7.9 |
| 17/10/2018 | 7.5 |
| 17/10/2018 | 6.3 |
| 17/10/2018 | 5 |
| 17/10/2018 | 4.4 |
| 17/10/2018 | 4.2 |
| 18/10/2018 | 3.9 |
| 18/10/2018 | 3 |
| 18/10/2018 | 2.9 |
| 18/10/2018 | 2.8 |
| 18/10/2018 | 3 |
| 18/10/2018 | 3.8 |
| 18/10/2018 | 4.9 |
| 18/10/2018 | 5.6 |
| 18/10/2018 | 6.3 |
| 18/10/2018 | 6.5 |
| 18/10/2018 | 6.8 |
| 18/10/2018 | 7 |
| 18/10/2018 | 7.2 |
| 18/10/2018 | 6.8 |
| 18/10/2018 | 6.7 |
| 18/10/2018 | 6.4 |
| 18/10/2018 | 6.6 |
| 18/10/2018 | 6.9 |
| 18/10/2018 | 8.1 |
| 18/10/2018 | 7.6 |
| 18/10/2018 | 6.4 |
| 18/10/2018 | 5.1 |
| 18/10/2018 | 4.5 |
| 18/10/2018 | 4.3 |
| 19/10/2018 | 3.5 |
| 19/10/2018 | 3.1 |
| 19/10/2018 | 2.9 |
| 19/10/2018 | 2.8 |
| 19/10/2018 | 3 |
| 19/10/2018 | 3.8 |
| 19/10/2018 | 4.8 |
| 19/10/2018 | 5.5 |
| 19/10/2018 | 6.3 |
| 19/10/2018 | 6.5 |
| 19/10/2018 | 6.9 |
| 19/10/2018 | 7 |
| 19/10/2018 | 7 |
| 19/10/2018 | 6.8 |
| 19/10/2018 | 6.6 |
| 19/10/2018 | 6.2 |
| 19/10/2018 | 6.4 |
| 19/10/2018 | 7 |
| 19/10/2018 | 7.3 |
| 19/10/2018 | 7.1 |
| 19/10/2018 | 6.1 |
| 19/10/2018 | 5.1 |
| 19/10/2018 | 4.3 |
| 19/10/2018 | 4 |
| 20/10/2018 | 3.7 |
| 20/10/2018 | 3.5 |
| 20/10/2018 | 3.3 |
| 20/10/2018 | 3 |
| 20/10/2018 | 3 |
| 20/10/2018 | 3 |
| 20/10/2018 | 3.8 |
| 20/10/2018 | 3.9 |
| 20/10/2018 | 4.7 |
| 20/10/2018 | 5.4 |
| 20/10/2018 | 5.5 |
| 20/10/2018 | 5.4 |
| 20/10/2018 | 5.4 |
| 20/10/2018 | 5.2 |
| 20/10/2018 | 5.1 |
| 20/10/2018 | 5.4 |
| 20/10/2018 | 5.1 |
| 20/10/2018 | 5.3 |
| 20/10/2018 | 6.5 |
| 20/10/2018 | 6.3 |
| 20/10/2018 | 5.2 |
| 20/10/2018 | 4.6 |
| 20/10/2018 | 4 |
| 20/10/2018 | 4 |
| 21/10/2018 | 3.5 |
| 21/10/2018 | 3.4 |
| 21/10/2018 | 2.8 |
| 21/10/2018 | 3 |
| 21/10/2018 | 2.9 |
| 21/10/2018 | 2.6 |
| 21/10/2018 | 3.3 |
| 21/10/2018 | 3.4 |
| 21/10/2018 | 3.9 |
| 21/10/2018 | 4.2 |
| 21/10/2018 | 5 |
| 21/10/2018 | 4.8 |
| 21/10/2018 | 4.8 |
| 21/10/2018 | 4.8 |
| 21/10/2018 | 4.7 |
| 21/10/2018 | 4.6 |
| 21/10/2018 | 4.5 |
| 21/10/2018 | 5.1 |
| 21/10/2018 | 6 |
| 21/10/2018 | 5.7 |
| 21/10/2018 | 5.1 |
| 21/10/2018 | 4.7 |
| 21/10/2018 | 4.1 |
| 21/10/2018 | 4 |
| 22/10/2018 | 3.5 |
| 22/10/2018 | 2.8 |
| 22/10/2018 | 2.7 |
| 22/10/2018 | 2.6 |
| 22/10/2018 | 2.8 |
| 22/10/2018 | 3 |
| 22/10/2018 | 4.2 |
| 22/10/2018 | 5.2 |
| 22/10/2018 | 6.1 |
| 22/10/2018 | 6.6 |
| 22/10/2018 | 6.6 |
| 22/10/2018 | 6.4 |
| 22/10/2018 | 6.5 |
| 22/10/2018 | 6.6 |
| 22/10/2018 | 6 |
| 22/10/2018 | 6.1 |
| 22/10/2018 | 5.7 |
| 22/10/2018 | 6.8 |
| 22/10/2018 | 8.2 |
| 22/10/2018 | 7.8 |
| 22/10/2018 | 5.7 |
| 22/10/2018 | 5 |
| 22/10/2018 | 4.2 |
| 22/10/2018 | 4.1 |
| 23/10/2018 | 3.3 |
| 23/10/2018 | 2.9 |
| 23/10/2018 | 2.8 |
| 23/10/2018 | 2.7 |
| 23/10/2018 | 2.8 |
| 23/10/2018 | 3.5 |
| 23/10/2018 | 4.6 |
| 23/10/2018 | 5.7 |
| 23/10/2018 | 6.1 |
| 23/10/2018 | 6.5 |
| 23/10/2018 | 7 |
| 23/10/2018 | 6.7 |
| 23/10/2018 | 6.8 |
| 23/10/2018 | 6.8 |
| 23/10/2018 | 6.2 |
| 23/10/2018 | 6.4 |
| 23/10/2018 | 6.1 |
| 23/10/2018 | 6.7 |
| 23/10/2018 | 8.1 |
| 23/10/2018 | 7.6 |
| 23/10/2018 | 5.9 |
| 23/10/2018 | 4.7 |
| 23/10/2018 | 4.4 |
| 23/10/2018 | 4.3 |
| 24/10/2018 | 3.4 |
| 24/10/2018 | 3 |
| 24/10/2018 | 2.9 |
| 24/10/2018 | 2.8 |
| 24/10/2018 | 2.9 |
| 24/10/2018 | 3.6 |
| 24/10/2018 | 4.7 |
| 24/10/2018 | 5.8 |
| 24/10/2018 | 6.2 |
| 24/10/2018 | 6.6 |
| 24/10/2018 | 6.7 |
| 24/10/2018 | 6.9 |
| 24/10/2018 | 7 |
| 24/10/2018 | 6.9 |
| 24/10/2018 | 6.3 |
| 24/10/2018 | 6.6 |
| 24/10/2018 | 6.2 |
| 24/10/2018 | 6.8 |
| 24/10/2018 | 8.5 |
| 24/10/2018 | 7.9 |
| 24/10/2018 | 5.9 |
| 24/10/2018 | 5.2 |
| 24/10/2018 | 4.4 |
| 24/10/2018 | 4.4 |
| 25/10/2018 | 3.5 |
| 25/10/2018 | 3.1 |
| 25/10/2018 | 2.9 |
| 25/10/2018 | 2.8 |
| 25/10/2018 | 2.9 |
| 25/10/2018 | 3.6 |
| 25/10/2018 | 4.7 |
| 25/10/2018 | 5.9 |
| 25/10/2018 | 6.2 |
| 25/10/2018 | 6.6 |
| 25/10/2018 | 7.1 |
| 25/10/2018 | 6.9 |
| 25/10/2018 | 7 |
| 25/10/2018 | 7 |
| 25/10/2018 | 6.3 |
| 25/10/2018 | 6.5 |
| 25/10/2018 | 6.3 |
| 25/10/2018 | 7 |
| 25/10/2018 | 8.7 |
| 25/10/2018 | 8 |
| 25/10/2018 | 5.9 |
| 25/10/2018 | 4.8 |
| 25/10/2018 | 4.5 |
| 25/10/2018 | 4 |
| 26/10/2018 | 3.7 |
| 26/10/2018 | 3.2 |
| 26/10/2018 | 3 |
| 26/10/2018 | 2.9 |
| 26/10/2018 | 3 |
| 26/10/2018 | 3.6 |
| 26/10/2018 | 4.6 |
| 26/10/2018 | 5.8 |
| 26/10/2018 | 6.2 |
| 26/10/2018 | 6.6 |
| 26/10/2018 | 6.7 |
| 26/10/2018 | 6.9 |
| 26/10/2018 | 6.8 |
| 26/10/2018 | 6.5 |
| 26/10/2018 | 6.2 |
| 26/10/2018 | 6.3 |
| 26/10/2018 | 6.1 |
| 26/10/2018 | 7 |
| 26/10/2018 | 8 |
| 26/10/2018 | 7.6 |
| 26/10/2018 | 5.7 |
| 26/10/2018 | 4.7 |
| 26/10/2018 | 4.3 |
| 26/10/2018 | 4.2 |
| 27/10/2018 | 3.8 |
| 27/10/2018 | 3.1 |
| 27/10/2018 | 2.9 |
| 27/10/2018 | 3 |
| 27/10/2018 | 3 |
| 27/10/2018 | 2.8 |
| 27/10/2018 | 3.2 |
| 27/10/2018 | 3.9 |
| 27/10/2018 | 4.7 |
| 27/10/2018 | 5.1 |
| 27/10/2018 | 5.8 |
| 27/10/2018 | 5.8 |
| 27/10/2018 | 5.8 |
| 27/10/2018 | 5.5 |
| 27/10/2018 | 5.3 |
| 27/10/2018 | 5.1 |
| 27/10/2018 | 4.8 |
| 27/10/2018 | 5.9 |
| 27/10/2018 | 7.2 |
| 27/10/2018 | 6.3 |
| 27/10/2018 | 4.9 |
| 27/10/2018 | 4.2 |
| 27/10/2018 | 4 |
| 27/10/2018 | 4.2 |
| 28/10/2018 | 3 |
| 28/10/2018 | 2.9 |
| 28/10/2018 | 2.8 |
| 28/10/2018 | 2.8 |
| 28/10/2018 | 2.5 |
| 28/10/2018 | 2.5 |
| 28/10/2018 | 2.6 |
| 28/10/2018 | 3 |
| 28/10/2018 | 3.4 |
| 28/10/2018 | 3.5 |
| 28/10/2018 | 3.7 |
| 28/10/2018 | 3.9 |
| 28/10/2018 | 4.3 |
| 28/10/2018 | 4.1 |
| 28/10/2018 | 4 |
| 28/10/2018 | 4 |
| 28/10/2018 | 4 |
| 28/10/2018 | 4.5 |
| 28/10/2018 | 5.2 |
| 28/10/2018 | 5.2 |
| 28/10/2018 | 5.4 |
| 28/10/2018 | 4.3 |
| 28/10/2018 | 4 |
| 28/10/2018 | 4 |
| 28/10/2018 | 3.3 |
| 29/10/2018 | 3 |
| 29/10/2018 | 2.9 |
| 29/10/2018 | 2.4 |
| 29/10/2018 | 2.8 |
| 29/10/2018 | 2.6 |
| 29/10/2018 | 3.4 |
| 29/10/2018 | 4.1 |
| 29/10/2018 | 5 |
| 29/10/2018 | 5.5 |
| 29/10/2018 | 5.7 |
| 29/10/2018 | 6.1 |
| 29/10/2018 | 6.4 |
| 29/10/2018 | 5.9 |
| 29/10/2018 | 6 |
| 29/10/2018 | 6.1 |
| 29/10/2018 | 5.8 |
| 29/10/2018 | 6.4 |
| 29/10/2018 | 7.1 |
| 29/10/2018 | 7.2 |
| 29/10/2018 | 6.9 |
| 29/10/2018 | 5.4 |
| 29/10/2018 | 4.5 |
| 29/10/2018 | 4.5 |
| 29/10/2018 | 3.6 |
| 30/10/2018 | 3.3 |
| 30/10/2018 | 3.1 |
| 30/10/2018 | 3 |
| 30/10/2018 | 2.9 |
| 30/10/2018 | 3.1 |
| 30/10/2018 | 3.4 |
| 30/10/2018 | 4 |
| 30/10/2018 | 5 |
| 30/10/2018 | 5.9 |
| 30/10/2018 | 6.1 |
| 30/10/2018 | 6.4 |
| 30/10/2018 | 6.2 |
| 30/10/2018 | 6.2 |
| 30/10/2018 | 6.2 |
| 30/10/2018 | 6.3 |
| 30/10/2018 | 6.1 |
| 30/10/2018 | 6.3 |
| 30/10/2018 | 7 |
| 30/10/2018 | 7.1 |
| 30/10/2018 | 7.2 |
| 30/10/2018 | 5.6 |
| 30/10/2018 | 4.6 |
| 30/10/2018 | 4.6 |
| 30/10/2018 | 3.7 |
| 31/10/2018 | 3.5 |
| 31/10/2018 | 3.2 |
| 31/10/2018 | 3.1 |
| 31/10/2018 | 3 |
| 31/10/2018 | 3.2 |
| 31/10/2018 | 3.4 |
| 31/10/2018 | 4.1 |
| 31/10/2018 | 5.1 |
| 31/10/2018 | 6.1 |
| 31/10/2018 | 6.3 |
| 31/10/2018 | 6.2 |
| 31/10/2018 | 6.4 |
| 31/10/2018 | 6.4 |
| 31/10/2018 | 6.3 |
| 31/10/2018 | 6.4 |
| 31/10/2018 | 6.3 |
| 31/10/2018 | 6.9 |
| 31/10/2018 | 7.1 |
| 31/10/2018 | 7.5 |
| 31/10/2018 | 7 |
| 31/10/2018 | 5.5 |
| 31/10/2018 | 4.6 |
| 31/10/2018 | 4.2 |
| 31/10/2018 | 3.8 |
| 01/11/2018 | 3.6 |
| 01/11/2018 | 3.2 |
| 01/11/2018 | 2.6 |
| 01/11/2018 | 3 |
| 01/11/2018 | 3.2 |
| 01/11/2018 | 3.5 |
| 01/11/2018 | 4.1 |
| 01/11/2018 | 5.2 |
| 01/11/2018 | 6.1 |
| 01/11/2018 | 6.3 |
| 01/11/2018 | 6.6 |
| 01/11/2018 | 6.4 |
| 01/11/2018 | 6.4 |
| 01/11/2018 | 6.4 |
| 01/11/2018 | 6.4 |
| 01/11/2018 | 6.3 |
| 01/11/2018 | 7 |
| 01/11/2018 | 7.3 |
| 01/11/2018 | 7.2 |
| 01/11/2018 | 7.1 |
| 01/11/2018 | 5.6 |
| 01/11/2018 | 4.7 |
| 01/11/2018 | 4.3 |
| 01/11/2018 | 4 |
| 02/11/2018 | 3.2 |
| 02/11/2018 | 2.8 |
| 02/11/2018 | 2.7 |
| 02/11/2018 | 3.1 |
| 02/11/2018 | 2.7 |
| 02/11/2018 | 3.5 |
| 02/11/2018 | 4.6 |
| 02/11/2018 | 5.1 |
| 02/11/2018 | 6 |
| 02/11/2018 | 6.3 |
| 02/11/2018 | 6.2 |
| 02/11/2018 | 6.4 |
| 02/11/2018 | 6.2 |
| 02/11/2018 | 6.4 |
| 02/11/2018 | 6.3 |
| 02/11/2018 | 6.1 |
| 02/11/2018 | 6.8 |
| 02/11/2018 | 7.3 |
| 02/11/2018 | 7.4 |
| 02/11/2018 | 6.6 |
| 02/11/2018 | 5.3 |
| 02/11/2018 | 4.7 |
| 02/11/2018 | 4.1 |
| 02/11/2018 | 3.6 |
| 03/11/2018 | 3.5 |
| 03/11/2018 | 3.3 |
| 03/11/2018 | 3.2 |
| 03/11/2018 | 2.9 |
| 03/11/2018 | 2.9 |
| 03/11/2018 | 3 |
| 03/11/2018 | 3.8 |
| 03/11/2018 | 4 |
| 03/11/2018 | 4.8 |
| 03/11/2018 | 4.9 |
| 03/11/2018 | 5.4 |
| 03/11/2018 | 5.5 |
| 03/11/2018 | 5.8 |
| 03/11/2018 | 5.6 |
| 03/11/2018 | 5.1 |
| 03/11/2018 | 5.1 |
| 03/11/2018 | 5.9 |
| 03/11/2018 | 6.2 |
| 03/11/2018 | 6 |
| 03/11/2018 | 5.9 |
| 03/11/2018 | 5.1 |
| 03/11/2018 | 4.4 |
| 03/11/2018 | 4 |
| 03/11/2018 | 3.8 |
| 04/11/2018 | 3.3 |
| 04/11/2018 | 3.2 |
| 04/11/2018 | 3.1 |
| 04/11/2018 | 2.8 |
| 04/11/2018 | 2.8 |
| 04/11/2018 | 3.1 |
| 04/11/2018 | 3.3 |
| 04/11/2018 | 3.4 |
| 04/11/2018 | 4 |
| 04/11/2018 | 4.2 |
| 04/11/2018 | 4.8 |
| 04/11/2018 | 4.8 |
| 04/11/2018 | 5.1 |
| 04/11/2018 | 4.6 |
| 04/11/2018 | 4.7 |
| 04/11/2018 | 4.8 |
| 04/11/2018 | 5.2 |
| 04/11/2018 | 5.9 |
| 04/11/2018 | 5.9 |
| 04/11/2018 | 5.1 |
| 04/11/2018 | 5 |
| 04/11/2018 | 4.5 |
| 04/11/2018 | 4.2 |
| 04/11/2018 | 3.8 |
| 05/11/2018 | 3.4 |
| 05/11/2018 | 3.2 |
| 05/11/2018 | 3.2 |
| 05/11/2018 | 3.2 |
| 05/11/2018 | 2.9 |
| 05/11/2018 | 3.4 |
| 05/11/2018 | 4.8 |
| 05/11/2018 | 5.6 |
| 05/11/2018 | 6.4 |
| 05/11/2018 | 6.6 |
| 05/11/2018 | 6.9 |
| 05/11/2018 | 7.2 |
| 05/11/2018 | 7.2 |
| 05/11/2018 | 6.9 |
| 05/11/2018 | 6.6 |
| 05/11/2018 | 7.1 |
| 05/11/2018 | 7.6 |
| 05/11/2018 | 8.2 |
| 05/11/2018 | 7.7 |
| 05/11/2018 | 6.9 |
| 05/11/2018 | 6.3 |
| 05/11/2018 | 5.5 |
| 05/11/2018 | 4.7 |
| 05/11/2018 | 4.1 |
| 06/11/2018 | 3.7 |
| 06/11/2018 | 3.4 |
| 06/11/2018 | 3.3 |
| 06/11/2018 | 3.2 |
| 06/11/2018 | 3.5 |
| 06/11/2018 | 3.9 |
| 06/11/2018 | 4.7 |
| 06/11/2018 | 6.1 |
| 06/11/2018 | 6.4 |
| 06/11/2018 | 7 |
| 06/11/2018 | 7.2 |
| 06/11/2018 | 7 |
| 06/11/2018 | 7 |
| 06/11/2018 | 7.1 |
| 06/11/2018 | 6.8 |
| 06/11/2018 | 6.9 |
| 06/11/2018 | 7.5 |
| 06/11/2018 | 8.1 |
| 06/11/2018 | 8.1 |
| 06/11/2018 | 7.1 |
| 06/11/2018 | 6.5 |
| 06/11/2018 | 5.7 |
| 06/11/2018 | 4.8 |
| 06/11/2018 | 4.2 |
| 07/11/2018 | 3.9 |
| 07/11/2018 | 3.5 |
| 07/11/2018 | 3.4 |
| 07/11/2018 | 3.3 |
| 07/11/2018 | 3.5 |
| 07/11/2018 | 4 |
| 07/11/2018 | 4.8 |
| 07/11/2018 | 5.7 |
| 07/11/2018 | 6.6 |
| 07/11/2018 | 6.7 |
| 07/11/2018 | 7 |
| 07/11/2018 | 7.2 |
| 07/11/2018 | 7.1 |
| 07/11/2018 | 7.2 |
| 07/11/2018 | 7 |
| 07/11/2018 | 7.5 |
| 07/11/2018 | 8.2 |
| 07/11/2018 | 8.8 |
| 07/11/2018 | 8 |
| 07/11/2018 | 6.9 |
| 07/11/2018 | 6.5 |
| 07/11/2018 | 5.7 |
| 07/11/2018 | 4.9 |
| 07/11/2018 | 4.3 |
| 08/11/2018 | 4 |
| 08/11/2018 | 3.6 |
| 08/11/2018 | 3.4 |
| 08/11/2018 | 3.4 |
| 08/11/2018 | 3.6 |
| 08/11/2018 | 4 |
| 08/11/2018 | 4.8 |
| 08/11/2018 | 5.8 |
| 08/11/2018 | 6.6 |
| 08/11/2018 | 6.6 |
| 08/11/2018 | 7.4 |
| 08/11/2018 | 7.2 |
| 08/11/2018 | 7.2 |
| 08/11/2018 | 7.3 |
| 08/11/2018 | 7.5 |
| 08/11/2018 | 7.5 |
| 08/11/2018 | 8.2 |
| 08/11/2018 | 8.9 |
| 08/11/2018 | 8.3 |
| 08/11/2018 | 7.1 |
| 08/11/2018 | 6.6 |
| 08/11/2018 | 5.8 |
| 08/11/2018 | 5 |
| 08/11/2018 | 4.5 |
| 09/11/2018 | 3.6 |
| 09/11/2018 | 3.7 |
| 09/11/2018 | 3 |
| 09/11/2018 | 3.4 |
| 09/11/2018 | 3.6 |
| 09/11/2018 | 4 |
| 09/11/2018 | 4.7 |
| 09/11/2018 | 6.2 |
| 09/11/2018 | 6.5 |
| 09/11/2018 | 6.7 |
| 09/11/2018 | 6.9 |
| 09/11/2018 | 7.2 |
| 09/11/2018 | 7.5 |
| 09/11/2018 | 7.3 |
| 09/11/2018 | 6.8 |
| 09/11/2018 | 7.3 |
| 09/11/2018 | 8 |
| 09/11/2018 | 8.4 |
| 09/11/2018 | 7.9 |
| 09/11/2018 | 7 |
| 09/11/2018 | 6.2 |
| 09/11/2018 | 5.2 |
| 09/11/2018 | 4.8 |
| 09/11/2018 | 4.1 |
| 10/11/2018 | 3.8 |
| 10/11/2018 | 3.5 |
| 10/11/2018 | 3.4 |
| 10/11/2018 | 3.1 |
| 10/11/2018 | 3 |
| 10/11/2018 | 3.1 |
| 10/11/2018 | 4 |
| 10/11/2018 | 4.3 |
| 10/11/2018 | 5.2 |
| 10/11/2018 | 5.3 |
| 10/11/2018 | 5.9 |
| 10/11/2018 | 5.9 |
| 10/11/2018 | 5.8 |
| 10/11/2018 | 5.6 |
| 10/11/2018 | 5.6 |
| 10/11/2018 | 5.7 |
| 10/11/2018 | 6.3 |
| 10/11/2018 | 7.2 |
| 10/11/2018 | 6.7 |
| 10/11/2018 | 6 |
| 10/11/2018 | 5.3 |
| 10/11/2018 | 4.7 |
| 10/11/2018 | 4.3 |
| 10/11/2018 | 4.1 |
| 11/11/2018 | 3.6 |
| 11/11/2018 | 3.5 |
| 11/11/2018 | 3.3 |
| 11/11/2018 | 3 |
| 11/11/2018 | 3 |
| 11/11/2018 | 3.2 |
| 11/11/2018 | 3.5 |
| 11/11/2018 | 3.7 |
| 11/11/2018 | 4.3 |
| 11/11/2018 | 4.5 |
| 11/11/2018 | 4.8 |
| 11/11/2018 | 5.2 |
| 11/11/2018 | 5 |
| 11/11/2018 | 5.1 |
| 11/11/2018 | 5.2 |
| 11/11/2018 | 5.3 |
| 11/11/2018 | 6 |
| 11/11/2018 | 6.8 |
| 11/11/2018 | 6.6 |
| 11/11/2018 | 5.3 |
| 11/11/2018 | 5.2 |
| 11/11/2018 | 4.8 |
| 11/11/2018 | 4.5 |
| 11/11/2018 | 4.1 |
| 12/11/2018 | 3.7 |
| 12/11/2018 | 3.4 |
| 12/11/2018 | 3.4 |
| 12/11/2018 | 3.3 |
| 12/11/2018 | 3.1 |
| 12/11/2018 | 3.6 |
| 12/11/2018 | 5 |
| 12/11/2018 | 6 |
| 12/11/2018 | 6.9 |
| 12/11/2018 | 7 |
| 12/11/2018 | 7.4 |
| 12/11/2018 | 7.2 |
| 12/11/2018 | 7.2 |
| 12/11/2018 | 7.4 |
| 12/11/2018 | 7.2 |
| 12/11/2018 | 7.3 |
| 12/11/2018 | 8.1 |
| 12/11/2018 | 8.8 |
| 12/11/2018 | 8.5 |
| 12/11/2018 | 7 |
| 12/11/2018 | 6.6 |
| 12/11/2018 | 5.9 |
| 12/11/2018 | 5 |
| 12/11/2018 | 4.4 |
| 13/11/2018 | 4 |
| 13/11/2018 | 3.6 |
| 13/11/2018 | 3.5 |
| 13/11/2018 | 3.4 |
| 13/11/2018 | 3.6 |
| 13/11/2018 | 4.1 |
| 13/11/2018 | 4.9 |
| 13/11/2018 | 6 |
| 13/11/2018 | 6.9 |
| 13/11/2018 | 7 |
| 13/11/2018 | 7.3 |
| 13/11/2018 | 7.6 |
| 13/11/2018 | 7.6 |
| 13/11/2018 | 7.7 |
| 13/11/2018 | 7.5 |
| 13/11/2018 | 7.6 |
| 13/11/2018 | 8.5 |
| 13/11/2018 | 9.3 |
| 13/11/2018 | 8.5 |
| 13/11/2018 | 7.3 |
| 13/11/2018 | 6.3 |
| 13/11/2018 | 5.6 |
| 13/11/2018 | 5.2 |
| 13/11/2018 | 4.5 |
| 14/11/2018 | 4.2 |
| 14/11/2018 | 3.7 |
| 14/11/2018 | 3.6 |
| 14/11/2018 | 3.5 |
| 14/11/2018 | 3.7 |
| 14/11/2018 | 4.2 |
| 14/11/2018 | 5 |
| 14/11/2018 | 6.2 |
| 14/11/2018 | 7 |
| 14/11/2018 | 7.1 |
| 14/11/2018 | 7.5 |
| 14/11/2018 | 7.8 |
| 14/11/2018 | 7.7 |
| 14/11/2018 | 7.8 |
| 14/11/2018 | 7.6 |
| 14/11/2018 | 7.7 |
| 14/11/2018 | 8.7 |
| 14/11/2018 | 9.4 |
| 14/11/2018 | 8.9 |
| 14/11/2018 | 7.6 |
| 14/11/2018 | 6.7 |
| 14/11/2018 | 5.6 |
| 14/11/2018 | 5.2 |
| 14/11/2018 | 4.7 |
| 15/11/2018 | 3.8 |
| 15/11/2018 | 3.8 |
| 15/11/2018 | 3.6 |
| 15/11/2018 | 3.5 |
| 15/11/2018 | 3.8 |
| 15/11/2018 | 4.2 |
| 15/11/2018 | 5 |
| 15/11/2018 | 6.3 |
| 15/11/2018 | 7 |
| 15/11/2018 | 7.1 |
| 15/11/2018 | 7.4 |
| 15/11/2018 | 7.7 |
| 15/11/2018 | 7.7 |
| 15/11/2018 | 7.9 |
| 15/11/2018 | 7.6 |
| 15/11/2018 | 7.7 |
| 15/11/2018 | 8.7 |
| 15/11/2018 | 9.5 |
| 15/11/2018 | 9.1 |
| 15/11/2018 | 7.2 |
| 15/11/2018 | 6.3 |
| 15/11/2018 | 5.7 |
| 15/11/2018 | 5.3 |
| 15/11/2018 | 4.3 |
| 16/11/2018 | 3.9 |
| 16/11/2018 | 3.4 |
| 16/11/2018 | 3.2 |
| 16/11/2018 | 3.6 |
| 16/11/2018 | 3.8 |
| 16/11/2018 | 4.2 |
| 16/11/2018 | 5 |
| 16/11/2018 | 6.1 |
| 16/11/2018 | 7 |
| 16/11/2018 | 7.1 |
| 16/11/2018 | 7.5 |
| 16/11/2018 | 7.7 |
| 16/11/2018 | 7.5 |
| 16/11/2018 | 7.3 |
| 16/11/2018 | 7.4 |
| 16/11/2018 | 7.5 |
| 16/11/2018 | 8.5 |
| 16/11/2018 | 9 |
| 16/11/2018 | 8.7 |
| 16/11/2018 | 7.2 |
| 16/11/2018 | 6.5 |
| 16/11/2018 | 5.6 |
| 16/11/2018 | 5.1 |
| 16/11/2018 | 4.4 |
| 17/11/2018 | 4.1 |
| 17/11/2018 | 3.7 |
| 17/11/2018 | 3.5 |
| 17/11/2018 | 3.2 |
| 17/11/2018 | 3.2 |
| 17/11/2018 | 3.2 |
| 17/11/2018 | 4.1 |
| 17/11/2018 | 4.6 |
| 17/11/2018 | 5 |
| 17/11/2018 | 5.7 |
| 17/11/2018 | 6.3 |
| 17/11/2018 | 6.4 |
| 17/11/2018 | 6.2 |
| 17/11/2018 | 6.1 |
| 17/11/2018 | 6.1 |
| 17/11/2018 | 6.3 |
| 17/11/2018 | 6.6 |
| 17/11/2018 | 7.5 |
| 17/11/2018 | 7.4 |
| 17/11/2018 | 6.1 |
| 17/11/2018 | 5.5 |
| 17/11/2018 | 5 |
| 17/11/2018 | 4.6 |
| 17/11/2018 | 4.4 |
| 18/11/2018 | 3.8 |
| 18/11/2018 | 3.6 |
| 18/11/2018 | 3.4 |
| 18/11/2018 | 3.1 |
| 18/11/2018 | 3.1 |
| 18/11/2018 | 3.3 |
| 18/11/2018 | 3.6 |
| 18/11/2018 | 3.9 |
| 18/11/2018 | 4.5 |
| 18/11/2018 | 4.8 |
| 18/11/2018 | 5 |
| 18/11/2018 | 5.5 |
| 18/11/2018 | 5.4 |
| 18/11/2018 | 5.4 |
| 18/11/2018 | 5.5 |
| 18/11/2018 | 5.2 |
| 18/11/2018 | 6.1 |
| 18/11/2018 | 6.9 |
| 18/11/2018 | 6.6 |
| 18/11/2018 | 5.4 |
| 18/11/2018 | 5.4 |
| 18/11/2018 | 5.1 |
| 18/11/2018 | 4.7 |
| 18/11/2018 | 4.4 |
| 19/11/2018 | 3.8 |
| 19/11/2018 | 3.5 |
| 19/11/2018 | 3 |
| 19/11/2018 | 3.4 |
| 19/11/2018 | 3.2 |
| 19/11/2018 | 3.7 |
| 19/11/2018 | 5.1 |
| 19/11/2018 | 6.3 |
| 19/11/2018 | 6.6 |
| 19/11/2018 | 7.3 |
| 19/11/2018 | 7.2 |
| 19/11/2018 | 7.5 |
| 19/11/2018 | 7.6 |
| 19/11/2018 | 7.3 |
| 19/11/2018 | 7.5 |
| 19/11/2018 | 7.7 |
| 19/11/2018 | 8.3 |
| 19/11/2018 | 8.9 |
| 19/11/2018 | 9 |
| 19/11/2018 | 7.6 |
| 19/11/2018 | 6.8 |
| 19/11/2018 | 5.6 |
| 19/11/2018 | 5.2 |
| 19/11/2018 | 4.6 |
| 20/11/2018 | 4.1 |
| 20/11/2018 | 3.7 |
| 20/11/2018 | 3.5 |
| 20/11/2018 | 3.4 |
| 20/11/2018 | 3.7 |
| 20/11/2018 | 4.1 |
| 20/11/2018 | 5 |
| 20/11/2018 | 6.2 |
| 20/11/2018 | 7 |
| 20/11/2018 | 7.1 |
| 20/11/2018 | 7.5 |
| 20/11/2018 | 7.8 |
| 20/11/2018 | 7.8 |
| 20/11/2018 | 7.4 |
| 20/11/2018 | 7.7 |
| 20/11/2018 | 7.4 |
| 20/11/2018 | 8.6 |
| 20/11/2018 | 9.2 |
| 20/11/2018 | 8.7 |
| 20/11/2018 | 7.3 |
| 20/11/2018 | 6.4 |
| 20/11/2018 | 5.8 |
| 20/11/2018 | 5.3 |
| 20/11/2018 | 4.7 |
| 21/11/2018 | 3.8 |
| 21/11/2018 | 3.8 |
| 21/11/2018 | 3.6 |
| 21/11/2018 | 3.5 |
| 21/11/2018 | 3.7 |
| 21/11/2018 | 4.2 |
| 21/11/2018 | 5 |
| 21/11/2018 | 6.2 |
| 21/11/2018 | 7.1 |
| 21/11/2018 | 7.2 |
| 21/11/2018 | 7.6 |
| 21/11/2018 | 7.4 |
| 21/11/2018 | 7.8 |
| 21/11/2018 | 7.4 |
| 21/11/2018 | 7.7 |
| 21/11/2018 | 7.4 |
| 21/11/2018 | 8.6 |
| 21/11/2018 | 9.1 |
| 21/11/2018 | 9 |
| 21/11/2018 | 7.6 |
| 21/11/2018 | 6.8 |
| 21/11/2018 | 5.7 |
| 21/11/2018 | 4.9 |
| 21/11/2018 | 4.3 |
| 22/11/2018 | 3.8 |
| 22/11/2018 | 3.3 |
| 22/11/2018 | 3.1 |
| 22/11/2018 | 3.5 |
| 22/11/2018 | 3.7 |
| 22/11/2018 | 4.2 |
| 22/11/2018 | 4.9 |
| 22/11/2018 | 6.2 |
| 22/11/2018 | 7 |
| 22/11/2018 | 7.1 |
| 22/11/2018 | 7.4 |
| 22/11/2018 | 7.8 |
| 22/11/2018 | 7.8 |
| 22/11/2018 | 7.4 |
| 22/11/2018 | 7.6 |
| 22/11/2018 | 7.8 |
| 22/11/2018 | 8.5 |
| 22/11/2018 | 9.1 |
| 22/11/2018 | 8.5 |
| 22/11/2018 | 7.2 |
| 22/11/2018 | 6.4 |
| 22/11/2018 | 5.8 |
| 22/11/2018 | 4.9 |
| 22/11/2018 | 4.4 |
| 23/11/2018 | 3.9 |
| 23/11/2018 | 3.3 |
| 23/11/2018 | 3.1 |
| 23/11/2018 | 3.5 |
| 23/11/2018 | 3.7 |
| 23/11/2018 | 4.1 |
| 23/11/2018 | 4.8 |
| 23/11/2018 | 6 |
| 23/11/2018 | 6.9 |
| 23/11/2018 | 7.1 |
| 23/11/2018 | 7.4 |
| 23/11/2018 | 7.2 |
| 23/11/2018 | 7.5 |
| 23/11/2018 | 7.3 |
| 23/11/2018 | 7.3 |
| 23/11/2018 | 7.5 |
| 23/11/2018 | 8.1 |
| 23/11/2018 | 8.8 |
| 23/11/2018 | 8 |
| 23/11/2018 | 7.1 |
| 23/11/2018 | 6 |
| 23/11/2018 | 5.6 |
| 23/11/2018 | 5.1 |
| 23/11/2018 | 4.4 |
| 24/11/2018 | 4 |
| 24/11/2018 | 3.7 |
| 24/11/2018 | 3.5 |
| 24/11/2018 | 3.2 |
| 24/11/2018 | 3.1 |
| 24/11/2018 | 3.1 |
| 24/11/2018 | 4 |
| 24/11/2018 | 4.5 |
| 24/11/2018 | 4.9 |
| 24/11/2018 | 5.6 |
| 24/11/2018 | 5.7 |
| 24/11/2018 | 5.8 |
| 24/11/2018 | 6.1 |
| 24/11/2018 | 5.9 |
| 24/11/2018 | 5.5 |
| 24/11/2018 | 5.7 |
| 24/11/2018 | 6.2 |
| 24/11/2018 | 6.8 |
| 24/11/2018 | 6.6 |
| 24/11/2018 | 6.1 |
| 24/11/2018 | 5.5 |
| 24/11/2018 | 5 |
| 24/11/2018 | 4.6 |
| 24/11/2018 | 4.4 |
| 25/11/2018 | 3.8 |
| 25/11/2018 | 3.5 |
| 25/11/2018 | 2.9 |
| 25/11/2018 | 3.1 |
| 25/11/2018 | 3 |
| 25/11/2018 | 3.2 |
| 25/11/2018 | 3.4 |
| 25/11/2018 | 3.8 |
| 25/11/2018 | 4.4 |
| 25/11/2018 | 4.7 |
| 25/11/2018 | 5 |
| 25/11/2018 | 4.9 |
| 25/11/2018 | 5.3 |
| 25/11/2018 | 5.3 |
| 25/11/2018 | 4.9 |
| 25/11/2018 | 5.2 |
| 25/11/2018 | 5.7 |
| 25/11/2018 | 6.2 |
| 25/11/2018 | 6.3 |
| 25/11/2018 | 5.8 |
| 25/11/2018 | 5.4 |
| 25/11/2018 | 5.1 |
| 25/11/2018 | 4.7 |
| 25/11/2018 | 3.8 |
| 26/11/2018 | 3.8 |
| 26/11/2018 | 3.5 |
| 26/11/2018 | 2.9 |
| 26/11/2018 | 3.3 |
| 26/11/2018 | 3.1 |
| 26/11/2018 | 3.6 |
| 26/11/2018 | 4.9 |
| 26/11/2018 | 6.1 |
| 26/11/2018 | 6.4 |
| 26/11/2018 | 6.7 |
| 26/11/2018 | 7.1 |
| 26/11/2018 | 7.4 |
| 26/11/2018 | 7.5 |
| 26/11/2018 | 7.1 |
| 26/11/2018 | 6.9 |
| 26/11/2018 | 7.1 |
| 26/11/2018 | 7.9 |
| 26/11/2018 | 8.7 |
| 26/11/2018 | 8.1 |
| 26/11/2018 | 7.5 |
| 26/11/2018 | 6.3 |
| 26/11/2018 | 5.6 |
| 26/11/2018 | 4.7 |
| 26/11/2018 | 4.1 |
| 27/11/2018 | 3.6 |
| 27/11/2018 | 3.6 |
| 27/11/2018 | 3.5 |
| 27/11/2018 | 3.4 |
| 27/11/2018 | 3.6 |
| 27/11/2018 | 4 |
| 27/11/2018 | 4.8 |
| 27/11/2018 | 6 |
| 27/11/2018 | 6.4 |
| 27/11/2018 | 7 |
| 27/11/2018 | 7.3 |
| 27/11/2018 | 7.2 |
| 27/11/2018 | 7.2 |
| 27/11/2018 | 7.3 |
| 27/11/2018 | 7.1 |
| 27/11/2018 | 7.4 |
| 27/11/2018 | 8.1 |
| 27/11/2018 | 8.4 |
| 27/11/2018 | 8.4 |
| 27/11/2018 | 7.2 |
| 27/11/2018 | 6.4 |
| 27/11/2018 | 5.8 |
| 27/11/2018 | 4.8 |
| 27/11/2018 | 4.2 |
| 28/11/2018 | 3.7 |
| 28/11/2018 | 3.2 |
| 28/11/2018 | 3 |
| 28/11/2018 | 3.4 |
| 28/11/2018 | 3.6 |
| 28/11/2018 | 4.1 |
| 28/11/2018 | 4.8 |
| 28/11/2018 | 6.1 |
| 28/11/2018 | 6.4 |
| 28/11/2018 | 7.1 |
| 28/11/2018 | 7.5 |
| 28/11/2018 | 7.3 |
| 28/11/2018 | 7.2 |
| 28/11/2018 | 7.3 |
| 28/11/2018 | 7.1 |
| 28/11/2018 | 7.4 |
| 28/11/2018 | 8.2 |
| 28/11/2018 | 8.4 |
| 28/11/2018 | 8.1 |
| 28/11/2018 | 7.5 |
| 28/11/2018 | 6.3 |
| 28/11/2018 | 5.7 |
| 28/11/2018 | 4.9 |
| 28/11/2018 | 4.2 |
| 29/11/2018 | 3.7 |
| 29/11/2018 | 3.2 |
| 29/11/2018 | 3 |
| 29/11/2018 | 3.4 |
| 29/11/2018 | 3.6 |
| 29/11/2018 | 4 |
| 29/11/2018 | 4.8 |
| 29/11/2018 | 6.1 |
| 29/11/2018 | 6.3 |
| 29/11/2018 | 7 |
| 29/11/2018 | 7.3 |
| 29/11/2018 | 7.1 |
| 29/11/2018 | 7.2 |
| 29/11/2018 | 7.2 |
| 29/11/2018 | 7 |
| 29/11/2018 | 7.3 |
| 29/11/2018 | 8.1 |
| 29/11/2018 | 8.3 |
| 29/11/2018 | 8.2 |
| 29/11/2018 | 7.1 |
| 29/11/2018 | 6.4 |
| 29/11/2018 | 5.8 |
| 29/11/2018 | 4.9 |
| 29/11/2018 | 4.3 |
| 30/11/2018 | 3.8 |
| 30/11/2018 | 3.3 |
| 30/11/2018 | 3.1 |
| 30/11/2018 | 3.5 |
| 30/11/2018 | 3.6 |
| 30/11/2018 | 4 |
| 30/11/2018 | 4.7 |
| 30/11/2018 | 5.9 |
| 30/11/2018 | 6.2 |
| 30/11/2018 | 6.9 |
| 30/11/2018 | 6.8 |
| 30/11/2018 | 7.1 |
| 30/11/2018 | 7.4 |
| 30/11/2018 | 7.1 |
| 30/11/2018 | 6.7 |
| 30/11/2018 | 6.9 |
| 30/11/2018 | 7.7 |
| 30/11/2018 | 8.1 |
| 30/11/2018 | 7.6 |
| 30/11/2018 | 7 |
| 30/11/2018 | 6 |
| 30/11/2018 | 5.6 |
| 30/11/2018 | 4.6 |
| 30/11/2018 | 4.4 |
| 01/12/2018 | 4 |
| 01/12/2018 | 3.6 |
| 01/12/2018 | 3.4 |
| 01/12/2018 | 3.1 |
| 01/12/2018 | 3 |
| 01/12/2018 | 3 |
| 01/12/2018 | 3.9 |
| 01/12/2018 | 4.4 |
| 01/12/2018 | 4.7 |
| 01/12/2018 | 5.5 |
| 01/12/2018 | 5.6 |
| 01/12/2018 | 5.7 |
| 01/12/2018 | 5.5 |
| 01/12/2018 | 5.3 |
| 01/12/2018 | 5.4 |
| 01/12/2018 | 5.7 |
| 01/12/2018 | 6.2 |
| 01/12/2018 | 6.6 |
| 01/12/2018 | 6.3 |
| 01/12/2018 | 6 |
| 01/12/2018 | 5.5 |
| 01/12/2018 | 5 |
| 01/12/2018 | 4.6 |
| 01/12/2018 | 3.8 |
| 02/12/2018 | 3.7 |
| 02/12/2018 | 3.5 |
| 02/12/2018 | 2.8 |
| 02/12/2018 | 3 |
| 02/12/2018 | 2.9 |
| 02/12/2018 | 3.1 |
| 02/12/2018 | 3.3 |
| 02/12/2018 | 3.7 |
| 02/12/2018 | 3.8 |
| 02/12/2018 | 4.6 |
| 02/12/2018 | 4.9 |
| 02/12/2018 | 4.9 |
| 02/12/2018 | 5.2 |
| 02/12/2018 | 4.7 |
| 02/12/2018 | 4.8 |
| 02/12/2018 | 4.7 |
| 02/12/2018 | 5.2 |
| 02/12/2018 | 6 |
| 02/12/2018 | 6 |
| 02/12/2018 | 5.8 |
| 02/12/2018 | 5.4 |
| 02/12/2018 | 4.6 |
| 02/12/2018 | 4.2 |
| 02/12/2018 | 3.8 |
| 03/12/2018 | 3.7 |
| 03/12/2018 | 3.4 |
| 03/12/2018 | 2.9 |
| 03/12/2018 | 3.3 |
| 03/12/2018 | 3 |
| 03/12/2018 | 3.5 |
| 03/12/2018 | 4.7 |
| 03/12/2018 | 5.4 |
| 03/12/2018 | 6.3 |
| 03/12/2018 | 6.6 |
| 03/12/2018 | 6.9 |
| 03/12/2018 | 6.8 |
| 03/12/2018 | 6.9 |
| 03/12/2018 | 7 |
| 03/12/2018 | 6.8 |
| 03/12/2018 | 7.1 |
| 03/12/2018 | 7.4 |
| 03/12/2018 | 8 |
| 03/12/2018 | 7.8 |
| 03/12/2018 | 7.5 |
| 03/12/2018 | 6.3 |
| 03/12/2018 | 5.6 |
| 03/12/2018 | 4.7 |
| 03/12/2018 | 4.1 |
| 04/12/2018 | 3.5 |
| 04/12/2018 | 3.1 |
| 04/12/2018 | 2.9 |
| 04/12/2018 | 3.3 |
| 04/12/2018 | 3.5 |
| 04/12/2018 | 3.9 |
| 04/12/2018 | 4.6 |
| 04/12/2018 | 5.8 |
| 04/12/2018 | 6.2 |
| 04/12/2018 | 6.9 |
| 04/12/2018 | 6.7 |
| 04/12/2018 | 7.1 |
| 04/12/2018 | 7.1 |
| 04/12/2018 | 7.1 |
| 04/12/2018 | 6.9 |
| 04/12/2018 | 6.8 |
| 04/12/2018 | 7.7 |
| 04/12/2018 | 7.7 |
| 04/12/2018 | 8.1 |
| 04/12/2018 | 7.2 |
| 04/12/2018 | 6.5 |
| 04/12/2018 | 5.8 |
| 04/12/2018 | 4.8 |
| 04/12/2018 | 4.1 |
| 05/12/2018 | 3.7 |
| 05/12/2018 | 3.1 |
| 05/12/2018 | 3 |
| 05/12/2018 | 3.4 |
| 05/12/2018 | 3.6 |
| 05/12/2018 | 4 |
| 05/12/2018 | 4.6 |
| 05/12/2018 | 5.9 |
| 05/12/2018 | 6.3 |
| 05/12/2018 | 6.5 |
| 05/12/2018 | 6.8 |
| 05/12/2018 | 7.2 |
| 05/12/2018 | 7.1 |
| 05/12/2018 | 7.2 |
| 05/12/2018 | 6.9 |
| 05/12/2018 | 6.8 |
| 05/12/2018 | 7.8 |
| 05/12/2018 | 8.1 |
| 05/12/2018 | 7.8 |
| 05/12/2018 | 7.5 |
| 05/12/2018 | 6.3 |
| 05/12/2018 | 5.7 |
| 05/12/2018 | 4.9 |
| 05/12/2018 | 4.2 |
| 06/12/2018 | 3.7 |
| 06/12/2018 | 3.2 |
| 06/12/2018 | 3 |
| 06/12/2018 | 3.4 |
| 06/12/2018 | 3.1 |
| 06/12/2018 | 3.9 |
| 06/12/2018 | 4.6 |
| 06/12/2018 | 5.9 |
| 06/12/2018 | 6.2 |
| 06/12/2018 | 6.4 |
| 06/12/2018 | 6.7 |
| 06/12/2018 | 7 |
| 06/12/2018 | 7.1 |
| 06/12/2018 | 7.1 |
| 06/12/2018 | 6.9 |
| 06/12/2018 | 6.7 |
| 06/12/2018 | 7.7 |
| 06/12/2018 | 7.6 |
| 06/12/2018 | 7.8 |
| 06/12/2018 | 7 |
| 06/12/2018 | 6.4 |
| 06/12/2018 | 5.7 |
| 06/12/2018 | 4.9 |
| 06/12/2018 | 4.3 |
| 07/12/2018 | 3.8 |
| 07/12/2018 | 3.2 |
| 07/12/2018 | 3 |
| 07/12/2018 | 3.4 |
| 07/12/2018 | 3.1 |
| 07/12/2018 | 3.9 |
| 07/12/2018 | 4.5 |
| 07/12/2018 | 5.7 |
| 07/12/2018 | 6.1 |
| 07/12/2018 | 6.3 |
| 07/12/2018 | 6.6 |
| 07/12/2018 | 6.9 |
| 07/12/2018 | 6.8 |
| 07/12/2018 | 6.5 |
| 07/12/2018 | 6.6 |
| 07/12/2018 | 6.9 |
| 07/12/2018 | 7.3 |
| 07/12/2018 | 7.3 |
| 07/12/2018 | 7.3 |
| 07/12/2018 | 7 |
| 07/12/2018 | 6 |
| 07/12/2018 | 5.1 |
| 07/12/2018 | 4.6 |
| 07/12/2018 | 3.9 |
| 08/12/2018 | 3.4 |
| 08/12/2018 | 3.5 |
| 08/12/2018 | 3.3 |
| 08/12/2018 | 3 |
| 08/12/2018 | 3 |
| 08/12/2018 | 3 |
| 08/12/2018 | 3.7 |
| 08/12/2018 | 3.8 |
| 08/12/2018 | 4.6 |
| 08/12/2018 | 4.9 |
| 08/12/2018 | 5.5 |
| 08/12/2018 | 5.6 |
| 08/12/2018 | 5.4 |
| 08/12/2018 | 5.2 |
| 08/12/2018 | 5.3 |
| 08/12/2018 | 5.1 |
| 08/12/2018 | 5.8 |
| 08/12/2018 | 5.9 |
| 08/12/2018 | 6 |
| 08/12/2018 | 5.9 |
| 08/12/2018 | 5.5 |
| 08/12/2018 | 4.5 |
| 08/12/2018 | 4.1 |
| 08/12/2018 | 3.8 |
| 09/12/2018 | 3.7 |
| 09/12/2018 | 2.9 |
| 09/12/2018 | 2.7 |
| 09/12/2018 | 2.9 |
| 09/12/2018 | 2.8 |
| 09/12/2018 | 3 |
| 09/12/2018 | 3.2 |
| 09/12/2018 | 3.6 |
| 09/12/2018 | 3.7 |
| 09/12/2018 | 4.5 |
| 09/12/2018 | 4.8 |
| 09/12/2018 | 4.8 |
| 09/12/2018 | 4.6 |
| 09/12/2018 | 4.6 |
| 09/12/2018 | 4.7 |
| 09/12/2018 | 4.6 |
| 09/12/2018 | 5.3 |
| 09/12/2018 | 5.3 |
| 09/12/2018 | 5.8 |
| 09/12/2018 | 5.7 |
| 09/12/2018 | 4.9 |
| 09/12/2018 | 4.5 |
| 09/12/2018 | 4.2 |
| 09/12/2018 | 3.8 |
| 10/12/2018 | 3.7 |
| 10/12/2018 | 3.4 |
| 10/12/2018 | 2.8 |
| 10/12/2018 | 2.7 |
| 10/12/2018 | 2.9 |
| 10/12/2018 | 3.3 |
| 10/12/2018 | 4.6 |
| 10/12/2018 | 5.3 |
| 10/12/2018 | 6.1 |
| 10/12/2018 | 6.4 |
| 10/12/2018 | 6.8 |
| 10/12/2018 | 6.7 |
| 10/12/2018 | 6.8 |
| 10/12/2018 | 6.4 |
| 10/12/2018 | 6.7 |
| 10/12/2018 | 6.5 |
| 10/12/2018 | 7 |
| 10/12/2018 | 7.2 |
| 10/12/2018 | 7.5 |
| 10/12/2018 | 7.4 |
| 10/12/2018 | 6.3 |
| 10/12/2018 | 5.6 |
| 10/12/2018 | 4.7 |
| 10/12/2018 | 4 |
| 11/12/2018 | 3.5 |
| 11/12/2018 | 3 |
| 11/12/2018 | 2.8 |
| 11/12/2018 | 3.2 |
| 11/12/2018 | 3.4 |
| 11/12/2018 | 3.8 |
| 11/12/2018 | 4.4 |
| 11/12/2018 | 5.7 |
| 11/12/2018 | 6.1 |
| 11/12/2018 | 6.3 |
| 11/12/2018 | 6.6 |
| 11/12/2018 | 6.9 |
| 11/12/2018 | 7 |
| 11/12/2018 | 6.5 |
| 11/12/2018 | 6.8 |
| 11/12/2018 | 6.8 |
| 11/12/2018 | 7.3 |
| 11/12/2018 | 7 |
| 11/12/2018 | 7.2 |
| 11/12/2018 | 7.1 |
| 11/12/2018 | 6.5 |
| 11/12/2018 | 5.3 |
| 11/12/2018 | 4.8 |
| 11/12/2018 | 4.1 |
| 12/12/2018 | 3.6 |
| 12/12/2018 | 3.1 |
| 12/12/2018 | 2.9 |
| 12/12/2018 | 3.3 |
| 12/12/2018 | 3.5 |
| 12/12/2018 | 3.9 |
| 12/12/2018 | 4.5 |
| 12/12/2018 | 5.2 |
| 12/12/2018 | 6.1 |
| 12/12/2018 | 6.4 |
| 12/12/2018 | 6.7 |
| 12/12/2018 | 7.1 |
| 12/12/2018 | 7 |
| 12/12/2018 | 6.5 |
| 12/12/2018 | 6.8 |
| 12/12/2018 | 6.8 |
| 12/12/2018 | 7.3 |
| 12/12/2018 | 7.4 |
| 12/12/2018 | 7.5 |
| 12/12/2018 | 7.4 |
| 12/12/2018 | 6.4 |
| 12/12/2018 | 5.7 |
| 12/12/2018 | 4.9 |
| 12/12/2018 | 4.2 |
| 13/12/2018 | 3.6 |
| 13/12/2018 | 3.1 |
| 13/12/2018 | 2.9 |
| 13/12/2018 | 2.8 |
| 13/12/2018 | 3 |
| 13/12/2018 | 3.8 |
| 13/12/2018 | 4.4 |
| 13/12/2018 | 5.2 |
| 13/12/2018 | 6 |
| 13/12/2018 | 6.2 |
| 13/12/2018 | 6.6 |
| 13/12/2018 | 6.9 |
| 13/12/2018 | 7 |
| 13/12/2018 | 6.5 |
| 13/12/2018 | 6.7 |
| 13/12/2018 | 6.7 |
| 13/12/2018 | 7.2 |
| 13/12/2018 | 7.3 |
| 13/12/2018 | 7.5 |
| 13/12/2018 | 7.5 |
| 13/12/2018 | 6.4 |
| 13/12/2018 | 5.2 |
| 13/12/2018 | 4.9 |
| 13/12/2018 | 4.3 |
| 14/12/2018 | 3.7 |
| 14/12/2018 | 3.1 |
| 14/12/2018 | 3 |
| 14/12/2018 | 2.8 |
| 14/12/2018 | 3 |
| 14/12/2018 | 3.8 |
| 14/12/2018 | 4.3 |
| 14/12/2018 | 5.5 |
| 14/12/2018 | 5.9 |
| 14/12/2018 | 6.2 |
| 14/12/2018 | 6.5 |
| 14/12/2018 | 6.3 |
| 14/12/2018 | 6.7 |
| 14/12/2018 | 6.4 |
| 14/12/2018 | 6.5 |
| 14/12/2018 | 6.3 |
| 14/12/2018 | 6.9 |
| 14/12/2018 | 6.6 |
| 14/12/2018 | 7 |
| 14/12/2018 | 6.9 |
| 14/12/2018 | 6 |
| 14/12/2018 | 5.1 |
| 14/12/2018 | 4.6 |
| 14/12/2018 | 3.8 |
| 15/12/2018 | 3.3 |
| 15/12/2018 | 3 |
| 15/12/2018 | 3.3 |
| 15/12/2018 | 3 |
| 15/12/2018 | 2.9 |
| 15/12/2018 | 2.9 |
| 15/12/2018 | 3.6 |
| 15/12/2018 | 3.7 |
| 15/12/2018 | 4.5 |
| 15/12/2018 | 4.8 |
| 15/12/2018 | 5.4 |
| 15/12/2018 | 5.5 |
| 15/12/2018 | 5.4 |
| 15/12/2018 | 5.1 |
| 15/12/2018 | 4.7 |
| 15/12/2018 | 5.1 |
| 15/12/2018 | 5.4 |
| 15/12/2018 | 5.2 |
| 15/12/2018 | 5.7 |
| 15/12/2018 | 5.9 |
| 15/12/2018 | 5.5 |
| 15/12/2018 | 4.5 |
| 15/12/2018 | 4.1 |
| 15/12/2018 | 3.8 |
| 16/12/2018 | 3.1 |
| 16/12/2018 | 2.9 |
| 16/12/2018 | 2.7 |
| 16/12/2018 | 2.9 |
| 16/12/2018 | 2.8 |
| 16/12/2018 | 2.9 |
| 16/12/2018 | 3.1 |
| 16/12/2018 | 3.5 |
| 16/12/2018 | 3.6 |
| 16/12/2018 | 3.9 |
| 16/12/2018 | 4.2 |
| 16/12/2018 | 4.7 |
| 16/12/2018 | 4.6 |
| 16/12/2018 | 4.5 |
| 16/12/2018 | 4.1 |
| 16/12/2018 | 4.6 |
| 16/12/2018 | 4.9 |
| 16/12/2018 | 4.6 |
| 16/12/2018 | 5.5 |
| 16/12/2018 | 5.6 |
| 16/12/2018 | 4.9 |
| 16/12/2018 | 4.5 |
| 16/12/2018 | 4.2 |
| 16/12/2018 | 3.8 |
| 17/12/2018 | 3.1 |
| 17/12/2018 | 2.8 |
| 17/12/2018 | 2.7 |
| 17/12/2018 | 2.7 |
| 17/12/2018 | 2.9 |
| 17/12/2018 | 3.7 |
| 17/12/2018 | 4.4 |
| 17/12/2018 | 5.1 |
| 17/12/2018 | 5.5 |
| 17/12/2018 | 6.3 |
| 17/12/2018 | 6.2 |
| 17/12/2018 | 6.6 |
| 17/12/2018 | 6.7 |
| 17/12/2018 | 6.2 |
| 17/12/2018 | 6 |
| 17/12/2018 | 6.5 |
| 17/12/2018 | 6.6 |
| 17/12/2018 | 6.5 |
| 17/12/2018 | 7.1 |
| 17/12/2018 | 7.3 |
| 17/12/2018 | 6.3 |
| 17/12/2018 | 5.1 |
| 17/12/2018 | 4.7 |
| 17/12/2018 | 4 |
| 18/12/2018 | 3.4 |
| 18/12/2018 | 2.9 |
| 18/12/2018 | 2.8 |
| 18/12/2018 | 3.2 |
| 18/12/2018 | 3.4 |
| 18/12/2018 | 3.7 |
| 18/12/2018 | 4.3 |
| 18/12/2018 | 5 |
| 18/12/2018 | 5.9 |
| 18/12/2018 | 6.2 |
| 18/12/2018 | 6.4 |
| 18/12/2018 | 6.3 |
| 18/12/2018 | 6.4 |
| 18/12/2018 | 6.4 |
| 18/12/2018 | 6.2 |
| 18/12/2018 | 6.2 |
| 18/12/2018 | 6.9 |
| 18/12/2018 | 6.7 |
| 18/12/2018 | 6.9 |
| 18/12/2018 | 7 |
| 18/12/2018 | 6.5 |
| 18/12/2018 | 5.3 |
| 18/12/2018 | 4.8 |
| 18/12/2018 | 4.1 |
| 19/12/2018 | 3.5 |
| 19/12/2018 | 3 |
| 19/12/2018 | 2.8 |
| 19/12/2018 | 3.2 |
| 19/12/2018 | 3.4 |
| 19/12/2018 | 3.7 |
| 19/12/2018 | 4.3 |
| 19/12/2018 | 5.1 |
| 19/12/2018 | 6 |
| 19/12/2018 | 6.2 |
| 19/12/2018 | 6.6 |
| 19/12/2018 | 6.4 |
| 19/12/2018 | 6.4 |
| 19/12/2018 | 6.4 |
| 19/12/2018 | 6.2 |
| 19/12/2018 | 6.2 |
| 19/12/2018 | 6.9 |
| 19/12/2018 | 6.6 |
| 19/12/2018 | 7.1 |
| 19/12/2018 | 7.3 |
| 19/12/2018 | 6.4 |
| 19/12/2018 | 5.2 |
| 19/12/2018 | 4.4 |
| 19/12/2018 | 4.1 |
| 20/12/2018 | 3.6 |
| 20/12/2018 | 3 |
| 20/12/2018 | 2.9 |
| 20/12/2018 | 2.7 |
| 20/12/2018 | 2.9 |
| 20/12/2018 | 3.7 |
| 20/12/2018 | 4.3 |
| 20/12/2018 | 5.1 |
| 20/12/2018 | 5.9 |
| 20/12/2018 | 6.1 |
| 20/12/2018 | 6.4 |
| 20/12/2018 | 6.3 |
| 20/12/2018 | 6.3 |
| 20/12/2018 | 6.4 |
| 20/12/2018 | 6.1 |
| 20/12/2018 | 6.1 |
| 20/12/2018 | 6.8 |
| 20/12/2018 | 6.6 |
| 20/12/2018 | 6.7 |
| 20/12/2018 | 7.4 |
| 20/12/2018 | 6.4 |
| 20/12/2018 | 5.2 |
| 20/12/2018 | 4.4 |
| 20/12/2018 | 3.7 |
| 21/12/2018 | 3.7 |
| 21/12/2018 | 3.1 |
| 21/12/2018 | 2.9 |
| 21/12/2018 | 2.8 |
| 21/12/2018 | 2.9 |
| 21/12/2018 | 3.7 |
| 21/12/2018 | 4.1 |
| 21/12/2018 | 4.9 |
| 21/12/2018 | 5.8 |
| 21/12/2018 | 6.1 |
| 21/12/2018 | 6.4 |
| 21/12/2018 | 6.2 |
| 21/12/2018 | 6.6 |
| 21/12/2018 | 6.2 |
| 21/12/2018 | 5.9 |
| 21/12/2018 | 6.3 |
| 21/12/2018 | 6.4 |
| 21/12/2018 | 5.9 |
| 21/12/2018 | 6.7 |
| 21/12/2018 | 6.8 |
| 21/12/2018 | 6 |
| 21/12/2018 | 5.1 |
| 21/12/2018 | 4.6 |
| 21/12/2018 | 3.8 |
| 22/12/2018 | 3.3 |
| 22/12/2018 | 2.9 |
| 22/12/2018 | 2.7 |
| 22/12/2018 | 2.9 |
| 22/12/2018 | 2.8 |
| 22/12/2018 | 2.8 |
| 22/12/2018 | 3 |
| 22/12/2018 | 3.5 |
| 22/12/2018 | 3.9 |
| 22/12/2018 | 4.7 |
| 22/12/2018 | 4.8 |
| 22/12/2018 | 4.9 |
| 22/12/2018 | 4.8 |
| 22/12/2018 | 5 |
| 22/12/2018 | 4.6 |
| 22/12/2018 | 4.6 |
| 22/12/2018 | 4.9 |
| 22/12/2018 | 5 |
| 22/12/2018 | 5.5 |
| 22/12/2018 | 5.8 |
| 22/12/2018 | 5 |
| 22/12/2018 | 4.5 |
| 22/12/2018 | 4.1 |
| 22/12/2018 | 3.8 |
| 23/12/2018 | 3.1 |
| 23/12/2018 | 2.8 |
| 23/12/2018 | 2.6 |
| 23/12/2018 | 2.8 |
| 23/12/2018 | 2.7 |
| 23/12/2018 | 2.8 |
| 23/12/2018 | 3 |
| 23/12/2018 | 2.9 |
| 23/12/2018 | 3.5 |
| 23/12/2018 | 3.8 |
| 23/12/2018 | 4.1 |
| 23/12/2018 | 4.1 |
| 23/12/2018 | 4.5 |
| 23/12/2018 | 4.4 |
| 23/12/2018 | 4 |
| 23/12/2018 | 4 |
| 23/12/2018 | 4.4 |
| 23/12/2018 | 4.5 |
| 23/12/2018 | 4.7 |
| 23/12/2018 | 5.6 |
| 23/12/2018 | 4.9 |
| 23/12/2018 | 4.5 |
| 23/12/2018 | 4.2 |
| 23/12/2018 | 3.7 |
| 24/12/2018 | 3.5 |
| 24/12/2018 | 2.9 |
| 24/12/2018 | 2.9 |
| 24/12/2018 | 3 |
| 24/12/2018 | 2.6 |
| 24/12/2018 | 2.7 |
| 24/12/2018 | 3.4 |
| 24/12/2018 | 3.8 |
| 24/12/2018 | 4.2 |
| 24/12/2018 | 5 |
| 24/12/2018 | 5.3 |
| 24/12/2018 | 5.2 |
| 24/12/2018 | 5.4 |
| 24/12/2018 | 4.8 |
| 24/12/2018 | 4.4 |
| 24/12/2018 | 4.6 |
| 24/12/2018 | 4.9 |
| 24/12/2018 | 4.7 |
| 24/12/2018 | 4.8 |
| 24/12/2018 | 4.2 |
| 24/12/2018 | 3.9 |
| 24/12/2018 | 4 |
| 24/12/2018 | 3.7 |
| 24/12/2018 | 3.5 |
| 25/12/2018 | 3.2 |
| 25/12/2018 | 2.9 |
| 25/12/2018 | 2.7 |
| 25/12/2018 | 2.5 |
| 25/12/2018 | 2.5 |
| 25/12/2018 | 2.8 |
| 25/12/2018 | 2.7 |
| 25/12/2018 | 3.1 |
| 25/12/2018 | 3.3 |
| 25/12/2018 | 3.7 |
| 25/12/2018 | 4.4 |
| 25/12/2018 | 4.5 |
| 25/12/2018 | 4.6 |
| 25/12/2018 | 4.5 |
| 25/12/2018 | 4.4 |
| 25/12/2018 | 3.9 |
| 25/12/2018 | 4.3 |
| 25/12/2018 | 4.5 |
| 25/12/2018 | 4.7 |
| 25/12/2018 | 4.5 |
| 25/12/2018 | 4.4 |
| 25/12/2018 | 3.7 |
| 25/12/2018 | 3.7 |
| 25/12/2018 | 3.3 |
| 26/12/2018 | 3.2 |
| 26/12/2018 | 2.9 |
| 26/12/2018 | 2.7 |
| 26/12/2018 | 2.4 |
| 26/12/2018 | 2.5 |
| 26/12/2018 | 2.8 |
| 26/12/2018 | 2.7 |
| 26/12/2018 | 3.1 |
| 26/12/2018 | 3.3 |
| 26/12/2018 | 3.7 |
| 26/12/2018 | 4.4 |
| 26/12/2018 | 4.5 |
| 26/12/2018 | 4.6 |
| 26/12/2018 | 4.5 |
| 26/12/2018 | 3.9 |
| 26/12/2018 | 3.9 |
| 26/12/2018 | 4.3 |
| 26/12/2018 | 4.5 |
| 26/12/2018 | 4.6 |
| 26/12/2018 | 4.5 |
| 26/12/2018 | 4.4 |
| 26/12/2018 | 3.7 |
| 26/12/2018 | 3.7 |
| 26/12/2018 | 3.3 |
| 27/12/2018 | 3.2 |
| 27/12/2018 | 2.8 |
| 27/12/2018 | 2.7 |
| 27/12/2018 | 3 |
| 27/12/2018 | 3 |
| 27/12/2018 | 3.1 |
| 27/12/2018 | 3.8 |
| 27/12/2018 | 4.4 |
| 27/12/2018 | 5.1 |
| 27/12/2018 | 5.5 |
| 27/12/2018 | 5.5 |
| 27/12/2018 | 6 |
| 27/12/2018 | 5.9 |
| 27/12/2018 | 5.8 |
| 27/12/2018 | 5.5 |
| 27/12/2018 | 5.8 |
| 27/12/2018 | 5.9 |
| 27/12/2018 | 6.4 |
| 27/12/2018 | 6.4 |
| 27/12/2018 | 6.3 |
| 27/12/2018 | 5.6 |
| 27/12/2018 | 5 |
| 27/12/2018 | 4.6 |
| 27/12/2018 | 4.1 |
| 28/12/2018 | 3.2 |
| 28/12/2018 | 2.8 |
| 28/12/2018 | 2.7 |
| 28/12/2018 | 3 |
| 28/12/2018 | 3 |
| 28/12/2018 | 3.1 |
| 28/12/2018 | 3.8 |
| 28/12/2018 | 4.4 |
| 28/12/2018 | 5.1 |
| 28/12/2018 | 5.5 |
| 28/12/2018 | 5.5 |
| 28/12/2018 | 5.9 |
| 28/12/2018 | 5.9 |
| 28/12/2018 | 5.8 |
| 28/12/2018 | 5.4 |
| 28/12/2018 | 5.8 |
| 28/12/2018 | 5.9 |
| 28/12/2018 | 6.4 |
| 28/12/2018 | 6.3 |
| 28/12/2018 | 6.3 |
| 28/12/2018 | 5.6 |
| 28/12/2018 | 5 |
| 28/12/2018 | 4.6 |
| 28/12/2018 | 4.1 |
| 29/12/2018 | 3.2 |
| 29/12/2018 | 2.8 |
| 29/12/2018 | 2.7 |
| 29/12/2018 | 3 |
| 29/12/2018 | 3 |
| 29/12/2018 | 3.1 |
| 29/12/2018 | 3.8 |
| 29/12/2018 | 4.4 |
| 29/12/2018 | 5.1 |
| 29/12/2018 | 5.4 |
| 29/12/2018 | 5.5 |
| 29/12/2018 | 5.4 |
| 29/12/2018 | 5.8 |
| 29/12/2018 | 5.8 |
| 29/12/2018 | 5.4 |
| 29/12/2018 | 5.8 |
| 29/12/2018 | 5.9 |
| 29/12/2018 | 5.9 |
| 29/12/2018 | 6.3 |
| 29/12/2018 | 6.3 |
| 29/12/2018 | 5.6 |
| 29/12/2018 | 5 |
| 29/12/2018 | 4.6 |
| 29/12/2018 | 4 |
| 30/12/2018 | 2.9 |
| 30/12/2018 | 2.6 |
| 30/12/2018 | 2.4 |
| 30/12/2018 | 2.6 |
| 30/12/2018 | 2.5 |
| 30/12/2018 | 2.4 |
| 30/12/2018 | 2.2 |
| 30/12/2018 | 2.5 |
| 30/12/2018 | 3.2 |
| 30/12/2018 | 3.6 |
| 30/12/2018 | 3.4 |
| 30/12/2018 | 4 |
| 30/12/2018 | 3.8 |
| 30/12/2018 | 3.6 |
| 30/12/2018 | 3.2 |
| 30/12/2018 | 3.2 |
| 30/12/2018 | 3.4 |
| 30/12/2018 | 3.4 |
| 30/12/2018 | 4.4 |
| 30/12/2018 | 5.4 |
| 30/12/2018 | 4.4 |
| 30/12/2018 | 3.9 |
| 30/12/2018 | 3.9 |
| 30/12/2018 | 3.1 |
| 31/12/2018 | 3.4 |
| 31/12/2018 | 3.4 |
| 31/12/2018 | 3.1 |
| 31/12/2018 | 3.1 |
| 31/12/2018 | 3.1 |
| 31/12/2018 | 3.2 |
| 31/12/2018 | 3.3 |
| 31/12/2018 | 3.9 |
| 31/12/2018 | 4.4 |
| 31/12/2018 | 4.7 |
| 31/12/2018 | 5.2 |
| 31/12/2018 | 5.4 |
| 31/12/2018 | 5.5 |
| 31/12/2018 | 5 |
| 31/12/2018 | 5.1 |
| 31/12/2018 | 5.3 |
| 31/12/2018 | 6.1 |
| 31/12/2018 | 5.9 |
| 31/12/2018 | 5.7 |
| 31/12/2018 | 5.4 |
| 31/12/2018 | 4.7 |
| 31/12/2018 | 4.3 |
| 31/12/2018 | 4.3 |
| 31/12/2018 | 4 |